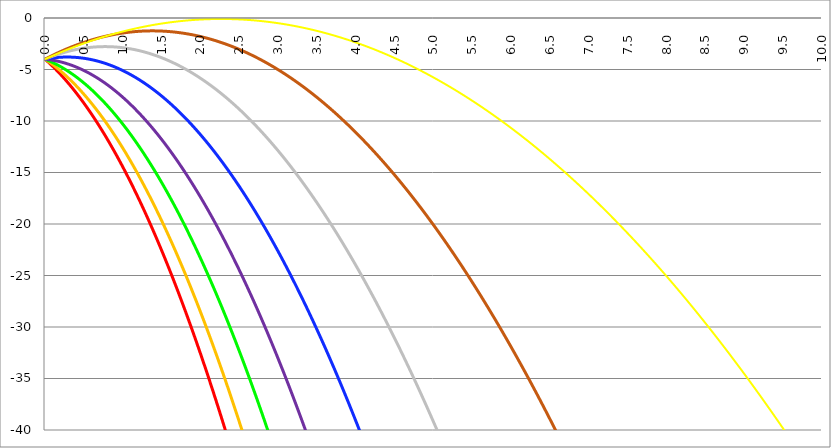
| Category | Series 1 | Series 0 | Series 3 | Series 4 | Series 5 | Series 2 | Series 6 | Series 7 |
|---|---|---|---|---|---|---|---|---|
| 0.0 | -4 | -4 | -4 | -4 | -4 | -4 | -4 | -4 |
| 0.005 | -4.033 | -4.025 | -4.015 | -4.004 | -3.993 | -3.984 | -3.98 | -3.983 |
| 0.01 | -4.066 | -4.05 | -4.03 | -4.007 | -3.986 | -3.969 | -3.96 | -3.966 |
| 0.015 | -4.1 | -4.075 | -4.045 | -4.011 | -3.979 | -3.953 | -3.941 | -3.948 |
| 0.02 | -4.134 | -4.101 | -4.06 | -4.015 | -3.972 | -3.938 | -3.921 | -3.931 |
| 0.025 | -4.167 | -4.127 | -4.075 | -4.019 | -3.965 | -3.922 | -3.901 | -3.914 |
| 0.03 | -4.202 | -4.153 | -4.091 | -4.023 | -3.958 | -3.907 | -3.882 | -3.897 |
| 0.035 | -4.236 | -4.179 | -4.107 | -4.028 | -3.952 | -3.892 | -3.862 | -3.88 |
| 0.04 | -4.27 | -4.205 | -4.123 | -4.032 | -3.946 | -3.877 | -3.843 | -3.863 |
| 0.045 | -4.305 | -4.231 | -4.139 | -4.037 | -3.939 | -3.862 | -3.824 | -3.847 |
| 0.05 | -4.34 | -4.258 | -4.155 | -4.042 | -3.933 | -3.847 | -3.805 | -3.83 |
| 0.055 | -4.375 | -4.285 | -4.171 | -4.047 | -3.927 | -3.833 | -3.785 | -3.813 |
| 0.06 | -4.41 | -4.312 | -4.188 | -4.052 | -3.922 | -3.818 | -3.766 | -3.796 |
| 0.065 | -4.445 | -4.339 | -4.205 | -4.057 | -3.916 | -3.803 | -3.747 | -3.779 |
| 0.07 | -4.481 | -4.366 | -4.222 | -4.063 | -3.91 | -3.789 | -3.728 | -3.763 |
| 0.075 | -4.517 | -4.394 | -4.239 | -4.068 | -3.905 | -3.775 | -3.71 | -3.746 |
| 0.08 | -4.553 | -4.422 | -4.256 | -4.074 | -3.9 | -3.76 | -3.691 | -3.729 |
| 0.085 | -4.589 | -4.449 | -4.273 | -4.08 | -3.894 | -3.746 | -3.672 | -3.713 |
| 0.09 | -4.625 | -4.478 | -4.291 | -4.086 | -3.889 | -3.732 | -3.653 | -3.696 |
| 0.095 | -4.662 | -4.506 | -4.309 | -4.092 | -3.884 | -3.718 | -3.635 | -3.68 |
| 0.1 | -4.699 | -4.534 | -4.327 | -4.099 | -3.88 | -3.705 | -3.616 | -3.663 |
| 0.105 | -4.736 | -4.563 | -4.345 | -4.105 | -3.875 | -3.691 | -3.598 | -3.647 |
| 0.11 | -4.773 | -4.592 | -4.363 | -4.112 | -3.87 | -3.677 | -3.58 | -3.63 |
| 0.115 | -4.81 | -4.621 | -4.382 | -4.119 | -3.866 | -3.664 | -3.561 | -3.614 |
| 0.12 | -4.848 | -4.65 | -4.4 | -4.126 | -3.862 | -3.65 | -3.543 | -3.598 |
| 0.125 | -4.885 | -4.679 | -4.419 | -4.133 | -3.857 | -3.637 | -3.525 | -3.581 |
| 0.13 | -4.923 | -4.709 | -4.438 | -4.14 | -3.853 | -3.624 | -3.507 | -3.565 |
| 0.135 | -4.961 | -4.738 | -4.457 | -4.147 | -3.849 | -3.611 | -3.489 | -3.549 |
| 0.14 | -5 | -4.768 | -4.476 | -4.155 | -3.846 | -3.598 | -3.471 | -3.533 |
| 0.145 | -5.038 | -4.798 | -4.496 | -4.163 | -3.842 | -3.585 | -3.453 | -3.516 |
| 0.15 | -5.077 | -4.829 | -4.515 | -4.171 | -3.838 | -3.572 | -3.435 | -3.5 |
| 0.155 | -5.116 | -4.859 | -4.535 | -4.179 | -3.835 | -3.56 | -3.418 | -3.484 |
| 0.16 | -5.155 | -4.89 | -4.555 | -4.187 | -3.832 | -3.547 | -3.4 | -3.468 |
| 0.165 | -5.194 | -4.921 | -4.575 | -4.195 | -3.829 | -3.535 | -3.382 | -3.452 |
| 0.17 | -5.234 | -4.952 | -4.595 | -4.204 | -3.826 | -3.522 | -3.365 | -3.436 |
| 0.175 | -5.273 | -4.983 | -4.616 | -4.212 | -3.823 | -3.51 | -3.347 | -3.42 |
| 0.18 | -5.313 | -5.014 | -4.636 | -4.221 | -3.82 | -3.498 | -3.33 | -3.404 |
| 0.185 | -5.353 | -5.046 | -4.657 | -4.23 | -3.817 | -3.486 | -3.313 | -3.389 |
| 0.19 | -5.393 | -5.077 | -4.678 | -4.239 | -3.815 | -3.474 | -3.296 | -3.373 |
| 0.195 | -5.434 | -5.109 | -4.699 | -4.248 | -3.812 | -3.462 | -3.278 | -3.357 |
| 0.2 | -5.474 | -5.141 | -4.721 | -4.258 | -3.81 | -3.45 | -3.261 | -3.341 |
| 0.205 | -5.515 | -5.174 | -4.742 | -4.267 | -3.808 | -3.438 | -3.244 | -3.326 |
| 0.21 | -5.556 | -5.206 | -4.764 | -4.277 | -3.806 | -3.427 | -3.228 | -3.31 |
| 0.215 | -5.597 | -5.239 | -4.786 | -4.286 | -3.804 | -3.415 | -3.211 | -3.294 |
| 0.22 | -5.639 | -5.271 | -4.807 | -4.296 | -3.803 | -3.404 | -3.194 | -3.279 |
| 0.225 | -5.68 | -5.304 | -4.83 | -4.307 | -3.801 | -3.393 | -3.177 | -3.263 |
| 0.23 | -5.722 | -5.338 | -4.852 | -4.317 | -3.799 | -3.382 | -3.161 | -3.248 |
| 0.235 | -5.764 | -5.371 | -4.874 | -4.327 | -3.798 | -3.371 | -3.144 | -3.232 |
| 0.24 | -5.806 | -5.405 | -4.897 | -4.338 | -3.797 | -3.36 | -3.128 | -3.217 |
| 0.245 | -5.848 | -5.438 | -4.92 | -4.349 | -3.796 | -3.349 | -3.111 | -3.202 |
| 0.25 | -5.891 | -5.472 | -4.943 | -4.359 | -3.795 | -3.338 | -3.095 | -3.186 |
| 0.255 | -5.934 | -5.506 | -4.966 | -4.37 | -3.794 | -3.328 | -3.079 | -3.171 |
| 0.26 | -5.976 | -5.541 | -4.989 | -4.382 | -3.793 | -3.317 | -3.062 | -3.156 |
| 0.265 | -6.02 | -5.575 | -5.013 | -4.393 | -3.793 | -3.307 | -3.046 | -3.14 |
| 0.27 | -6.063 | -5.61 | -5.036 | -4.404 | -3.792 | -3.296 | -3.03 | -3.125 |
| 0.275 | -6.106 | -5.644 | -5.06 | -4.416 | -3.792 | -3.286 | -3.014 | -3.11 |
| 0.28 | -6.15 | -5.679 | -5.084 | -4.428 | -3.792 | -3.276 | -2.998 | -3.095 |
| 0.285 | -6.194 | -5.715 | -5.108 | -4.44 | -3.792 | -3.266 | -2.982 | -3.08 |
| 0.29 | -6.238 | -5.75 | -5.133 | -4.452 | -3.792 | -3.256 | -2.967 | -3.065 |
| 0.295 | -6.282 | -5.785 | -5.157 | -4.464 | -3.792 | -3.246 | -2.951 | -3.05 |
| 0.3 | -6.327 | -5.821 | -5.182 | -4.476 | -3.792 | -3.236 | -2.935 | -3.035 |
| 0.305 | -6.371 | -5.857 | -5.207 | -4.489 | -3.793 | -3.227 | -2.92 | -3.02 |
| 0.31 | -6.416 | -5.893 | -5.232 | -4.501 | -3.793 | -3.217 | -2.904 | -3.005 |
| 0.315 | -6.461 | -5.929 | -5.257 | -4.514 | -3.794 | -3.208 | -2.889 | -2.99 |
| 0.32 | -6.506 | -5.966 | -5.282 | -4.527 | -3.795 | -3.199 | -2.874 | -2.975 |
| 0.325 | -6.552 | -6.003 | -5.308 | -4.54 | -3.796 | -3.189 | -2.858 | -2.961 |
| 0.33 | -6.597 | -6.039 | -5.333 | -4.554 | -3.797 | -3.18 | -2.843 | -2.946 |
| 0.335 | -6.643 | -6.076 | -5.359 | -4.567 | -3.798 | -3.171 | -2.828 | -2.931 |
| 0.34 | -6.689 | -6.114 | -5.385 | -4.581 | -3.799 | -3.162 | -2.813 | -2.916 |
| 0.345 | -6.735 | -6.151 | -5.411 | -4.594 | -3.801 | -3.154 | -2.798 | -2.902 |
| 0.35 | -6.782 | -6.188 | -5.438 | -4.608 | -3.802 | -3.145 | -2.783 | -2.887 |
| 0.355 | -6.828 | -6.226 | -5.464 | -4.622 | -3.804 | -3.136 | -2.768 | -2.873 |
| 0.36 | -6.875 | -6.264 | -5.491 | -4.636 | -3.806 | -3.128 | -2.754 | -2.858 |
| 0.365 | -6.922 | -6.302 | -5.518 | -4.651 | -3.808 | -3.119 | -2.739 | -2.844 |
| 0.37 | -6.969 | -6.34 | -5.545 | -4.665 | -3.81 | -3.111 | -2.724 | -2.829 |
| 0.375 | -7.016 | -6.379 | -5.572 | -4.68 | -3.812 | -3.103 | -2.71 | -2.815 |
| 0.38 | -7.064 | -6.418 | -5.599 | -4.694 | -3.815 | -3.095 | -2.695 | -2.801 |
| 0.385 | -7.111 | -6.456 | -5.627 | -4.709 | -3.817 | -3.087 | -2.681 | -2.786 |
| 0.39 | -7.159 | -6.495 | -5.654 | -4.724 | -3.82 | -3.079 | -2.667 | -2.772 |
| 0.395 | -7.207 | -6.535 | -5.682 | -4.74 | -3.822 | -3.071 | -2.652 | -2.758 |
| 0.4 | -7.256 | -6.574 | -5.71 | -4.755 | -3.825 | -3.063 | -2.638 | -2.743 |
| 0.405 | -7.304 | -6.613 | -5.738 | -4.771 | -3.828 | -3.056 | -2.624 | -2.729 |
| 0.41 | -7.353 | -6.653 | -5.767 | -4.786 | -3.831 | -3.048 | -2.61 | -2.715 |
| 0.415 | -7.402 | -6.693 | -5.795 | -4.802 | -3.835 | -3.041 | -2.596 | -2.701 |
| 0.42 | -7.451 | -6.733 | -5.824 | -4.818 | -3.838 | -3.034 | -2.582 | -2.687 |
| 0.425 | -7.5 | -6.773 | -5.853 | -4.834 | -3.842 | -3.027 | -2.568 | -2.673 |
| 0.43 | -7.549 | -6.814 | -5.882 | -4.85 | -3.845 | -3.02 | -2.555 | -2.659 |
| 0.435 | -7.599 | -6.855 | -5.911 | -4.867 | -3.849 | -3.013 | -2.541 | -2.645 |
| 0.44 | -7.649 | -6.895 | -5.94 | -4.883 | -3.853 | -3.006 | -2.527 | -2.631 |
| 0.445 | -7.699 | -6.936 | -5.97 | -4.9 | -3.857 | -2.999 | -2.514 | -2.617 |
| 0.45 | -7.749 | -6.978 | -5.999 | -4.917 | -3.861 | -2.992 | -2.5 | -2.604 |
| 0.455 | -7.799 | -7.019 | -6.029 | -4.934 | -3.865 | -2.986 | -2.487 | -2.59 |
| 0.46 | -7.85 | -7.06 | -6.059 | -4.951 | -3.87 | -2.979 | -2.474 | -2.576 |
| 0.465 | -7.901 | -7.102 | -6.09 | -4.968 | -3.874 | -2.973 | -2.46 | -2.562 |
| 0.47 | -7.952 | -7.144 | -6.12 | -4.986 | -3.879 | -2.967 | -2.447 | -2.549 |
| 0.475 | -8.003 | -7.186 | -6.15 | -5.003 | -3.884 | -2.961 | -2.434 | -2.535 |
| 0.48 | -8.054 | -7.228 | -6.181 | -5.021 | -3.889 | -2.955 | -2.421 | -2.521 |
| 0.485 | -8.106 | -7.271 | -6.212 | -5.039 | -3.894 | -2.949 | -2.408 | -2.508 |
| 0.49 | -8.158 | -7.314 | -6.243 | -5.057 | -3.899 | -2.943 | -2.395 | -2.494 |
| 0.495 | -8.209 | -7.356 | -6.274 | -5.075 | -3.904 | -2.937 | -2.382 | -2.481 |
| 0.5 | -8.262 | -7.399 | -6.306 | -5.094 | -3.91 | -2.931 | -2.37 | -2.467 |
| 0.505 | -8.314 | -7.443 | -6.337 | -5.112 | -3.915 | -2.926 | -2.357 | -2.454 |
| 0.51 | -8.366 | -7.486 | -6.369 | -5.131 | -3.921 | -2.92 | -2.344 | -2.441 |
| 0.515 | -8.419 | -7.529 | -6.401 | -5.15 | -3.927 | -2.915 | -2.332 | -2.427 |
| 0.52 | -8.472 | -7.573 | -6.433 | -5.169 | -3.933 | -2.91 | -2.319 | -2.414 |
| 0.525 | -8.525 | -7.617 | -6.465 | -5.188 | -3.939 | -2.905 | -2.307 | -2.401 |
| 0.53 | -8.578 | -7.661 | -6.497 | -5.207 | -3.945 | -2.9 | -2.295 | -2.387 |
| 0.535 | -8.632 | -7.705 | -6.53 | -5.226 | -3.951 | -2.895 | -2.282 | -2.374 |
| 0.54 | -8.685 | -7.75 | -6.563 | -5.246 | -3.958 | -2.89 | -2.27 | -2.361 |
| 0.545 | -8.739 | -7.795 | -6.596 | -5.266 | -3.964 | -2.885 | -2.258 | -2.348 |
| 0.55 | -8.793 | -7.839 | -6.629 | -5.286 | -3.971 | -2.881 | -2.246 | -2.335 |
| 0.555 | -8.848 | -7.884 | -6.662 | -5.306 | -3.978 | -2.876 | -2.234 | -2.322 |
| 0.56 | -8.902 | -7.93 | -6.695 | -5.326 | -3.985 | -2.872 | -2.222 | -2.309 |
| 0.565 | -8.957 | -7.975 | -6.729 | -5.346 | -3.992 | -2.867 | -2.211 | -2.296 |
| 0.57 | -9.011 | -8.02 | -6.762 | -5.367 | -3.999 | -2.863 | -2.199 | -2.283 |
| 0.575 | -9.066 | -8.066 | -6.796 | -5.387 | -4.006 | -2.859 | -2.187 | -2.27 |
| 0.58 | -9.122 | -8.112 | -6.83 | -5.408 | -4.014 | -2.855 | -2.176 | -2.257 |
| 0.585 | -9.177 | -8.158 | -6.865 | -5.429 | -4.022 | -2.851 | -2.164 | -2.245 |
| 0.59 | -9.233 | -8.205 | -6.899 | -5.45 | -4.029 | -2.847 | -2.153 | -2.232 |
| 0.595 | -9.288 | -8.251 | -6.934 | -5.471 | -4.037 | -2.844 | -2.141 | -2.219 |
| 0.6 | -9.344 | -8.298 | -6.968 | -5.493 | -4.045 | -2.84 | -2.13 | -2.206 |
| 0.605 | -9.4 | -8.344 | -7.003 | -5.514 | -4.053 | -2.837 | -2.119 | -2.194 |
| 0.61 | -9.457 | -8.391 | -7.038 | -5.536 | -4.061 | -2.833 | -2.108 | -2.181 |
| 0.615 | -9.513 | -8.439 | -7.074 | -5.557 | -4.07 | -2.83 | -2.096 | -2.169 |
| 0.62 | -9.57 | -8.486 | -7.109 | -5.579 | -4.078 | -2.827 | -2.085 | -2.156 |
| 0.625 | -9.627 | -8.534 | -7.145 | -5.602 | -4.087 | -2.824 | -2.074 | -2.144 |
| 0.63 | -9.684 | -8.581 | -7.18 | -5.624 | -4.096 | -2.821 | -2.064 | -2.131 |
| 0.635 | -9.741 | -8.629 | -7.216 | -5.646 | -4.105 | -2.818 | -2.053 | -2.119 |
| 0.64 | -9.799 | -8.677 | -7.252 | -5.669 | -4.114 | -2.815 | -2.042 | -2.106 |
| 0.645 | -9.857 | -8.726 | -7.288 | -5.692 | -4.123 | -2.812 | -2.031 | -2.094 |
| 0.65 | -9.914 | -8.774 | -7.325 | -5.714 | -4.132 | -2.81 | -2.021 | -2.082 |
| 0.655 | -9.973 | -8.823 | -7.361 | -5.737 | -4.141 | -2.807 | -2.01 | -2.069 |
| 0.66 | -10.031 | -8.872 | -7.398 | -5.761 | -4.151 | -2.805 | -2 | -2.057 |
| 0.665 | -10.089 | -8.921 | -7.435 | -5.784 | -4.161 | -2.803 | -1.99 | -2.045 |
| 0.67 | -10.148 | -8.97 | -7.472 | -5.807 | -4.17 | -2.8 | -1.979 | -2.033 |
| 0.675 | -10.207 | -9.019 | -7.509 | -5.831 | -4.18 | -2.798 | -1.969 | -2.021 |
| 0.68 | -10.266 | -9.069 | -7.547 | -5.855 | -4.19 | -2.796 | -1.959 | -2.009 |
| 0.685 | -10.325 | -9.118 | -7.584 | -5.879 | -4.201 | -2.794 | -1.949 | -1.997 |
| 0.69 | -10.384 | -9.168 | -7.622 | -5.903 | -4.211 | -2.793 | -1.939 | -1.985 |
| 0.695 | -10.444 | -9.218 | -7.66 | -5.927 | -4.221 | -2.791 | -1.929 | -1.973 |
| 0.7 | -10.504 | -9.269 | -7.698 | -5.951 | -4.232 | -2.789 | -1.919 | -1.961 |
| 0.705 | -10.564 | -9.319 | -7.737 | -5.976 | -4.243 | -2.788 | -1.909 | -1.949 |
| 0.71 | -10.624 | -9.37 | -7.775 | -6 | -4.253 | -2.787 | -1.9 | -1.937 |
| 0.715 | -10.684 | -9.421 | -7.814 | -6.025 | -4.264 | -2.785 | -1.89 | -1.925 |
| 0.72 | -10.745 | -9.472 | -7.852 | -6.05 | -4.275 | -2.784 | -1.88 | -1.913 |
| 0.725 | -10.806 | -9.523 | -7.891 | -6.075 | -4.287 | -2.783 | -1.871 | -1.902 |
| 0.73 | -10.867 | -9.574 | -7.93 | -6.101 | -4.298 | -2.782 | -1.861 | -1.89 |
| 0.735 | -10.928 | -9.626 | -7.97 | -6.126 | -4.309 | -2.781 | -1.852 | -1.878 |
| 0.74 | -10.989 | -9.678 | -8.009 | -6.152 | -4.321 | -2.781 | -1.843 | -1.867 |
| 0.745 | -11.051 | -9.729 | -8.049 | -6.177 | -4.333 | -2.78 | -1.834 | -1.855 |
| 0.75 | -11.112 | -9.782 | -8.088 | -6.203 | -4.344 | -2.78 | -1.824 | -1.844 |
| 0.755 | -11.174 | -9.834 | -8.128 | -6.229 | -4.356 | -2.779 | -1.815 | -1.832 |
| 0.76 | -11.236 | -9.886 | -8.168 | -6.255 | -4.368 | -2.779 | -1.806 | -1.821 |
| 0.765 | -11.299 | -9.939 | -8.209 | -6.282 | -4.381 | -2.779 | -1.797 | -1.809 |
| 0.77 | -11.361 | -9.992 | -8.249 | -6.308 | -4.393 | -2.778 | -1.789 | -1.798 |
| 0.775000000000001 | -11.424 | -10.045 | -8.29 | -6.335 | -4.405 | -2.778 | -1.78 | -1.786 |
| 0.78 | -11.487 | -10.098 | -8.331 | -6.361 | -4.418 | -2.778 | -1.771 | -1.775 |
| 0.785000000000001 | -11.55 | -10.151 | -8.372 | -6.388 | -4.431 | -2.779 | -1.762 | -1.764 |
| 0.79 | -11.613 | -10.205 | -8.413 | -6.415 | -4.444 | -2.779 | -1.754 | -1.753 |
| 0.795000000000001 | -11.677 | -10.259 | -8.454 | -6.443 | -4.457 | -2.779 | -1.745 | -1.741 |
| 0.800000000000001 | -11.74 | -10.313 | -8.495 | -6.47 | -4.47 | -2.78 | -1.737 | -1.73 |
| 0.805000000000001 | -11.804 | -10.367 | -8.537 | -6.498 | -4.483 | -2.78 | -1.729 | -1.719 |
| 0.810000000000001 | -11.868 | -10.421 | -8.579 | -6.525 | -4.496 | -2.781 | -1.72 | -1.708 |
| 0.815000000000001 | -11.932 | -10.475 | -8.621 | -6.553 | -4.51 | -2.782 | -1.712 | -1.697 |
| 0.820000000000001 | -11.997 | -10.53 | -8.663 | -6.581 | -4.523 | -2.783 | -1.704 | -1.686 |
| 0.825000000000001 | -12.061 | -10.585 | -8.705 | -6.609 | -4.537 | -2.784 | -1.696 | -1.675 |
| 0.830000000000001 | -12.126 | -10.64 | -8.748 | -6.637 | -4.551 | -2.785 | -1.688 | -1.664 |
| 0.835000000000001 | -12.191 | -10.695 | -8.79 | -6.666 | -4.565 | -2.786 | -1.68 | -1.653 |
| 0.840000000000001 | -12.256 | -10.75 | -8.833 | -6.694 | -4.579 | -2.787 | -1.672 | -1.642 |
| 0.845000000000001 | -12.322 | -10.806 | -8.876 | -6.723 | -4.594 | -2.789 | -1.664 | -1.631 |
| 0.850000000000001 | -12.387 | -10.862 | -8.919 | -6.752 | -4.608 | -2.79 | -1.657 | -1.621 |
| 0.855000000000001 | -12.453 | -10.918 | -8.962 | -6.781 | -4.622 | -2.792 | -1.649 | -1.61 |
| 0.860000000000001 | -12.519 | -10.974 | -9.006 | -6.81 | -4.637 | -2.794 | -1.642 | -1.599 |
| 0.865000000000001 | -12.585 | -11.03 | -9.05 | -6.839 | -4.652 | -2.795 | -1.634 | -1.588 |
| 0.870000000000001 | -12.651 | -11.087 | -9.093 | -6.869 | -4.667 | -2.797 | -1.627 | -1.578 |
| 0.875000000000001 | -12.718 | -11.143 | -9.137 | -6.898 | -4.682 | -2.799 | -1.619 | -1.567 |
| 0.880000000000001 | -12.785 | -11.2 | -9.181 | -6.928 | -4.697 | -2.801 | -1.612 | -1.557 |
| 0.885000000000001 | -12.851 | -11.257 | -9.226 | -6.958 | -4.712 | -2.804 | -1.605 | -1.546 |
| 0.890000000000001 | -12.919 | -11.314 | -9.27 | -6.988 | -4.728 | -2.806 | -1.598 | -1.536 |
| 0.895000000000001 | -12.986 | -11.372 | -9.315 | -7.018 | -4.743 | -2.808 | -1.591 | -1.525 |
| 0.900000000000001 | -13.053 | -11.429 | -9.36 | -7.049 | -4.759 | -2.811 | -1.584 | -1.515 |
| 0.905000000000001 | -13.121 | -11.487 | -9.405 | -7.079 | -4.775 | -2.813 | -1.577 | -1.504 |
| 0.910000000000001 | -13.189 | -11.545 | -9.45 | -7.11 | -4.791 | -2.816 | -1.57 | -1.494 |
| 0.915000000000001 | -13.257 | -11.603 | -9.495 | -7.141 | -4.807 | -2.819 | -1.563 | -1.484 |
| 0.920000000000001 | -13.325 | -11.661 | -9.541 | -7.172 | -4.823 | -2.822 | -1.556 | -1.474 |
| 0.925000000000001 | -13.394 | -11.72 | -9.586 | -7.203 | -4.839 | -2.825 | -1.55 | -1.463 |
| 0.930000000000001 | -13.462 | -11.778 | -9.632 | -7.234 | -4.856 | -2.828 | -1.543 | -1.453 |
| 0.935000000000001 | -13.531 | -11.837 | -9.678 | -7.265 | -4.872 | -2.831 | -1.537 | -1.443 |
| 0.940000000000001 | -13.6 | -11.896 | -9.724 | -7.297 | -4.889 | -2.835 | -1.53 | -1.433 |
| 0.945000000000001 | -13.669 | -11.955 | -9.771 | -7.329 | -4.906 | -2.838 | -1.524 | -1.423 |
| 0.950000000000001 | -13.739 | -12.015 | -9.817 | -7.361 | -4.923 | -2.842 | -1.518 | -1.413 |
| 0.955000000000001 | -13.808 | -12.074 | -9.864 | -7.393 | -4.94 | -2.845 | -1.512 | -1.403 |
| 0.960000000000001 | -13.878 | -12.134 | -9.911 | -7.425 | -4.957 | -2.849 | -1.506 | -1.393 |
| 0.965000000000001 | -13.948 | -12.194 | -9.958 | -7.457 | -4.974 | -2.853 | -1.499 | -1.383 |
| 0.970000000000001 | -14.018 | -12.254 | -10.005 | -7.49 | -4.992 | -2.857 | -1.494 | -1.373 |
| 0.975000000000001 | -14.089 | -12.315 | -10.052 | -7.522 | -5.009 | -2.861 | -1.488 | -1.363 |
| 0.980000000000001 | -14.159 | -12.375 | -10.1 | -7.555 | -5.027 | -2.865 | -1.482 | -1.354 |
| 0.985000000000001 | -14.23 | -12.436 | -10.147 | -7.588 | -5.045 | -2.869 | -1.476 | -1.344 |
| 0.990000000000001 | -14.301 | -12.496 | -10.195 | -7.621 | -5.063 | -2.874 | -1.47 | -1.334 |
| 0.995000000000001 | -14.372 | -12.557 | -10.243 | -7.654 | -5.081 | -2.878 | -1.465 | -1.324 |
| 1.000000000000001 | -14.443 | -12.619 | -10.291 | -7.688 | -5.099 | -2.883 | -1.459 | -1.315 |
| 1.005000000000001 | -14.515 | -12.68 | -10.34 | -7.721 | -5.118 | -2.887 | -1.454 | -1.305 |
| 1.01 | -14.586 | -12.742 | -10.388 | -7.755 | -5.136 | -2.892 | -1.448 | -1.296 |
| 1.015 | -14.658 | -12.803 | -10.437 | -7.788 | -5.155 | -2.897 | -1.443 | -1.286 |
| 1.02 | -14.73 | -12.865 | -10.486 | -7.822 | -5.173 | -2.902 | -1.438 | -1.276 |
| 1.025 | -14.803 | -12.927 | -10.535 | -7.857 | -5.192 | -2.907 | -1.433 | -1.267 |
| 1.03 | -14.875 | -12.99 | -10.584 | -7.891 | -5.211 | -2.912 | -1.427 | -1.258 |
| 1.035 | -14.948 | -13.052 | -10.633 | -7.925 | -5.23 | -2.917 | -1.422 | -1.248 |
| 1.04 | -15.021 | -13.115 | -10.683 | -7.96 | -5.25 | -2.923 | -1.417 | -1.239 |
| 1.045 | -15.094 | -13.178 | -10.732 | -7.995 | -5.269 | -2.928 | -1.413 | -1.23 |
| 1.05 | -15.167 | -13.241 | -10.782 | -8.029 | -5.289 | -2.934 | -1.408 | -1.22 |
| 1.054999999999999 | -15.24 | -13.304 | -10.832 | -8.064 | -5.308 | -2.94 | -1.403 | -1.211 |
| 1.059999999999999 | -15.314 | -13.367 | -10.882 | -8.1 | -5.328 | -2.945 | -1.398 | -1.202 |
| 1.064999999999999 | -15.388 | -13.431 | -10.933 | -8.135 | -5.348 | -2.951 | -1.394 | -1.193 |
| 1.069999999999999 | -15.462 | -13.495 | -10.983 | -8.17 | -5.368 | -2.957 | -1.389 | -1.184 |
| 1.074999999999999 | -15.536 | -13.559 | -11.034 | -8.206 | -5.388 | -2.963 | -1.385 | -1.175 |
| 1.079999999999999 | -15.61 | -13.623 | -11.085 | -8.242 | -5.408 | -2.97 | -1.38 | -1.166 |
| 1.084999999999999 | -15.685 | -13.687 | -11.136 | -8.278 | -5.429 | -2.976 | -1.376 | -1.157 |
| 1.089999999999999 | -15.76 | -13.751 | -11.187 | -8.314 | -5.449 | -2.982 | -1.372 | -1.148 |
| 1.094999999999999 | -15.835 | -13.816 | -11.238 | -8.35 | -5.47 | -2.989 | -1.368 | -1.139 |
| 1.099999999999999 | -15.91 | -13.881 | -11.29 | -8.386 | -5.491 | -2.995 | -1.364 | -1.13 |
| 1.104999999999998 | -15.985 | -13.946 | -11.342 | -8.423 | -5.512 | -3.002 | -1.359 | -1.121 |
| 1.109999999999998 | -16.061 | -14.011 | -11.393 | -8.459 | -5.533 | -3.009 | -1.356 | -1.112 |
| 1.114999999999998 | -16.137 | -14.077 | -11.446 | -8.496 | -5.554 | -3.016 | -1.352 | -1.103 |
| 1.119999999999998 | -16.212 | -14.142 | -11.498 | -8.533 | -5.575 | -3.023 | -1.348 | -1.095 |
| 1.124999999999998 | -16.289 | -14.208 | -11.55 | -8.57 | -5.597 | -3.03 | -1.344 | -1.086 |
| 1.129999999999998 | -16.365 | -14.274 | -11.603 | -8.608 | -5.618 | -3.037 | -1.34 | -1.077 |
| 1.134999999999998 | -16.441 | -14.34 | -11.655 | -8.645 | -5.64 | -3.044 | -1.337 | -1.069 |
| 1.139999999999998 | -16.518 | -14.406 | -11.708 | -8.683 | -5.662 | -3.052 | -1.333 | -1.06 |
| 1.144999999999998 | -16.595 | -14.473 | -11.761 | -8.72 | -5.684 | -3.059 | -1.33 | -1.052 |
| 1.149999999999997 | -16.672 | -14.539 | -11.814 | -8.758 | -5.706 | -3.067 | -1.326 | -1.043 |
| 1.154999999999997 | -16.749 | -14.606 | -11.868 | -8.796 | -5.728 | -3.075 | -1.323 | -1.035 |
| 1.159999999999997 | -16.827 | -14.673 | -11.921 | -8.834 | -5.75 | -3.083 | -1.32 | -1.026 |
| 1.164999999999997 | -16.904 | -14.74 | -11.975 | -8.873 | -5.773 | -3.09 | -1.317 | -1.018 |
| 1.169999999999997 | -16.982 | -14.808 | -12.029 | -8.911 | -5.795 | -3.099 | -1.314 | -1.009 |
| 1.174999999999997 | -17.06 | -14.875 | -12.083 | -8.95 | -5.818 | -3.107 | -1.311 | -1.001 |
| 1.179999999999997 | -17.139 | -14.943 | -12.137 | -8.988 | -5.841 | -3.115 | -1.308 | -0.993 |
| 1.184999999999997 | -17.217 | -15.011 | -12.192 | -9.027 | -5.864 | -3.123 | -1.305 | -0.985 |
| 1.189999999999997 | -17.296 | -15.079 | -12.246 | -9.066 | -5.887 | -3.132 | -1.302 | -0.976 |
| 1.194999999999996 | -17.374 | -15.148 | -12.301 | -9.106 | -5.91 | -3.14 | -1.299 | -0.968 |
| 1.199999999999996 | -17.453 | -15.216 | -12.356 | -9.145 | -5.933 | -3.149 | -1.297 | -0.96 |
| 1.204999999999996 | -17.533 | -15.285 | -12.411 | -9.185 | -5.957 | -3.158 | -1.294 | -0.952 |
| 1.209999999999996 | -17.612 | -15.354 | -12.466 | -9.224 | -5.981 | -3.166 | -1.292 | -0.944 |
| 1.214999999999996 | -17.692 | -15.423 | -12.522 | -9.264 | -6.004 | -3.175 | -1.289 | -0.936 |
| 1.219999999999996 | -17.771 | -15.492 | -12.577 | -9.304 | -6.028 | -3.184 | -1.287 | -0.928 |
| 1.224999999999996 | -17.851 | -15.561 | -12.633 | -9.344 | -6.052 | -3.194 | -1.284 | -0.92 |
| 1.229999999999996 | -17.931 | -15.631 | -12.689 | -9.384 | -6.076 | -3.203 | -1.282 | -0.912 |
| 1.234999999999996 | -18.012 | -15.701 | -12.745 | -9.425 | -6.1 | -3.212 | -1.28 | -0.904 |
| 1.239999999999996 | -18.092 | -15.77 | -12.801 | -9.465 | -6.125 | -3.222 | -1.278 | -0.896 |
| 1.244999999999995 | -18.173 | -15.841 | -12.857 | -9.506 | -6.149 | -3.231 | -1.276 | -0.889 |
| 1.249999999999995 | -18.254 | -15.911 | -12.914 | -9.547 | -6.174 | -3.241 | -1.274 | -0.881 |
| 1.254999999999995 | -18.335 | -15.981 | -12.971 | -9.588 | -6.199 | -3.251 | -1.272 | -0.873 |
| 1.259999999999995 | -18.416 | -16.052 | -13.028 | -9.629 | -6.224 | -3.261 | -1.27 | -0.865 |
| 1.264999999999995 | -18.498 | -16.123 | -13.085 | -9.67 | -6.249 | -3.27 | -1.269 | -0.858 |
| 1.269999999999995 | -18.58 | -16.194 | -13.142 | -9.712 | -6.274 | -3.281 | -1.267 | -0.85 |
| 1.274999999999995 | -18.661 | -16.265 | -13.199 | -9.753 | -6.299 | -3.291 | -1.265 | -0.843 |
| 1.279999999999995 | -18.744 | -16.337 | -13.257 | -9.795 | -6.324 | -3.301 | -1.264 | -0.835 |
| 1.284999999999995 | -18.826 | -16.408 | -13.315 | -9.837 | -6.35 | -3.311 | -1.262 | -0.828 |
| 1.289999999999994 | -18.908 | -16.48 | -13.373 | -9.879 | -6.376 | -3.322 | -1.261 | -0.82 |
| 1.294999999999994 | -18.991 | -16.552 | -13.431 | -9.921 | -6.401 | -3.332 | -1.26 | -0.813 |
| 1.299999999999994 | -19.074 | -16.624 | -13.489 | -9.964 | -6.427 | -3.343 | -1.259 | -0.806 |
| 1.304999999999994 | -19.157 | -16.696 | -13.547 | -10.006 | -6.453 | -3.354 | -1.257 | -0.798 |
| 1.309999999999994 | -19.24 | -16.769 | -13.606 | -10.049 | -6.48 | -3.365 | -1.256 | -0.791 |
| 1.314999999999994 | -19.323 | -16.841 | -13.665 | -10.092 | -6.506 | -3.376 | -1.255 | -0.784 |
| 1.319999999999994 | -19.407 | -16.914 | -13.724 | -10.135 | -6.532 | -3.387 | -1.254 | -0.776 |
| 1.324999999999994 | -19.491 | -16.987 | -13.783 | -10.178 | -6.559 | -3.398 | -1.254 | -0.769 |
| 1.329999999999994 | -19.575 | -17.06 | -13.842 | -10.221 | -6.586 | -3.409 | -1.253 | -0.762 |
| 1.334999999999993 | -19.659 | -17.134 | -13.901 | -10.264 | -6.612 | -3.421 | -1.252 | -0.755 |
| 1.339999999999993 | -19.743 | -17.207 | -13.961 | -10.308 | -6.639 | -3.432 | -1.251 | -0.748 |
| 1.344999999999993 | -19.828 | -17.281 | -14.021 | -10.352 | -6.666 | -3.444 | -1.251 | -0.741 |
| 1.349999999999993 | -19.913 | -17.355 | -14.081 | -10.396 | -6.694 | -3.456 | -1.25 | -0.734 |
| 1.354999999999993 | -19.998 | -17.429 | -14.141 | -10.44 | -6.721 | -3.467 | -1.25 | -0.727 |
| 1.359999999999993 | -20.083 | -17.504 | -14.201 | -10.484 | -6.748 | -3.479 | -1.25 | -0.72 |
| 1.364999999999993 | -20.168 | -17.578 | -14.262 | -10.528 | -6.776 | -3.491 | -1.249 | -0.713 |
| 1.369999999999993 | -20.254 | -17.653 | -14.322 | -10.573 | -6.804 | -3.503 | -1.249 | -0.706 |
| 1.374999999999993 | -20.339 | -17.728 | -14.383 | -10.617 | -6.831 | -3.516 | -1.249 | -0.7 |
| 1.379999999999993 | -20.425 | -17.803 | -14.444 | -10.662 | -6.859 | -3.528 | -1.249 | -0.693 |
| 1.384999999999992 | -20.511 | -17.878 | -14.505 | -10.707 | -6.887 | -3.54 | -1.249 | -0.686 |
| 1.389999999999992 | -20.598 | -17.953 | -14.566 | -10.752 | -6.916 | -3.553 | -1.249 | -0.679 |
| 1.394999999999992 | -20.684 | -18.029 | -14.628 | -10.797 | -6.944 | -3.565 | -1.249 | -0.673 |
| 1.399999999999992 | -20.771 | -18.105 | -14.689 | -10.842 | -6.972 | -3.578 | -1.249 | -0.666 |
| 1.404999999999992 | -20.858 | -18.181 | -14.751 | -10.888 | -7.001 | -3.591 | -1.25 | -0.66 |
| 1.409999999999992 | -20.945 | -18.257 | -14.813 | -10.934 | -7.03 | -3.604 | -1.25 | -0.653 |
| 1.414999999999992 | -21.032 | -18.333 | -14.875 | -10.979 | -7.059 | -3.617 | -1.25 | -0.647 |
| 1.419999999999992 | -21.12 | -18.409 | -14.937 | -11.025 | -7.088 | -3.63 | -1.251 | -0.64 |
| 1.424999999999992 | -21.207 | -18.486 | -15 | -11.072 | -7.117 | -3.643 | -1.251 | -0.634 |
| 1.429999999999991 | -21.295 | -18.563 | -15.062 | -11.118 | -7.146 | -3.657 | -1.252 | -0.627 |
| 1.434999999999991 | -21.383 | -18.64 | -15.125 | -11.164 | -7.175 | -3.67 | -1.253 | -0.621 |
| 1.439999999999991 | -21.471 | -18.717 | -15.188 | -11.211 | -7.205 | -3.684 | -1.254 | -0.615 |
| 1.444999999999991 | -21.56 | -18.795 | -15.251 | -11.258 | -7.234 | -3.697 | -1.254 | -0.608 |
| 1.449999999999991 | -21.648 | -18.872 | -15.315 | -11.304 | -7.264 | -3.711 | -1.255 | -0.602 |
| 1.454999999999991 | -21.737 | -18.95 | -15.378 | -11.351 | -7.294 | -3.725 | -1.256 | -0.596 |
| 1.459999999999991 | -21.826 | -19.028 | -15.442 | -11.399 | -7.324 | -3.739 | -1.258 | -0.59 |
| 1.464999999999991 | -21.915 | -19.106 | -15.506 | -11.446 | -7.354 | -3.753 | -1.259 | -0.584 |
| 1.469999999999991 | -22.005 | -19.184 | -15.569 | -11.493 | -7.385 | -3.767 | -1.26 | -0.578 |
| 1.474999999999991 | -22.094 | -19.263 | -15.634 | -11.541 | -7.415 | -3.781 | -1.261 | -0.572 |
| 1.47999999999999 | -22.184 | -19.342 | -15.698 | -11.589 | -7.445 | -3.796 | -1.263 | -0.566 |
| 1.48499999999999 | -22.274 | -19.42 | -15.762 | -11.637 | -7.476 | -3.81 | -1.264 | -0.56 |
| 1.48999999999999 | -22.364 | -19.499 | -15.827 | -11.685 | -7.507 | -3.825 | -1.266 | -0.554 |
| 1.49499999999999 | -22.454 | -19.579 | -15.892 | -11.733 | -7.538 | -3.839 | -1.267 | -0.548 |
| 1.49999999999999 | -22.545 | -19.658 | -15.957 | -11.781 | -7.569 | -3.854 | -1.269 | -0.542 |
| 1.50499999999999 | -22.636 | -19.738 | -16.022 | -11.83 | -7.6 | -3.869 | -1.271 | -0.536 |
| 1.50999999999999 | -22.726 | -19.817 | -16.087 | -11.878 | -7.631 | -3.884 | -1.272 | -0.53 |
| 1.51499999999999 | -22.818 | -19.897 | -16.153 | -11.927 | -7.663 | -3.899 | -1.274 | -0.525 |
| 1.51999999999999 | -22.909 | -19.977 | -16.218 | -11.976 | -7.694 | -3.914 | -1.276 | -0.519 |
| 1.524999999999989 | -23 | -20.058 | -16.284 | -12.025 | -7.726 | -3.929 | -1.278 | -0.513 |
| 1.529999999999989 | -23.092 | -20.138 | -16.35 | -12.075 | -7.758 | -3.945 | -1.28 | -0.508 |
| 1.534999999999989 | -23.184 | -20.219 | -16.416 | -12.124 | -7.79 | -3.96 | -1.282 | -0.502 |
| 1.539999999999989 | -23.276 | -20.3 | -16.483 | -12.174 | -7.822 | -3.976 | -1.285 | -0.497 |
| 1.544999999999989 | -23.368 | -20.381 | -16.549 | -12.223 | -7.854 | -3.992 | -1.287 | -0.491 |
| 1.549999999999989 | -23.461 | -20.462 | -16.616 | -12.273 | -7.886 | -4.007 | -1.289 | -0.486 |
| 1.554999999999989 | -23.553 | -20.543 | -16.683 | -12.323 | -7.919 | -4.023 | -1.292 | -0.48 |
| 1.559999999999989 | -23.646 | -20.625 | -16.75 | -12.373 | -7.951 | -4.039 | -1.294 | -0.475 |
| 1.564999999999989 | -23.739 | -20.707 | -16.817 | -12.424 | -7.984 | -4.055 | -1.297 | -0.47 |
| 1.569999999999989 | -23.832 | -20.789 | -16.884 | -12.474 | -8.017 | -4.071 | -1.3 | -0.464 |
| 1.574999999999988 | -23.926 | -20.871 | -16.952 | -12.525 | -8.05 | -4.088 | -1.302 | -0.459 |
| 1.579999999999988 | -24.019 | -20.953 | -17.019 | -12.575 | -8.083 | -4.104 | -1.305 | -0.454 |
| 1.584999999999988 | -24.113 | -21.036 | -17.087 | -12.626 | -8.116 | -4.121 | -1.308 | -0.448 |
| 1.589999999999988 | -24.207 | -21.118 | -17.155 | -12.677 | -8.149 | -4.137 | -1.311 | -0.443 |
| 1.594999999999988 | -24.301 | -21.201 | -17.223 | -12.729 | -8.183 | -4.154 | -1.314 | -0.438 |
| 1.599999999999988 | -24.396 | -21.284 | -17.292 | -12.78 | -8.216 | -4.171 | -1.317 | -0.433 |
| 1.604999999999988 | -24.49 | -21.368 | -17.36 | -12.832 | -8.25 | -4.188 | -1.32 | -0.428 |
| 1.609999999999988 | -24.585 | -21.451 | -17.429 | -12.883 | -8.284 | -4.205 | -1.324 | -0.423 |
| 1.614999999999987 | -24.68 | -21.535 | -17.498 | -12.935 | -8.318 | -4.222 | -1.327 | -0.418 |
| 1.619999999999987 | -24.775 | -21.618 | -17.567 | -12.987 | -8.352 | -4.239 | -1.33 | -0.413 |
| 1.624999999999987 | -24.87 | -21.702 | -17.636 | -13.039 | -8.386 | -4.256 | -1.334 | -0.408 |
| 1.629999999999987 | -24.966 | -21.786 | -17.705 | -13.091 | -8.421 | -4.274 | -1.337 | -0.403 |
| 1.634999999999987 | -25.061 | -21.871 | -17.775 | -13.144 | -8.455 | -4.291 | -1.341 | -0.399 |
| 1.639999999999987 | -25.157 | -21.955 | -17.844 | -13.196 | -8.49 | -4.309 | -1.345 | -0.394 |
| 1.644999999999987 | -25.253 | -22.04 | -17.914 | -13.249 | -8.524 | -4.327 | -1.348 | -0.389 |
| 1.649999999999987 | -25.35 | -22.125 | -17.984 | -13.302 | -8.559 | -4.344 | -1.352 | -0.384 |
| 1.654999999999987 | -25.446 | -22.21 | -18.054 | -13.355 | -8.594 | -4.362 | -1.356 | -0.38 |
| 1.659999999999986 | -25.543 | -22.295 | -18.125 | -13.408 | -8.629 | -4.38 | -1.36 | -0.375 |
| 1.664999999999986 | -25.64 | -22.38 | -18.195 | -13.461 | -8.665 | -4.398 | -1.364 | -0.37 |
| 1.669999999999986 | -25.737 | -22.466 | -18.266 | -13.515 | -8.7 | -4.417 | -1.368 | -0.366 |
| 1.674999999999986 | -25.834 | -22.552 | -18.337 | -13.568 | -8.736 | -4.435 | -1.372 | -0.361 |
| 1.679999999999986 | -25.931 | -22.638 | -18.408 | -13.622 | -8.771 | -4.453 | -1.377 | -0.357 |
| 1.684999999999986 | -26.029 | -22.724 | -18.479 | -13.676 | -8.807 | -4.472 | -1.381 | -0.352 |
| 1.689999999999986 | -26.127 | -22.81 | -18.55 | -13.73 | -8.843 | -4.491 | -1.385 | -0.348 |
| 1.694999999999986 | -26.225 | -22.897 | -18.622 | -13.784 | -8.879 | -4.509 | -1.39 | -0.344 |
| 1.699999999999986 | -26.323 | -22.983 | -18.693 | -13.839 | -8.915 | -4.528 | -1.394 | -0.339 |
| 1.704999999999986 | -26.421 | -23.07 | -18.765 | -13.893 | -8.951 | -4.547 | -1.399 | -0.335 |
| 1.709999999999985 | -26.52 | -23.157 | -18.837 | -13.948 | -8.988 | -4.566 | -1.404 | -0.331 |
| 1.714999999999985 | -26.619 | -23.245 | -18.91 | -14.003 | -9.024 | -4.585 | -1.408 | -0.327 |
| 1.719999999999985 | -26.718 | -23.332 | -18.982 | -14.058 | -9.061 | -4.605 | -1.413 | -0.322 |
| 1.724999999999985 | -26.817 | -23.42 | -19.054 | -14.113 | -9.098 | -4.624 | -1.418 | -0.318 |
| 1.729999999999985 | -26.916 | -23.507 | -19.127 | -14.168 | -9.135 | -4.643 | -1.423 | -0.314 |
| 1.734999999999985 | -27.016 | -23.595 | -19.2 | -14.223 | -9.172 | -4.663 | -1.428 | -0.31 |
| 1.739999999999985 | -27.116 | -23.683 | -19.273 | -14.279 | -9.209 | -4.683 | -1.433 | -0.306 |
| 1.744999999999985 | -27.215 | -23.772 | -19.346 | -14.335 | -9.246 | -4.702 | -1.438 | -0.302 |
| 1.749999999999985 | -27.316 | -23.86 | -19.42 | -14.391 | -9.284 | -4.722 | -1.444 | -0.298 |
| 1.754999999999984 | -27.416 | -23.949 | -19.493 | -14.447 | -9.321 | -4.742 | -1.449 | -0.294 |
| 1.759999999999984 | -27.516 | -24.038 | -19.567 | -14.503 | -9.359 | -4.762 | -1.454 | -0.29 |
| 1.764999999999984 | -27.617 | -24.127 | -19.641 | -14.559 | -9.397 | -4.782 | -1.46 | -0.287 |
| 1.769999999999984 | -27.718 | -24.216 | -19.715 | -14.616 | -9.435 | -4.803 | -1.465 | -0.283 |
| 1.774999999999984 | -27.819 | -24.305 | -19.789 | -14.672 | -9.473 | -4.823 | -1.471 | -0.279 |
| 1.779999999999984 | -27.92 | -24.395 | -19.863 | -14.729 | -9.511 | -4.844 | -1.477 | -0.275 |
| 1.784999999999984 | -28.022 | -24.485 | -19.938 | -14.786 | -9.549 | -4.864 | -1.482 | -0.272 |
| 1.789999999999984 | -28.123 | -24.575 | -20.013 | -14.843 | -9.588 | -4.885 | -1.488 | -0.268 |
| 1.794999999999984 | -28.225 | -24.665 | -20.088 | -14.9 | -9.626 | -4.906 | -1.494 | -0.264 |
| 1.799999999999984 | -28.327 | -24.755 | -20.163 | -14.957 | -9.665 | -4.926 | -1.5 | -0.261 |
| 1.804999999999983 | -28.43 | -24.846 | -20.238 | -15.015 | -9.704 | -4.947 | -1.506 | -0.257 |
| 1.809999999999983 | -28.532 | -24.936 | -20.313 | -15.073 | -9.743 | -4.969 | -1.512 | -0.254 |
| 1.814999999999983 | -28.635 | -25.027 | -20.389 | -15.13 | -9.782 | -4.99 | -1.519 | -0.25 |
| 1.819999999999983 | -28.737 | -25.118 | -20.464 | -15.188 | -9.821 | -5.011 | -1.525 | -0.247 |
| 1.824999999999983 | -28.84 | -25.21 | -20.54 | -15.247 | -9.86 | -5.032 | -1.531 | -0.244 |
| 1.829999999999983 | -28.944 | -25.301 | -20.616 | -15.305 | -9.9 | -5.054 | -1.538 | -0.24 |
| 1.834999999999983 | -29.047 | -25.393 | -20.693 | -15.363 | -9.94 | -5.075 | -1.544 | -0.237 |
| 1.839999999999983 | -29.151 | -25.484 | -20.769 | -15.422 | -9.979 | -5.097 | -1.551 | -0.234 |
| 1.844999999999983 | -29.254 | -25.576 | -20.846 | -15.481 | -10.019 | -5.119 | -1.557 | -0.23 |
| 1.849999999999982 | -29.358 | -25.668 | -20.922 | -15.539 | -10.059 | -5.141 | -1.564 | -0.227 |
| 1.854999999999982 | -29.462 | -25.761 | -20.999 | -15.598 | -10.099 | -5.163 | -1.571 | -0.224 |
| 1.859999999999982 | -29.567 | -25.853 | -21.076 | -15.658 | -10.139 | -5.185 | -1.578 | -0.221 |
| 1.864999999999982 | -29.671 | -25.946 | -21.154 | -15.717 | -10.18 | -5.207 | -1.584 | -0.218 |
| 1.869999999999982 | -29.776 | -26.039 | -21.231 | -15.776 | -10.22 | -5.23 | -1.591 | -0.215 |
| 1.874999999999982 | -29.881 | -26.132 | -21.308 | -15.836 | -10.261 | -5.252 | -1.598 | -0.212 |
| 1.879999999999982 | -29.986 | -26.225 | -21.386 | -15.896 | -10.302 | -5.274 | -1.606 | -0.209 |
| 1.884999999999982 | -30.091 | -26.319 | -21.464 | -15.956 | -10.343 | -5.297 | -1.613 | -0.206 |
| 1.889999999999982 | -30.197 | -26.412 | -21.542 | -16.016 | -10.384 | -5.32 | -1.62 | -0.203 |
| 1.894999999999982 | -30.303 | -26.506 | -21.62 | -16.076 | -10.425 | -5.343 | -1.627 | -0.2 |
| 1.899999999999981 | -30.408 | -26.6 | -21.699 | -16.136 | -10.466 | -5.366 | -1.635 | -0.198 |
| 1.904999999999981 | -30.515 | -26.694 | -21.777 | -16.197 | -10.507 | -5.389 | -1.642 | -0.195 |
| 1.909999999999981 | -30.621 | -26.788 | -21.856 | -16.257 | -10.549 | -5.412 | -1.65 | -0.192 |
| 1.914999999999981 | -30.727 | -26.883 | -21.935 | -16.318 | -10.591 | -5.435 | -1.658 | -0.189 |
| 1.919999999999981 | -30.834 | -26.978 | -22.014 | -16.379 | -10.632 | -5.458 | -1.665 | -0.187 |
| 1.924999999999981 | -30.941 | -27.072 | -22.093 | -16.44 | -10.674 | -5.482 | -1.673 | -0.184 |
| 1.929999999999981 | -31.048 | -27.168 | -22.173 | -16.502 | -10.716 | -5.505 | -1.681 | -0.181 |
| 1.934999999999981 | -31.155 | -27.263 | -22.252 | -16.563 | -10.759 | -5.529 | -1.689 | -0.179 |
| 1.939999999999981 | -31.262 | -27.358 | -22.332 | -16.625 | -10.801 | -5.553 | -1.697 | -0.176 |
| 1.94499999999998 | -31.37 | -27.454 | -22.412 | -16.686 | -10.843 | -5.576 | -1.705 | -0.174 |
| 1.94999999999998 | -31.478 | -27.55 | -22.492 | -16.748 | -10.886 | -5.6 | -1.713 | -0.172 |
| 1.95499999999998 | -31.586 | -27.646 | -22.572 | -16.81 | -10.929 | -5.624 | -1.721 | -0.169 |
| 1.95999999999998 | -31.694 | -27.742 | -22.653 | -16.872 | -10.971 | -5.649 | -1.73 | -0.167 |
| 1.96499999999998 | -31.802 | -27.838 | -22.734 | -16.935 | -11.014 | -5.673 | -1.738 | -0.165 |
| 1.96999999999998 | -31.911 | -27.935 | -22.814 | -16.997 | -11.057 | -5.697 | -1.746 | -0.162 |
| 1.97499999999998 | -32.02 | -28.031 | -22.895 | -17.06 | -11.101 | -5.722 | -1.755 | -0.16 |
| 1.97999999999998 | -32.129 | -28.128 | -22.976 | -17.122 | -11.144 | -5.746 | -1.763 | -0.158 |
| 1.98499999999998 | -32.238 | -28.225 | -23.058 | -17.185 | -11.187 | -5.771 | -1.772 | -0.156 |
| 1.98999999999998 | -32.347 | -28.322 | -23.139 | -17.248 | -11.231 | -5.796 | -1.781 | -0.154 |
| 1.994999999999979 | -32.457 | -28.42 | -23.221 | -17.312 | -11.275 | -5.82 | -1.79 | -0.151 |
| 1.999999999999979 | -32.566 | -28.517 | -23.302 | -17.375 | -11.318 | -5.845 | -1.798 | -0.149 |
| 2.004999999999979 | -32.676 | -28.615 | -23.384 | -17.439 | -11.362 | -5.87 | -1.807 | -0.147 |
| 2.009999999999979 | -32.786 | -28.713 | -23.466 | -17.502 | -11.406 | -5.896 | -1.816 | -0.145 |
| 2.014999999999979 | -32.897 | -28.811 | -23.549 | -17.566 | -11.451 | -5.921 | -1.825 | -0.143 |
| 2.019999999999979 | -33.007 | -28.91 | -23.631 | -17.63 | -11.495 | -5.946 | -1.835 | -0.142 |
| 2.02499999999998 | -33.118 | -29.008 | -23.714 | -17.694 | -11.539 | -5.972 | -1.844 | -0.14 |
| 2.029999999999979 | -33.229 | -29.107 | -23.797 | -17.758 | -11.584 | -5.997 | -1.853 | -0.138 |
| 2.034999999999979 | -33.34 | -29.206 | -23.88 | -17.823 | -11.629 | -6.023 | -1.862 | -0.136 |
| 2.039999999999979 | -33.451 | -29.305 | -23.963 | -17.887 | -11.674 | -6.049 | -1.872 | -0.134 |
| 2.044999999999979 | -33.563 | -29.404 | -24.046 | -17.952 | -11.719 | -6.075 | -1.881 | -0.133 |
| 2.049999999999978 | -33.674 | -29.503 | -24.129 | -18.017 | -11.764 | -6.101 | -1.891 | -0.131 |
| 2.054999999999978 | -33.786 | -29.603 | -24.213 | -18.082 | -11.809 | -6.127 | -1.901 | -0.129 |
| 2.059999999999978 | -33.898 | -29.703 | -24.297 | -18.147 | -11.854 | -6.153 | -1.91 | -0.128 |
| 2.064999999999978 | -34.01 | -29.803 | -24.381 | -18.212 | -11.9 | -6.179 | -1.92 | -0.126 |
| 2.069999999999978 | -34.123 | -29.903 | -24.465 | -18.278 | -11.945 | -6.206 | -1.93 | -0.125 |
| 2.074999999999978 | -34.235 | -30.003 | -24.549 | -18.343 | -11.991 | -6.232 | -1.94 | -0.123 |
| 2.079999999999978 | -34.348 | -30.104 | -24.634 | -18.409 | -12.037 | -6.259 | -1.95 | -0.122 |
| 2.084999999999978 | -34.461 | -30.204 | -24.718 | -18.475 | -12.083 | -6.285 | -1.96 | -0.12 |
| 2.089999999999978 | -34.574 | -30.305 | -24.803 | -18.541 | -12.129 | -6.312 | -1.97 | -0.119 |
| 2.094999999999978 | -34.688 | -30.406 | -24.888 | -18.607 | -12.176 | -6.339 | -1.98 | -0.118 |
| 2.099999999999977 | -34.801 | -30.508 | -24.973 | -18.674 | -12.222 | -6.366 | -1.991 | -0.116 |
| 2.104999999999977 | -34.915 | -30.609 | -25.058 | -18.74 | -12.268 | -6.393 | -2.001 | -0.115 |
| 2.109999999999977 | -35.029 | -30.711 | -25.144 | -18.807 | -12.315 | -6.42 | -2.012 | -0.114 |
| 2.114999999999977 | -35.143 | -30.812 | -25.23 | -18.874 | -12.362 | -6.448 | -2.022 | -0.113 |
| 2.119999999999977 | -35.257 | -30.914 | -25.315 | -18.941 | -12.409 | -6.475 | -2.033 | -0.112 |
| 2.124999999999977 | -35.372 | -31.017 | -25.401 | -19.008 | -12.456 | -6.503 | -2.043 | -0.111 |
| 2.129999999999977 | -35.487 | -31.119 | -25.487 | -19.075 | -12.503 | -6.53 | -2.054 | -0.11 |
| 2.134999999999977 | -35.601 | -31.221 | -25.574 | -19.142 | -12.55 | -6.558 | -2.065 | -0.109 |
| 2.139999999999977 | -35.717 | -31.324 | -25.66 | -19.21 | -12.598 | -6.586 | -2.076 | -0.108 |
| 2.144999999999976 | -35.832 | -31.427 | -25.747 | -19.278 | -12.645 | -6.614 | -2.087 | -0.107 |
| 2.149999999999976 | -35.947 | -31.53 | -25.834 | -19.346 | -12.693 | -6.642 | -2.098 | -0.106 |
| 2.154999999999976 | -36.063 | -31.633 | -25.921 | -19.414 | -12.741 | -6.67 | -2.109 | -0.105 |
| 2.159999999999976 | -36.179 | -31.737 | -26.008 | -19.482 | -12.789 | -6.698 | -2.12 | -0.104 |
| 2.164999999999976 | -36.295 | -31.84 | -26.095 | -19.55 | -12.837 | -6.726 | -2.131 | -0.103 |
| 2.169999999999976 | -36.411 | -31.944 | -26.183 | -19.619 | -12.885 | -6.755 | -2.142 | -0.102 |
| 2.174999999999976 | -36.528 | -32.048 | -26.27 | -19.687 | -12.933 | -6.783 | -2.154 | -0.102 |
| 2.179999999999976 | -36.644 | -32.152 | -26.358 | -19.756 | -12.982 | -6.812 | -2.165 | -0.101 |
| 2.184999999999976 | -36.761 | -32.257 | -26.446 | -19.825 | -13.03 | -6.841 | -2.177 | -0.1 |
| 2.189999999999975 | -36.878 | -32.361 | -26.534 | -19.894 | -13.079 | -6.87 | -2.188 | -0.1 |
| 2.194999999999975 | -36.995 | -32.466 | -26.623 | -19.963 | -13.128 | -6.898 | -2.2 | -0.099 |
| 2.199999999999975 | -37.113 | -32.571 | -26.711 | -20.032 | -13.177 | -6.928 | -2.212 | -0.099 |
| 2.204999999999975 | -37.23 | -32.676 | -26.8 | -20.102 | -13.226 | -6.957 | -2.224 | -0.098 |
| 2.209999999999975 | -37.348 | -32.781 | -26.889 | -20.172 | -13.275 | -6.986 | -2.236 | -0.098 |
| 2.214999999999975 | -37.466 | -32.886 | -26.978 | -20.241 | -13.324 | -7.015 | -2.247 | -0.097 |
| 2.219999999999975 | -37.584 | -32.992 | -27.067 | -20.311 | -13.374 | -7.045 | -2.26 | -0.097 |
| 2.224999999999975 | -37.703 | -33.098 | -27.156 | -20.382 | -13.423 | -7.074 | -2.272 | -0.097 |
| 2.229999999999975 | -37.821 | -33.204 | -27.246 | -20.452 | -13.473 | -7.104 | -2.284 | -0.096 |
| 2.234999999999975 | -37.94 | -33.31 | -27.335 | -20.522 | -13.523 | -7.134 | -2.296 | -0.096 |
| 2.239999999999974 | -38.059 | -33.416 | -27.425 | -20.593 | -13.573 | -7.164 | -2.308 | -0.096 |
| 2.244999999999974 | -38.178 | -33.523 | -27.515 | -20.664 | -13.623 | -7.194 | -2.321 | -0.096 |
| 2.249999999999974 | -38.297 | -33.63 | -27.605 | -20.734 | -13.673 | -7.224 | -2.333 | -0.096 |
| 2.254999999999974 | -38.417 | -33.736 | -27.696 | -20.805 | -13.724 | -7.254 | -2.346 | -0.095 |
| 2.259999999999974 | -38.536 | -33.844 | -27.786 | -20.877 | -13.774 | -7.284 | -2.358 | -0.095 |
| 2.264999999999974 | -38.656 | -33.951 | -27.877 | -20.948 | -13.825 | -7.314 | -2.371 | -0.095 |
| 2.269999999999974 | -38.776 | -34.058 | -27.968 | -21.019 | -13.875 | -7.345 | -2.384 | -0.095 |
| 2.274999999999974 | -38.897 | -34.166 | -28.059 | -21.091 | -13.926 | -7.375 | -2.397 | -0.095 |
| 2.279999999999974 | -39.017 | -34.274 | -28.15 | -21.163 | -13.977 | -7.406 | -2.409 | -0.095 |
| 2.284999999999973 | -39.138 | -34.382 | -28.241 | -21.235 | -14.028 | -7.437 | -2.422 | -0.096 |
| 2.289999999999973 | -39.259 | -34.49 | -28.333 | -21.307 | -14.08 | -7.468 | -2.435 | -0.096 |
| 2.294999999999973 | -39.38 | -34.598 | -28.424 | -21.379 | -14.131 | -7.499 | -2.449 | -0.096 |
| 2.299999999999973 | -39.501 | -34.707 | -28.516 | -21.451 | -14.183 | -7.53 | -2.462 | -0.096 |
| 2.304999999999973 | -39.622 | -34.815 | -28.608 | -21.524 | -14.234 | -7.561 | -2.475 | -0.096 |
| 2.309999999999973 | -39.744 | -34.924 | -28.7 | -21.596 | -14.286 | -7.592 | -2.488 | -0.097 |
| 2.314999999999973 | -39.866 | -35.033 | -28.793 | -21.669 | -14.338 | -7.624 | -2.502 | -0.097 |
| 2.319999999999973 | -39.988 | -35.143 | -28.885 | -21.742 | -14.39 | -7.655 | -2.515 | -0.098 |
| 2.324999999999973 | -40.11 | -35.252 | -28.978 | -21.815 | -14.442 | -7.687 | -2.529 | -0.098 |
| 2.329999999999972 | -40.232 | -35.362 | -29.071 | -21.889 | -14.494 | -7.718 | -2.542 | -0.098 |
| 2.334999999999972 | -40.355 | -35.471 | -29.164 | -21.962 | -14.547 | -7.75 | -2.556 | -0.099 |
| 2.339999999999972 | -40.478 | -35.581 | -29.257 | -22.036 | -14.599 | -7.782 | -2.57 | -0.099 |
| 2.344999999999972 | -40.601 | -35.692 | -29.35 | -22.109 | -14.652 | -7.814 | -2.584 | -0.1 |
| 2.349999999999972 | -40.724 | -35.802 | -29.444 | -22.183 | -14.705 | -7.846 | -2.598 | -0.101 |
| 2.354999999999972 | -40.847 | -35.912 | -29.538 | -22.257 | -14.758 | -7.878 | -2.611 | -0.101 |
| 2.359999999999972 | -40.971 | -36.023 | -29.631 | -22.331 | -14.811 | -7.911 | -2.626 | -0.102 |
| 2.364999999999972 | -41.095 | -36.134 | -29.726 | -22.406 | -14.864 | -7.943 | -2.64 | -0.103 |
| 2.369999999999972 | -41.218 | -36.245 | -29.82 | -22.48 | -14.917 | -7.976 | -2.654 | -0.103 |
| 2.374999999999972 | -41.343 | -36.356 | -29.914 | -22.555 | -14.971 | -8.008 | -2.668 | -0.104 |
| 2.379999999999971 | -41.467 | -36.468 | -30.009 | -22.629 | -15.024 | -8.041 | -2.682 | -0.105 |
| 2.384999999999971 | -41.591 | -36.579 | -30.103 | -22.704 | -15.078 | -8.074 | -2.697 | -0.106 |
| 2.389999999999971 | -41.716 | -36.691 | -30.198 | -22.779 | -15.132 | -8.107 | -2.711 | -0.107 |
| 2.394999999999971 | -41.841 | -36.803 | -30.293 | -22.855 | -15.186 | -8.14 | -2.726 | -0.108 |
| 2.399999999999971 | -41.966 | -36.915 | -30.388 | -22.93 | -15.24 | -8.173 | -2.74 | -0.109 |
| 2.404999999999971 | -42.091 | -37.028 | -30.484 | -23.006 | -15.294 | -8.206 | -2.755 | -0.11 |
| 2.409999999999971 | -42.217 | -37.14 | -30.579 | -23.081 | -15.348 | -8.239 | -2.77 | -0.111 |
| 2.414999999999971 | -42.342 | -37.253 | -30.675 | -23.157 | -15.403 | -8.273 | -2.785 | -0.112 |
| 2.419999999999971 | -42.468 | -37.366 | -30.771 | -23.233 | -15.457 | -8.306 | -2.8 | -0.113 |
| 2.42499999999997 | -42.594 | -37.479 | -30.867 | -23.309 | -15.512 | -8.34 | -2.815 | -0.114 |
| 2.42999999999997 | -42.721 | -37.592 | -30.963 | -23.385 | -15.567 | -8.374 | -2.83 | -0.116 |
| 2.43499999999997 | -42.847 | -37.706 | -31.06 | -23.462 | -15.622 | -8.408 | -2.845 | -0.117 |
| 2.43999999999997 | -42.974 | -37.819 | -31.156 | -23.538 | -15.677 | -8.442 | -2.86 | -0.118 |
| 2.44499999999997 | -43.1 | -37.933 | -31.253 | -23.615 | -15.732 | -8.476 | -2.875 | -0.12 |
| 2.44999999999997 | -43.227 | -38.047 | -31.35 | -23.692 | -15.787 | -8.51 | -2.891 | -0.121 |
| 2.45499999999997 | -43.355 | -38.161 | -31.447 | -23.769 | -15.843 | -8.544 | -2.906 | -0.122 |
| 2.45999999999997 | -43.482 | -38.275 | -31.544 | -23.846 | -15.899 | -8.578 | -2.922 | -0.124 |
| 2.46499999999997 | -43.61 | -38.39 | -31.642 | -23.923 | -15.954 | -8.613 | -2.937 | -0.125 |
| 2.46999999999997 | -43.737 | -38.505 | -31.739 | -24.001 | -16.01 | -8.647 | -2.953 | -0.127 |
| 2.474999999999969 | -43.865 | -38.62 | -31.837 | -24.078 | -16.066 | -8.682 | -2.968 | -0.128 |
| 2.479999999999969 | -43.993 | -38.735 | -31.935 | -24.156 | -16.122 | -8.717 | -2.984 | -0.13 |
| 2.484999999999969 | -44.122 | -38.85 | -32.033 | -24.234 | -16.178 | -8.752 | -3 | -0.132 |
| 2.489999999999969 | -44.25 | -38.965 | -32.131 | -24.312 | -16.235 | -8.787 | -3.016 | -0.133 |
| 2.494999999999969 | -44.379 | -39.081 | -32.229 | -24.39 | -16.291 | -8.822 | -3.032 | -0.135 |
| 2.499999999999969 | -44.508 | -39.197 | -32.328 | -24.469 | -16.348 | -8.857 | -3.048 | -0.137 |
| 2.504999999999969 | -44.637 | -39.313 | -32.427 | -24.547 | -16.405 | -8.892 | -3.064 | -0.139 |
| 2.509999999999969 | -44.766 | -39.429 | -32.526 | -24.626 | -16.462 | -8.927 | -3.08 | -0.14 |
| 2.514999999999969 | -44.896 | -39.545 | -32.625 | -24.705 | -16.519 | -8.963 | -3.097 | -0.142 |
| 2.519999999999968 | -45.026 | -39.662 | -32.724 | -24.784 | -16.576 | -8.998 | -3.113 | -0.144 |
| 2.524999999999968 | -45.155 | -39.778 | -32.823 | -24.863 | -16.633 | -9.034 | -3.129 | -0.146 |
| 2.529999999999968 | -45.286 | -39.895 | -32.923 | -24.942 | -16.69 | -9.07 | -3.146 | -0.148 |
| 2.534999999999968 | -45.416 | -40.012 | -33.023 | -25.021 | -16.748 | -9.106 | -3.162 | -0.15 |
| 2.539999999999968 | -45.546 | -40.13 | -33.123 | -25.101 | -16.806 | -9.142 | -3.179 | -0.152 |
| 2.544999999999968 | -45.677 | -40.247 | -33.223 | -25.181 | -16.863 | -9.178 | -3.196 | -0.154 |
| 2.549999999999968 | -45.808 | -40.365 | -33.323 | -25.261 | -16.921 | -9.214 | -3.213 | -0.156 |
| 2.554999999999968 | -45.939 | -40.483 | -33.423 | -25.341 | -16.979 | -9.25 | -3.229 | -0.159 |
| 2.559999999999968 | -46.07 | -40.601 | -33.524 | -25.421 | -17.038 | -9.287 | -3.246 | -0.161 |
| 2.564999999999968 | -46.201 | -40.719 | -33.625 | -25.501 | -17.096 | -9.323 | -3.263 | -0.163 |
| 2.569999999999967 | -46.333 | -40.837 | -33.726 | -25.582 | -17.154 | -9.36 | -3.28 | -0.165 |
| 2.574999999999967 | -46.465 | -40.956 | -33.827 | -25.662 | -17.213 | -9.396 | -3.298 | -0.168 |
| 2.579999999999967 | -46.597 | -41.074 | -33.928 | -25.743 | -17.272 | -9.433 | -3.315 | -0.17 |
| 2.584999999999967 | -46.729 | -41.193 | -34.029 | -25.824 | -17.33 | -9.47 | -3.332 | -0.172 |
| 2.589999999999967 | -46.861 | -41.312 | -34.131 | -25.905 | -17.389 | -9.507 | -3.349 | -0.175 |
| 2.594999999999967 | -46.994 | -41.432 | -34.233 | -25.986 | -17.448 | -9.544 | -3.367 | -0.177 |
| 2.599999999999967 | -47.127 | -41.551 | -34.335 | -26.067 | -17.508 | -9.581 | -3.384 | -0.18 |
| 2.604999999999967 | -47.26 | -41.671 | -34.437 | -26.149 | -17.567 | -9.619 | -3.402 | -0.182 |
| 2.609999999999966 | -47.393 | -41.79 | -34.539 | -26.231 | -17.626 | -9.656 | -3.42 | -0.185 |
| 2.614999999999966 | -47.526 | -41.91 | -34.642 | -26.312 | -17.686 | -9.694 | -3.437 | -0.188 |
| 2.619999999999966 | -47.66 | -42.031 | -34.744 | -26.394 | -17.746 | -9.731 | -3.455 | -0.19 |
| 2.624999999999966 | -47.793 | -42.151 | -34.847 | -26.477 | -17.805 | -9.769 | -3.473 | -0.193 |
| 2.629999999999966 | -47.927 | -42.271 | -34.95 | -26.559 | -17.865 | -9.807 | -3.491 | -0.196 |
| 2.634999999999966 | -48.061 | -42.392 | -35.053 | -26.641 | -17.925 | -9.845 | -3.509 | -0.198 |
| 2.639999999999966 | -48.196 | -42.513 | -35.156 | -26.724 | -17.986 | -9.883 | -3.527 | -0.201 |
| 2.644999999999966 | -48.33 | -42.634 | -35.26 | -26.807 | -18.046 | -9.921 | -3.545 | -0.204 |
| 2.649999999999966 | -48.465 | -42.755 | -35.363 | -26.889 | -18.106 | -9.959 | -3.563 | -0.207 |
| 2.654999999999966 | -48.6 | -42.877 | -35.467 | -26.972 | -18.167 | -9.997 | -3.582 | -0.21 |
| 2.659999999999965 | -48.735 | -42.999 | -35.571 | -27.056 | -18.228 | -10.036 | -3.6 | -0.213 |
| 2.664999999999965 | -48.87 | -43.12 | -35.675 | -27.139 | -18.289 | -10.074 | -3.618 | -0.216 |
| 2.669999999999965 | -49.006 | -43.242 | -35.779 | -27.222 | -18.35 | -10.113 | -3.637 | -0.219 |
| 2.674999999999965 | -49.141 | -43.364 | -35.884 | -27.306 | -18.411 | -10.152 | -3.655 | -0.222 |
| 2.679999999999965 | -49.277 | -43.487 | -35.988 | -27.39 | -18.472 | -10.191 | -3.674 | -0.225 |
| 2.684999999999965 | -49.413 | -43.609 | -36.093 | -27.474 | -18.533 | -10.229 | -3.693 | -0.228 |
| 2.689999999999965 | -49.549 | -43.732 | -36.198 | -27.558 | -18.595 | -10.269 | -3.712 | -0.232 |
| 2.694999999999965 | -49.686 | -43.855 | -36.303 | -27.642 | -18.656 | -10.308 | -3.73 | -0.235 |
| 2.699999999999965 | -49.822 | -43.978 | -36.409 | -27.726 | -18.718 | -10.347 | -3.749 | -0.238 |
| 2.704999999999964 | -49.959 | -44.101 | -36.514 | -27.811 | -18.78 | -10.386 | -3.768 | -0.241 |
| 2.709999999999964 | -50.096 | -44.225 | -36.62 | -27.895 | -18.842 | -10.426 | -3.788 | -0.245 |
| 2.714999999999964 | -50.233 | -44.348 | -36.726 | -27.98 | -18.904 | -10.465 | -3.807 | -0.248 |
| 2.719999999999964 | -50.371 | -44.472 | -36.831 | -28.065 | -18.967 | -10.505 | -3.826 | -0.252 |
| 2.724999999999964 | -50.508 | -44.596 | -36.938 | -28.15 | -19.029 | -10.545 | -3.845 | -0.255 |
| 2.729999999999964 | -50.646 | -44.72 | -37.044 | -28.236 | -19.091 | -10.584 | -3.865 | -0.259 |
| 2.734999999999964 | -50.784 | -44.845 | -37.15 | -28.321 | -19.154 | -10.624 | -3.884 | -0.262 |
| 2.739999999999964 | -50.922 | -44.969 | -37.257 | -28.407 | -19.217 | -10.665 | -3.904 | -0.266 |
| 2.744999999999964 | -51.06 | -45.094 | -37.364 | -28.492 | -19.28 | -10.705 | -3.923 | -0.269 |
| 2.749999999999964 | -51.199 | -45.219 | -37.471 | -28.578 | -19.343 | -10.745 | -3.943 | -0.273 |
| 2.754999999999963 | -51.338 | -45.344 | -37.578 | -28.664 | -19.406 | -10.785 | -3.963 | -0.277 |
| 2.759999999999963 | -51.476 | -45.469 | -37.685 | -28.75 | -19.469 | -10.826 | -3.982 | -0.28 |
| 2.764999999999963 | -51.616 | -45.595 | -37.793 | -28.837 | -19.533 | -10.866 | -4.002 | -0.284 |
| 2.769999999999963 | -51.755 | -45.72 | -37.9 | -28.923 | -19.596 | -10.907 | -4.022 | -0.288 |
| 2.774999999999963 | -51.894 | -45.846 | -38.008 | -29.01 | -19.66 | -10.948 | -4.042 | -0.292 |
| 2.779999999999963 | -52.034 | -45.972 | -38.116 | -29.096 | -19.724 | -10.989 | -4.062 | -0.296 |
| 2.784999999999963 | -52.174 | -46.098 | -38.224 | -29.183 | -19.788 | -11.03 | -4.082 | -0.3 |
| 2.789999999999963 | -52.314 | -46.225 | -38.333 | -29.27 | -19.852 | -11.071 | -4.103 | -0.304 |
| 2.794999999999963 | -52.454 | -46.351 | -38.441 | -29.358 | -19.916 | -11.112 | -4.123 | -0.308 |
| 2.799999999999962 | -52.595 | -46.478 | -38.55 | -29.445 | -19.98 | -11.153 | -4.143 | -0.312 |
| 2.804999999999962 | -52.735 | -46.605 | -38.659 | -29.533 | -20.045 | -11.195 | -4.164 | -0.316 |
| 2.809999999999962 | -52.876 | -46.732 | -38.768 | -29.62 | -20.109 | -11.236 | -4.184 | -0.32 |
| 2.814999999999962 | -53.017 | -46.859 | -38.877 | -29.708 | -20.174 | -11.278 | -4.205 | -0.324 |
| 2.819999999999962 | -53.158 | -46.987 | -38.986 | -29.796 | -20.239 | -11.319 | -4.226 | -0.328 |
| 2.824999999999962 | -53.3 | -47.114 | -39.096 | -29.884 | -20.304 | -11.361 | -4.246 | -0.332 |
| 2.829999999999962 | -53.441 | -47.242 | -39.205 | -29.972 | -20.369 | -11.403 | -4.267 | -0.337 |
| 2.834999999999962 | -53.583 | -47.37 | -39.315 | -30.061 | -20.434 | -11.445 | -4.288 | -0.341 |
| 2.839999999999962 | -53.725 | -47.498 | -39.425 | -30.149 | -20.499 | -11.487 | -4.309 | -0.345 |
| 2.844999999999962 | -53.867 | -47.627 | -39.535 | -30.238 | -20.565 | -11.529 | -4.33 | -0.35 |
| 2.849999999999961 | -54.01 | -47.755 | -39.646 | -30.327 | -20.63 | -11.572 | -4.351 | -0.354 |
| 2.854999999999961 | -54.152 | -47.884 | -39.756 | -30.416 | -20.696 | -11.614 | -4.372 | -0.358 |
| 2.859999999999961 | -54.295 | -48.013 | -39.867 | -30.505 | -20.762 | -11.657 | -4.394 | -0.363 |
| 2.864999999999961 | -54.438 | -48.142 | -39.978 | -30.594 | -20.828 | -11.699 | -4.415 | -0.367 |
| 2.869999999999961 | -54.581 | -48.271 | -40.089 | -30.684 | -20.894 | -11.742 | -4.436 | -0.372 |
| 2.874999999999961 | -54.724 | -48.401 | -40.2 | -30.773 | -20.96 | -11.785 | -4.458 | -0.377 |
| 2.879999999999961 | -54.868 | -48.53 | -40.311 | -30.863 | -21.027 | -11.828 | -4.479 | -0.381 |
| 2.884999999999961 | -55.011 | -48.66 | -40.423 | -30.953 | -21.093 | -11.871 | -4.501 | -0.386 |
| 2.889999999999961 | -55.155 | -48.79 | -40.534 | -31.043 | -21.16 | -11.914 | -4.523 | -0.391 |
| 2.89499999999996 | -55.299 | -48.92 | -40.646 | -31.133 | -21.226 | -11.957 | -4.544 | -0.395 |
| 2.89999999999996 | -55.444 | -49.051 | -40.758 | -31.224 | -21.293 | -12 | -4.566 | -0.4 |
| 2.90499999999996 | -55.588 | -49.181 | -40.87 | -31.314 | -21.36 | -12.044 | -4.588 | -0.405 |
| 2.90999999999996 | -55.733 | -49.312 | -40.983 | -31.405 | -21.427 | -12.087 | -4.61 | -0.41 |
| 2.91499999999996 | -55.878 | -49.443 | -41.095 | -31.496 | -21.495 | -12.131 | -4.632 | -0.415 |
| 2.91999999999996 | -56.023 | -49.574 | -41.208 | -31.587 | -21.562 | -12.175 | -4.654 | -0.42 |
| 2.92499999999996 | -56.168 | -49.705 | -41.321 | -31.678 | -21.63 | -12.218 | -4.676 | -0.425 |
| 2.92999999999996 | -56.313 | -49.837 | -41.434 | -31.769 | -21.697 | -12.262 | -4.699 | -0.43 |
| 2.93499999999996 | -56.459 | -49.968 | -41.547 | -31.86 | -21.765 | -12.306 | -4.721 | -0.435 |
| 2.93999999999996 | -56.605 | -50.1 | -41.66 | -31.952 | -21.833 | -12.35 | -4.743 | -0.44 |
| 2.944999999999959 | -56.751 | -50.232 | -41.774 | -32.044 | -21.901 | -12.395 | -4.766 | -0.445 |
| 2.949999999999959 | -56.897 | -50.364 | -41.887 | -32.136 | -21.969 | -12.439 | -4.788 | -0.45 |
| 2.954999999999959 | -57.043 | -50.497 | -42.001 | -32.228 | -22.037 | -12.484 | -4.811 | -0.455 |
| 2.959999999999959 | -57.19 | -50.629 | -42.115 | -32.32 | -22.106 | -12.528 | -4.834 | -0.461 |
| 2.964999999999959 | -57.337 | -50.762 | -42.23 | -32.412 | -22.174 | -12.573 | -4.856 | -0.466 |
| 2.969999999999959 | -57.484 | -50.895 | -42.344 | -32.505 | -22.243 | -12.617 | -4.879 | -0.471 |
| 2.974999999999959 | -57.631 | -51.028 | -42.458 | -32.597 | -22.312 | -12.662 | -4.902 | -0.477 |
| 2.979999999999959 | -57.778 | -51.161 | -42.573 | -32.69 | -22.381 | -12.707 | -4.925 | -0.482 |
| 2.984999999999959 | -57.926 | -51.295 | -42.688 | -32.783 | -22.45 | -12.752 | -4.948 | -0.488 |
| 2.989999999999958 | -58.074 | -51.428 | -42.803 | -32.876 | -22.519 | -12.797 | -4.971 | -0.493 |
| 2.994999999999958 | -58.221 | -51.562 | -42.918 | -32.969 | -22.588 | -12.843 | -4.994 | -0.499 |
| 2.999999999999958 | -58.37 | -51.696 | -43.034 | -33.062 | -22.658 | -12.888 | -5.018 | -0.504 |
| 3.004999999999958 | -58.518 | -51.83 | -43.149 | -33.156 | -22.727 | -12.934 | -5.041 | -0.51 |
| 3.009999999999958 | -58.666 | -51.965 | -43.265 | -33.25 | -22.797 | -12.979 | -5.064 | -0.515 |
| 3.014999999999958 | -58.815 | -52.099 | -43.381 | -33.343 | -22.867 | -13.025 | -5.088 | -0.521 |
| 3.019999999999958 | -58.964 | -52.234 | -43.497 | -33.437 | -22.937 | -13.071 | -5.111 | -0.527 |
| 3.024999999999958 | -59.113 | -52.369 | -43.613 | -33.532 | -23.007 | -13.116 | -5.135 | -0.532 |
| 3.029999999999958 | -59.262 | -52.504 | -43.729 | -33.626 | -23.077 | -13.162 | -5.159 | -0.538 |
| 3.034999999999958 | -59.412 | -52.639 | -43.846 | -33.72 | -23.147 | -13.208 | -5.182 | -0.544 |
| 3.039999999999957 | -59.561 | -52.775 | -43.963 | -33.815 | -23.218 | -13.255 | -5.206 | -0.55 |
| 3.044999999999957 | -59.711 | -52.91 | -44.08 | -33.91 | -23.288 | -13.301 | -5.23 | -0.556 |
| 3.049999999999957 | -59.861 | -53.046 | -44.197 | -34.004 | -23.359 | -13.347 | -5.254 | -0.562 |
| 3.054999999999957 | -60.012 | -53.182 | -44.314 | -34.099 | -23.43 | -13.394 | -5.278 | -0.568 |
| 3.059999999999957 | -60.162 | -53.318 | -44.431 | -34.195 | -23.501 | -13.44 | -5.302 | -0.574 |
| 3.064999999999957 | -60.313 | -53.455 | -44.549 | -34.29 | -23.572 | -13.487 | -5.327 | -0.58 |
| 3.069999999999957 | -60.463 | -53.591 | -44.666 | -34.385 | -23.643 | -13.534 | -5.351 | -0.586 |
| 3.074999999999957 | -60.614 | -53.728 | -44.784 | -34.481 | -23.714 | -13.581 | -5.375 | -0.592 |
| 3.079999999999957 | -60.766 | -53.865 | -44.902 | -34.577 | -23.786 | -13.628 | -5.4 | -0.598 |
| 3.084999999999956 | -60.917 | -54.002 | -45.021 | -34.673 | -23.858 | -13.675 | -5.424 | -0.604 |
| 3.089999999999956 | -61.069 | -54.139 | -45.139 | -34.769 | -23.929 | -13.722 | -5.449 | -0.611 |
| 3.094999999999956 | -61.22 | -54.277 | -45.258 | -34.865 | -24.001 | -13.769 | -5.473 | -0.617 |
| 3.099999999999956 | -61.372 | -54.414 | -45.376 | -34.961 | -24.073 | -13.817 | -5.498 | -0.623 |
| 3.104999999999956 | -61.524 | -54.552 | -45.495 | -35.058 | -24.145 | -13.864 | -5.523 | -0.63 |
| 3.109999999999956 | -61.677 | -54.69 | -45.614 | -35.154 | -24.217 | -13.912 | -5.548 | -0.636 |
| 3.114999999999956 | -61.829 | -54.828 | -45.734 | -35.251 | -24.29 | -13.96 | -5.572 | -0.642 |
| 3.119999999999956 | -61.982 | -54.967 | -45.853 | -35.348 | -24.362 | -14.007 | -5.597 | -0.649 |
| 3.124999999999956 | -62.135 | -55.105 | -45.972 | -35.445 | -24.435 | -14.055 | -5.622 | -0.655 |
| 3.129999999999955 | -62.288 | -55.244 | -46.092 | -35.543 | -24.508 | -14.103 | -5.648 | -0.662 |
| 3.134999999999955 | -62.441 | -55.383 | -46.212 | -35.64 | -24.581 | -14.151 | -5.673 | -0.668 |
| 3.139999999999955 | -62.595 | -55.522 | -46.332 | -35.738 | -24.654 | -14.2 | -5.698 | -0.675 |
| 3.144999999999955 | -62.749 | -55.661 | -46.452 | -35.835 | -24.727 | -14.248 | -5.723 | -0.682 |
| 3.149999999999955 | -62.902 | -55.801 | -46.573 | -35.933 | -24.8 | -14.296 | -5.749 | -0.688 |
| 3.154999999999955 | -63.057 | -55.94 | -46.693 | -36.031 | -24.873 | -14.345 | -5.774 | -0.695 |
| 3.159999999999955 | -63.211 | -56.08 | -46.814 | -36.129 | -24.947 | -14.394 | -5.8 | -0.702 |
| 3.164999999999955 | -63.365 | -56.22 | -46.935 | -36.228 | -25.021 | -14.442 | -5.826 | -0.709 |
| 3.169999999999955 | -63.52 | -56.36 | -47.056 | -36.326 | -25.094 | -14.491 | -5.851 | -0.716 |
| 3.174999999999955 | -63.675 | -56.501 | -47.177 | -36.425 | -25.168 | -14.54 | -5.877 | -0.722 |
| 3.179999999999954 | -63.83 | -56.641 | -47.299 | -36.523 | -25.242 | -14.589 | -5.903 | -0.729 |
| 3.184999999999954 | -63.985 | -56.782 | -47.42 | -36.622 | -25.317 | -14.638 | -5.929 | -0.736 |
| 3.189999999999954 | -64.14 | -56.923 | -47.542 | -36.721 | -25.391 | -14.687 | -5.955 | -0.743 |
| 3.194999999999954 | -64.296 | -57.064 | -47.664 | -36.821 | -25.465 | -14.737 | -5.981 | -0.75 |
| 3.199999999999954 | -64.452 | -57.205 | -47.786 | -36.92 | -25.54 | -14.786 | -6.007 | -0.757 |
| 3.204999999999954 | -64.608 | -57.347 | -47.908 | -37.02 | -25.615 | -14.836 | -6.033 | -0.765 |
| 3.209999999999954 | -64.764 | -57.489 | -48.031 | -37.119 | -25.689 | -14.885 | -6.06 | -0.772 |
| 3.214999999999954 | -64.92 | -57.63 | -48.154 | -37.219 | -25.764 | -14.935 | -6.086 | -0.779 |
| 3.219999999999954 | -65.077 | -57.772 | -48.276 | -37.319 | -25.839 | -14.985 | -6.112 | -0.786 |
| 3.224999999999953 | -65.234 | -57.915 | -48.399 | -37.419 | -25.915 | -15.035 | -6.139 | -0.793 |
| 3.229999999999953 | -65.391 | -58.057 | -48.522 | -37.519 | -25.99 | -15.085 | -6.165 | -0.801 |
| 3.234999999999953 | -65.548 | -58.2 | -48.646 | -37.62 | -26.065 | -15.135 | -6.192 | -0.808 |
| 3.239999999999953 | -65.705 | -58.342 | -48.769 | -37.72 | -26.141 | -15.185 | -6.219 | -0.815 |
| 3.244999999999953 | -65.863 | -58.485 | -48.893 | -37.821 | -26.217 | -15.236 | -6.246 | -0.823 |
| 3.249999999999953 | -66.02 | -58.628 | -49.016 | -37.922 | -26.292 | -15.286 | -6.272 | -0.83 |
| 3.254999999999953 | -66.178 | -58.772 | -49.14 | -38.023 | -26.368 | -15.337 | -6.299 | -0.838 |
| 3.259999999999953 | -66.336 | -58.915 | -49.264 | -38.124 | -26.444 | -15.388 | -6.326 | -0.845 |
| 3.264999999999952 | -66.495 | -59.059 | -49.389 | -38.225 | -26.521 | -15.438 | -6.353 | -0.853 |
| 3.269999999999952 | -66.653 | -59.203 | -49.513 | -38.327 | -26.597 | -15.489 | -6.381 | -0.86 |
| 3.274999999999952 | -66.812 | -59.347 | -49.638 | -38.428 | -26.673 | -15.54 | -6.408 | -0.868 |
| 3.279999999999952 | -66.971 | -59.491 | -49.763 | -38.53 | -26.75 | -15.591 | -6.435 | -0.876 |
| 3.284999999999952 | -67.13 | -59.635 | -49.888 | -38.632 | -26.827 | -15.642 | -6.462 | -0.884 |
| 3.289999999999952 | -67.289 | -59.78 | -50.013 | -38.734 | -26.904 | -15.694 | -6.49 | -0.891 |
| 3.294999999999952 | -67.449 | -59.924 | -50.138 | -38.836 | -26.981 | -15.745 | -6.517 | -0.899 |
| 3.299999999999952 | -67.608 | -60.069 | -50.263 | -38.939 | -27.058 | -15.797 | -6.545 | -0.907 |
| 3.304999999999952 | -67.768 | -60.214 | -50.389 | -39.041 | -27.135 | -15.848 | -6.573 | -0.915 |
| 3.309999999999952 | -67.928 | -60.36 | -50.515 | -39.144 | -27.212 | -15.9 | -6.6 | -0.923 |
| 3.314999999999951 | -68.088 | -60.505 | -50.641 | -39.247 | -27.29 | -15.952 | -6.628 | -0.931 |
| 3.319999999999951 | -68.249 | -60.651 | -50.767 | -39.35 | -27.367 | -16.003 | -6.656 | -0.939 |
| 3.324999999999951 | -68.409 | -60.797 | -50.893 | -39.453 | -27.445 | -16.055 | -6.684 | -0.947 |
| 3.329999999999951 | -68.57 | -60.943 | -51.02 | -39.556 | -27.523 | -16.108 | -6.712 | -0.955 |
| 3.334999999999951 | -68.731 | -61.089 | -51.146 | -39.659 | -27.601 | -16.16 | -6.74 | -0.963 |
| 3.339999999999951 | -68.892 | -61.235 | -51.273 | -39.763 | -27.679 | -16.212 | -6.768 | -0.971 |
| 3.344999999999951 | -69.054 | -61.382 | -51.4 | -39.867 | -27.758 | -16.264 | -6.796 | -0.979 |
| 3.349999999999951 | -69.215 | -61.529 | -51.527 | -39.971 | -27.836 | -16.317 | -6.825 | -0.987 |
| 3.354999999999951 | -69.377 | -61.675 | -51.654 | -40.075 | -27.914 | -16.37 | -6.853 | -0.996 |
| 3.359999999999951 | -69.539 | -61.823 | -51.782 | -40.179 | -27.993 | -16.422 | -6.882 | -1.004 |
| 3.36499999999995 | -69.701 | -61.97 | -51.91 | -40.283 | -28.072 | -16.475 | -6.91 | -1.012 |
| 3.36999999999995 | -69.863 | -62.117 | -52.037 | -40.388 | -28.151 | -16.528 | -6.939 | -1.021 |
| 3.37499999999995 | -70.026 | -62.265 | -52.165 | -40.492 | -28.23 | -16.581 | -6.967 | -1.029 |
| 3.37999999999995 | -70.189 | -62.413 | -52.293 | -40.597 | -28.309 | -16.634 | -6.996 | -1.037 |
| 3.38499999999995 | -70.351 | -62.561 | -52.422 | -40.702 | -28.388 | -16.687 | -7.025 | -1.046 |
| 3.38999999999995 | -70.515 | -62.709 | -52.55 | -40.807 | -28.468 | -16.741 | -7.054 | -1.054 |
| 3.39499999999995 | -70.678 | -62.857 | -52.679 | -40.912 | -28.547 | -16.794 | -7.083 | -1.063 |
| 3.39999999999995 | -70.841 | -63.006 | -52.808 | -41.017 | -28.627 | -16.848 | -7.112 | -1.072 |
| 3.40499999999995 | -71.005 | -63.155 | -52.937 | -41.123 | -28.707 | -16.901 | -7.141 | -1.08 |
| 3.409999999999949 | -71.169 | -63.304 | -53.066 | -41.229 | -28.787 | -16.955 | -7.17 | -1.089 |
| 3.414999999999949 | -71.333 | -63.453 | -53.195 | -41.334 | -28.867 | -17.009 | -7.199 | -1.098 |
| 3.419999999999949 | -71.497 | -63.602 | -53.325 | -41.44 | -28.947 | -17.063 | -7.228 | -1.106 |
| 3.424999999999949 | -71.662 | -63.752 | -53.454 | -41.547 | -29.027 | -17.117 | -7.258 | -1.115 |
| 3.429999999999949 | -71.826 | -63.901 | -53.584 | -41.653 | -29.108 | -17.171 | -7.287 | -1.124 |
| 3.434999999999949 | -71.991 | -64.051 | -53.714 | -41.759 | -29.188 | -17.225 | -7.317 | -1.133 |
| 3.439999999999949 | -72.156 | -64.201 | -53.844 | -41.866 | -29.269 | -17.279 | -7.346 | -1.142 |
| 3.444999999999949 | -72.321 | -64.351 | -53.975 | -41.973 | -29.35 | -17.334 | -7.376 | -1.151 |
| 3.449999999999949 | -72.487 | -64.502 | -54.105 | -42.079 | -29.431 | -17.388 | -7.406 | -1.16 |
| 3.454999999999949 | -72.652 | -64.652 | -54.236 | -42.186 | -29.512 | -17.443 | -7.436 | -1.169 |
| 3.459999999999948 | -72.818 | -64.803 | -54.367 | -42.294 | -29.593 | -17.498 | -7.466 | -1.178 |
| 3.464999999999948 | -72.984 | -64.954 | -54.498 | -42.401 | -29.674 | -17.553 | -7.495 | -1.187 |
| 3.469999999999948 | -73.15 | -65.105 | -54.629 | -42.508 | -29.756 | -17.608 | -7.526 | -1.196 |
| 3.474999999999948 | -73.317 | -65.256 | -54.76 | -42.616 | -29.837 | -17.663 | -7.556 | -1.205 |
| 3.479999999999948 | -73.483 | -65.408 | -54.892 | -42.724 | -29.919 | -17.718 | -7.586 | -1.214 |
| 3.484999999999948 | -73.65 | -65.559 | -55.023 | -42.832 | -30.001 | -17.773 | -7.616 | -1.224 |
| 3.489999999999948 | -73.817 | -65.711 | -55.155 | -42.94 | -30.083 | -17.828 | -7.646 | -1.233 |
| 3.494999999999948 | -73.984 | -65.863 | -55.287 | -43.048 | -30.165 | -17.884 | -7.677 | -1.242 |
| 3.499999999999948 | -74.151 | -66.015 | -55.419 | -43.156 | -30.247 | -17.939 | -7.707 | -1.251 |
| 3.504999999999947 | -74.319 | -66.168 | -55.552 | -43.265 | -30.33 | -17.995 | -7.738 | -1.261 |
| 3.509999999999947 | -74.486 | -66.32 | -55.684 | -43.373 | -30.412 | -18.051 | -7.768 | -1.27 |
| 3.514999999999947 | -74.654 | -66.473 | -55.817 | -43.482 | -30.495 | -18.107 | -7.799 | -1.28 |
| 3.519999999999947 | -74.822 | -66.626 | -55.95 | -43.591 | -30.577 | -18.163 | -7.83 | -1.289 |
| 3.524999999999947 | -74.991 | -66.779 | -56.083 | -43.7 | -30.66 | -18.219 | -7.861 | -1.299 |
| 3.529999999999947 | -75.159 | -66.932 | -56.216 | -43.81 | -30.743 | -18.275 | -7.891 | -1.308 |
| 3.534999999999947 | -75.328 | -67.086 | -56.349 | -43.919 | -30.826 | -18.331 | -7.922 | -1.318 |
| 3.539999999999947 | -75.497 | -67.24 | -56.483 | -44.029 | -30.91 | -18.388 | -7.953 | -1.328 |
| 3.544999999999947 | -75.666 | -67.393 | -56.616 | -44.138 | -30.993 | -18.444 | -7.985 | -1.337 |
| 3.549999999999947 | -75.835 | -67.547 | -56.75 | -44.248 | -31.077 | -18.501 | -8.016 | -1.347 |
| 3.554999999999946 | -76.004 | -67.702 | -56.884 | -44.358 | -31.16 | -18.557 | -8.047 | -1.357 |
| 3.559999999999946 | -76.174 | -67.856 | -57.018 | -44.468 | -31.244 | -18.614 | -8.078 | -1.367 |
| 3.564999999999946 | -76.344 | -68.011 | -57.153 | -44.579 | -31.328 | -18.671 | -8.11 | -1.377 |
| 3.569999999999946 | -76.514 | -68.165 | -57.287 | -44.689 | -31.412 | -18.728 | -8.141 | -1.386 |
| 3.574999999999946 | -76.684 | -68.32 | -57.422 | -44.8 | -31.496 | -18.785 | -8.173 | -1.396 |
| 3.579999999999946 | -76.854 | -68.475 | -57.557 | -44.91 | -31.58 | -18.842 | -8.204 | -1.406 |
| 3.584999999999946 | -77.025 | -68.631 | -57.692 | -45.021 | -31.665 | -18.9 | -8.236 | -1.416 |
| 3.589999999999946 | -77.196 | -68.786 | -57.827 | -45.132 | -31.749 | -18.957 | -8.268 | -1.426 |
| 3.594999999999946 | -77.367 | -68.942 | -57.962 | -45.244 | -31.834 | -19.015 | -8.3 | -1.436 |
| 3.599999999999945 | -77.538 | -69.098 | -58.098 | -45.355 | -31.919 | -19.072 | -8.332 | -1.447 |
| 3.604999999999945 | -77.709 | -69.254 | -58.234 | -45.467 | -32.004 | -19.13 | -8.363 | -1.457 |
| 3.609999999999945 | -77.881 | -69.41 | -58.369 | -45.578 | -32.089 | -19.188 | -8.396 | -1.467 |
| 3.614999999999945 | -78.053 | -69.566 | -58.506 | -45.69 | -32.174 | -19.246 | -8.428 | -1.477 |
| 3.619999999999945 | -78.224 | -69.723 | -58.642 | -45.802 | -32.259 | -19.304 | -8.46 | -1.487 |
| 3.624999999999945 | -78.397 | -69.88 | -58.778 | -45.914 | -32.345 | -19.362 | -8.492 | -1.498 |
| 3.629999999999945 | -78.569 | -70.037 | -58.915 | -46.026 | -32.43 | -19.42 | -8.524 | -1.508 |
| 3.634999999999945 | -78.741 | -70.194 | -59.051 | -46.139 | -32.516 | -19.478 | -8.557 | -1.518 |
| 3.639999999999945 | -78.914 | -70.351 | -59.188 | -46.251 | -32.602 | -19.537 | -8.589 | -1.529 |
| 3.644999999999944 | -79.087 | -70.508 | -59.325 | -46.364 | -32.688 | -19.595 | -8.622 | -1.539 |
| 3.649999999999944 | -79.26 | -70.666 | -59.462 | -46.477 | -32.774 | -19.654 | -8.654 | -1.55 |
| 3.654999999999944 | -79.433 | -70.824 | -59.6 | -46.59 | -32.86 | -19.712 | -8.687 | -1.56 |
| 3.659999999999944 | -79.607 | -70.982 | -59.737 | -46.703 | -32.946 | -19.771 | -8.72 | -1.571 |
| 3.664999999999944 | -79.78 | -71.14 | -59.875 | -46.816 | -33.033 | -19.83 | -8.753 | -1.581 |
| 3.669999999999944 | -79.954 | -71.299 | -60.013 | -46.93 | -33.119 | -19.889 | -8.786 | -1.592 |
| 3.674999999999944 | -80.128 | -71.457 | -60.151 | -47.043 | -33.206 | -19.948 | -8.819 | -1.603 |
| 3.679999999999944 | -80.303 | -71.616 | -60.289 | -47.157 | -33.293 | -20.008 | -8.852 | -1.614 |
| 3.684999999999944 | -80.477 | -71.775 | -60.428 | -47.271 | -33.38 | -20.067 | -8.885 | -1.624 |
| 3.689999999999943 | -80.652 | -71.934 | -60.566 | -47.385 | -33.467 | -20.126 | -8.918 | -1.635 |
| 3.694999999999943 | -80.826 | -72.093 | -60.705 | -47.499 | -33.554 | -20.186 | -8.951 | -1.646 |
| 3.699999999999943 | -81.001 | -72.253 | -60.844 | -47.614 | -33.641 | -20.246 | -8.985 | -1.657 |
| 3.704999999999943 | -81.177 | -72.412 | -60.983 | -47.728 | -33.729 | -20.305 | -9.018 | -1.668 |
| 3.709999999999943 | -81.352 | -72.572 | -61.122 | -47.843 | -33.817 | -20.365 | -9.052 | -1.679 |
| 3.714999999999943 | -81.528 | -72.732 | -61.262 | -47.958 | -33.904 | -20.425 | -9.085 | -1.69 |
| 3.719999999999943 | -81.703 | -72.893 | -61.401 | -48.073 | -33.992 | -20.485 | -9.119 | -1.701 |
| 3.724999999999943 | -81.879 | -73.053 | -61.541 | -48.188 | -34.08 | -20.545 | -9.152 | -1.712 |
| 3.729999999999943 | -82.055 | -73.214 | -61.681 | -48.303 | -34.168 | -20.606 | -9.186 | -1.723 |
| 3.734999999999943 | -82.232 | -73.374 | -61.821 | -48.418 | -34.256 | -20.666 | -9.22 | -1.734 |
| 3.739999999999942 | -82.408 | -73.535 | -61.961 | -48.534 | -34.345 | -20.726 | -9.254 | -1.745 |
| 3.744999999999942 | -82.585 | -73.696 | -62.101 | -48.65 | -34.433 | -20.787 | -9.288 | -1.756 |
| 3.749999999999942 | -82.762 | -73.858 | -62.242 | -48.766 | -34.522 | -20.848 | -9.322 | -1.768 |
| 3.754999999999942 | -82.939 | -74.019 | -62.383 | -48.882 | -34.611 | -20.908 | -9.356 | -1.779 |
| 3.759999999999942 | -83.116 | -74.181 | -62.524 | -48.998 | -34.7 | -20.969 | -9.39 | -1.79 |
| 3.764999999999942 | -83.294 | -74.343 | -62.665 | -49.114 | -34.789 | -21.03 | -9.425 | -1.802 |
| 3.769999999999942 | -83.472 | -74.505 | -62.806 | -49.231 | -34.878 | -21.091 | -9.459 | -1.813 |
| 3.774999999999942 | -83.649 | -74.667 | -62.947 | -49.347 | -34.967 | -21.152 | -9.493 | -1.824 |
| 3.779999999999942 | -83.828 | -74.829 | -63.089 | -49.464 | -35.056 | -21.214 | -9.528 | -1.836 |
| 3.784999999999941 | -84.006 | -74.992 | -63.231 | -49.581 | -35.146 | -21.275 | -9.562 | -1.847 |
| 3.789999999999941 | -84.184 | -75.155 | -63.373 | -49.698 | -35.236 | -21.337 | -9.597 | -1.859 |
| 3.794999999999941 | -84.363 | -75.318 | -63.515 | -49.815 | -35.325 | -21.398 | -9.632 | -1.871 |
| 3.799999999999941 | -84.542 | -75.481 | -63.657 | -49.932 | -35.415 | -21.46 | -9.667 | -1.882 |
| 3.804999999999941 | -84.721 | -75.644 | -63.799 | -50.05 | -35.505 | -21.522 | -9.701 | -1.894 |
| 3.809999999999941 | -84.9 | -75.807 | -63.942 | -50.168 | -35.596 | -21.584 | -9.736 | -1.906 |
| 3.814999999999941 | -85.079 | -75.971 | -64.085 | -50.285 | -35.686 | -21.646 | -9.771 | -1.917 |
| 3.819999999999941 | -85.259 | -76.135 | -64.228 | -50.403 | -35.776 | -21.708 | -9.806 | -1.929 |
| 3.824999999999941 | -85.439 | -76.299 | -64.371 | -50.522 | -35.867 | -21.77 | -9.842 | -1.941 |
| 3.829999999999941 | -85.619 | -76.463 | -64.514 | -50.64 | -35.958 | -21.832 | -9.877 | -1.953 |
| 3.83499999999994 | -85.799 | -76.628 | -64.657 | -50.758 | -36.048 | -21.894 | -9.912 | -1.965 |
| 3.83999999999994 | -85.979 | -76.792 | -64.801 | -50.877 | -36.139 | -21.957 | -9.947 | -1.977 |
| 3.84499999999994 | -86.16 | -76.957 | -64.945 | -50.996 | -36.23 | -22.02 | -9.983 | -1.989 |
| 3.84999999999994 | -86.341 | -77.122 | -65.089 | -51.114 | -36.322 | -22.082 | -10.018 | -2.001 |
| 3.85499999999994 | -86.522 | -77.287 | -65.233 | -51.233 | -36.413 | -22.145 | -10.054 | -2.013 |
| 3.85999999999994 | -86.703 | -77.452 | -65.377 | -51.353 | -36.504 | -22.208 | -10.09 | -2.025 |
| 3.86499999999994 | -86.884 | -77.618 | -65.522 | -51.472 | -36.596 | -22.271 | -10.125 | -2.037 |
| 3.86999999999994 | -87.066 | -77.783 | -65.666 | -51.591 | -36.688 | -22.334 | -10.161 | -2.049 |
| 3.87499999999994 | -87.247 | -77.949 | -65.811 | -51.711 | -36.779 | -22.397 | -10.197 | -2.061 |
| 3.879999999999939 | -87.429 | -78.115 | -65.956 | -51.831 | -36.871 | -22.461 | -10.233 | -2.074 |
| 3.884999999999939 | -87.611 | -78.282 | -66.101 | -51.951 | -36.963 | -22.524 | -10.269 | -2.086 |
| 3.889999999999939 | -87.794 | -78.448 | -66.246 | -52.071 | -37.056 | -22.588 | -10.305 | -2.098 |
| 3.894999999999939 | -87.976 | -78.615 | -66.392 | -52.191 | -37.148 | -22.651 | -10.341 | -2.111 |
| 3.899999999999939 | -88.159 | -78.781 | -66.537 | -52.311 | -37.24 | -22.715 | -10.377 | -2.123 |
| 3.904999999999939 | -88.342 | -78.948 | -66.683 | -52.432 | -37.333 | -22.779 | -10.414 | -2.135 |
| 3.909999999999939 | -88.525 | -79.115 | -66.829 | -52.552 | -37.426 | -22.843 | -10.45 | -2.148 |
| 3.914999999999939 | -88.708 | -79.283 | -66.975 | -52.673 | -37.519 | -22.907 | -10.486 | -2.16 |
| 3.919999999999939 | -88.892 | -79.45 | -67.121 | -52.794 | -37.612 | -22.971 | -10.523 | -2.173 |
| 3.924999999999939 | -89.075 | -79.618 | -67.268 | -52.915 | -37.705 | -23.035 | -10.559 | -2.185 |
| 3.929999999999938 | -89.259 | -79.786 | -67.414 | -53.037 | -37.798 | -23.099 | -10.596 | -2.198 |
| 3.934999999999938 | -89.443 | -79.954 | -67.561 | -53.158 | -37.891 | -23.164 | -10.633 | -2.211 |
| 3.939999999999938 | -89.627 | -80.122 | -67.708 | -53.28 | -37.985 | -23.228 | -10.67 | -2.223 |
| 3.944999999999938 | -89.812 | -80.29 | -67.855 | -53.401 | -38.078 | -23.293 | -10.706 | -2.236 |
| 3.949999999999938 | -89.996 | -80.459 | -68.003 | -53.523 | -38.172 | -23.358 | -10.743 | -2.249 |
| 3.954999999999938 | -90.181 | -80.628 | -68.15 | -53.645 | -38.266 | -23.423 | -10.78 | -2.262 |
| 3.959999999999938 | -90.366 | -80.797 | -68.298 | -53.767 | -38.36 | -23.488 | -10.818 | -2.275 |
| 3.964999999999938 | -90.551 | -80.966 | -68.446 | -53.89 | -38.454 | -23.553 | -10.855 | -2.288 |
| 3.969999999999938 | -90.737 | -81.135 | -68.593 | -54.012 | -38.549 | -23.618 | -10.892 | -2.3 |
| 3.974999999999937 | -90.922 | -81.305 | -68.742 | -54.135 | -38.643 | -23.683 | -10.929 | -2.313 |
| 3.979999999999937 | -91.108 | -81.474 | -68.89 | -54.257 | -38.737 | -23.748 | -10.967 | -2.326 |
| 3.984999999999937 | -91.294 | -81.644 | -69.038 | -54.38 | -38.832 | -23.814 | -11.004 | -2.339 |
| 3.989999999999937 | -91.48 | -81.814 | -69.187 | -54.503 | -38.927 | -23.879 | -11.042 | -2.353 |
| 3.994999999999937 | -91.666 | -81.984 | -69.336 | -54.627 | -39.022 | -23.945 | -11.079 | -2.366 |
| 3.999999999999937 | -91.853 | -82.155 | -69.485 | -54.75 | -39.117 | -24.011 | -11.117 | -2.379 |
| 4.004999999999937 | -92.04 | -82.325 | -69.634 | -54.874 | -39.212 | -24.077 | -11.155 | -2.392 |
| 4.009999999999936 | -92.226 | -82.496 | -69.783 | -54.997 | -39.307 | -24.143 | -11.192 | -2.405 |
| 4.014999999999937 | -92.414 | -82.667 | -69.933 | -55.121 | -39.403 | -24.209 | -11.23 | -2.418 |
| 4.019999999999936 | -92.601 | -82.838 | -70.082 | -55.245 | -39.498 | -24.275 | -11.268 | -2.432 |
| 4.024999999999936 | -92.788 | -83.01 | -70.232 | -55.369 | -39.594 | -24.341 | -11.306 | -2.445 |
| 4.029999999999936 | -92.976 | -83.181 | -70.382 | -55.493 | -39.69 | -24.408 | -11.344 | -2.459 |
| 4.034999999999936 | -93.164 | -83.353 | -70.532 | -55.618 | -39.786 | -24.474 | -11.382 | -2.472 |
| 4.039999999999936 | -93.352 | -83.525 | -70.683 | -55.742 | -39.882 | -24.541 | -11.421 | -2.485 |
| 4.044999999999936 | -93.54 | -83.697 | -70.833 | -55.867 | -39.978 | -24.607 | -11.459 | -2.499 |
| 4.049999999999935 | -93.729 | -83.869 | -70.984 | -55.992 | -40.074 | -24.674 | -11.497 | -2.512 |
| 4.054999999999936 | -93.917 | -84.041 | -71.135 | -56.117 | -40.171 | -24.741 | -11.536 | -2.526 |
| 4.059999999999935 | -94.106 | -84.214 | -71.286 | -56.242 | -40.267 | -24.808 | -11.574 | -2.54 |
| 4.064999999999936 | -94.295 | -84.387 | -71.437 | -56.367 | -40.364 | -24.875 | -11.613 | -2.553 |
| 4.069999999999935 | -94.484 | -84.56 | -71.588 | -56.493 | -40.461 | -24.942 | -11.652 | -2.567 |
| 4.074999999999935 | -94.674 | -84.733 | -71.74 | -56.618 | -40.558 | -25.009 | -11.69 | -2.581 |
| 4.079999999999935 | -94.863 | -84.906 | -71.891 | -56.744 | -40.655 | -25.077 | -11.729 | -2.594 |
| 4.084999999999935 | -95.053 | -85.079 | -72.043 | -56.87 | -40.752 | -25.144 | -11.768 | -2.608 |
| 4.089999999999935 | -95.243 | -85.253 | -72.195 | -56.996 | -40.849 | -25.212 | -11.807 | -2.622 |
| 4.094999999999935 | -95.433 | -85.427 | -72.347 | -57.122 | -40.947 | -25.28 | -11.846 | -2.636 |
| 4.099999999999934 | -95.624 | -85.601 | -72.5 | -57.249 | -41.044 | -25.347 | -11.885 | -2.65 |
| 4.104999999999935 | -95.814 | -85.775 | -72.652 | -57.375 | -41.142 | -25.415 | -11.924 | -2.664 |
| 4.109999999999934 | -96.005 | -85.95 | -72.805 | -57.502 | -41.24 | -25.483 | -11.964 | -2.678 |
| 4.114999999999934 | -96.196 | -86.124 | -72.958 | -57.629 | -41.338 | -25.551 | -12.003 | -2.692 |
| 4.119999999999934 | -96.387 | -86.299 | -73.111 | -57.756 | -41.436 | -25.62 | -12.042 | -2.706 |
| 4.124999999999934 | -96.578 | -86.474 | -73.264 | -57.883 | -41.534 | -25.688 | -12.082 | -2.72 |
| 4.129999999999934 | -96.77 | -86.649 | -73.417 | -58.01 | -41.633 | -25.756 | -12.121 | -2.734 |
| 4.134999999999934 | -96.961 | -86.824 | -73.571 | -58.137 | -41.731 | -25.825 | -12.161 | -2.748 |
| 4.139999999999934 | -97.153 | -87 | -73.724 | -58.265 | -41.83 | -25.894 | -12.201 | -2.763 |
| 4.144999999999934 | -97.345 | -87.176 | -73.878 | -58.393 | -41.928 | -25.962 | -12.24 | -2.777 |
| 4.149999999999934 | -97.538 | -87.352 | -74.032 | -58.521 | -42.027 | -26.031 | -12.28 | -2.791 |
| 4.154999999999934 | -97.73 | -87.528 | -74.186 | -58.649 | -42.126 | -26.1 | -12.32 | -2.805 |
| 4.159999999999934 | -97.923 | -87.704 | -74.341 | -58.777 | -42.225 | -26.169 | -12.36 | -2.82 |
| 4.164999999999933 | -98.116 | -87.88 | -74.495 | -58.905 | -42.325 | -26.238 | -12.4 | -2.834 |
| 4.169999999999933 | -98.309 | -88.057 | -74.65 | -59.034 | -42.424 | -26.307 | -12.44 | -2.849 |
| 4.174999999999933 | -98.502 | -88.234 | -74.805 | -59.162 | -42.524 | -26.377 | -12.48 | -2.863 |
| 4.179999999999933 | -98.695 | -88.411 | -74.96 | -59.291 | -42.623 | -26.446 | -12.521 | -2.878 |
| 4.184999999999933 | -98.889 | -88.588 | -75.115 | -59.42 | -42.723 | -26.516 | -12.561 | -2.892 |
| 4.189999999999933 | -99.083 | -88.765 | -75.27 | -59.549 | -42.823 | -26.585 | -12.601 | -2.907 |
| 4.194999999999933 | -99.277 | -88.942 | -75.426 | -59.678 | -42.923 | -26.655 | -12.642 | -2.921 |
| 4.199999999999933 | -99.471 | -89.12 | -75.581 | -59.807 | -43.023 | -26.725 | -12.682 | -2.936 |
| 4.204999999999933 | -99.665 | -89.298 | -75.737 | -59.937 | -43.123 | -26.795 | -12.723 | -2.951 |
| 4.209999999999932 | -99.86 | -89.476 | -75.893 | -60.067 | -43.224 | -26.865 | -12.764 | -2.966 |
| 4.214999999999932 | -100.055 | -89.654 | -76.05 | -60.196 | -43.324 | -26.935 | -12.804 | -2.98 |
| 4.219999999999932 | -100.25 | -89.833 | -76.206 | -60.326 | -43.425 | -27.005 | -12.845 | -2.995 |
| 4.224999999999932 | -100.445 | -90.011 | -76.362 | -60.457 | -43.526 | -27.076 | -12.886 | -3.01 |
| 4.229999999999932 | -100.64 | -90.19 | -76.519 | -60.587 | -43.627 | -27.146 | -12.927 | -3.025 |
| 4.234999999999932 | -100.836 | -90.369 | -76.676 | -60.717 | -43.728 | -27.217 | -12.968 | -3.04 |
| 4.239999999999931 | -101.032 | -90.548 | -76.833 | -60.848 | -43.829 | -27.287 | -13.009 | -3.055 |
| 4.244999999999932 | -101.227 | -90.727 | -76.99 | -60.979 | -43.93 | -27.358 | -13.05 | -3.07 |
| 4.249999999999931 | -101.424 | -90.907 | -77.148 | -61.109 | -44.032 | -27.429 | -13.092 | -3.085 |
| 4.254999999999931 | -101.62 | -91.087 | -77.305 | -61.24 | -44.133 | -27.5 | -13.133 | -3.1 |
| 4.259999999999931 | -101.816 | -91.267 | -77.463 | -61.372 | -44.235 | -27.571 | -13.174 | -3.115 |
| 4.264999999999931 | -102.013 | -91.447 | -77.621 | -61.503 | -44.337 | -27.642 | -13.216 | -3.13 |
| 4.269999999999931 | -102.21 | -91.627 | -77.779 | -61.634 | -44.439 | -27.713 | -13.257 | -3.146 |
| 4.274999999999931 | -102.407 | -91.807 | -77.937 | -61.766 | -44.541 | -27.785 | -13.299 | -3.161 |
| 4.27999999999993 | -102.604 | -91.988 | -78.095 | -61.898 | -44.643 | -27.856 | -13.341 | -3.176 |
| 4.284999999999931 | -102.802 | -92.169 | -78.254 | -62.03 | -44.745 | -27.928 | -13.382 | -3.191 |
| 4.28999999999993 | -102.999 | -92.35 | -78.413 | -62.162 | -44.848 | -28 | -13.424 | -3.207 |
| 4.294999999999931 | -103.197 | -92.531 | -78.572 | -62.294 | -44.95 | -28.071 | -13.466 | -3.222 |
| 4.29999999999993 | -103.395 | -92.712 | -78.731 | -62.426 | -45.053 | -28.143 | -13.508 | -3.238 |
| 4.30499999999993 | -103.594 | -92.894 | -78.89 | -62.559 | -45.156 | -28.215 | -13.55 | -3.253 |
| 4.30999999999993 | -103.792 | -93.075 | -79.049 | -62.691 | -45.259 | -28.287 | -13.592 | -3.269 |
| 4.31499999999993 | -103.991 | -93.257 | -79.209 | -62.824 | -45.362 | -28.359 | -13.635 | -3.284 |
| 4.31999999999993 | -104.189 | -93.439 | -79.368 | -62.957 | -45.465 | -28.432 | -13.677 | -3.3 |
| 4.32499999999993 | -104.388 | -93.621 | -79.528 | -63.09 | -45.568 | -28.504 | -13.719 | -3.315 |
| 4.32999999999993 | -104.588 | -93.804 | -79.688 | -63.224 | -45.672 | -28.577 | -13.762 | -3.331 |
| 4.33499999999993 | -104.787 | -93.986 | -79.849 | -63.357 | -45.776 | -28.649 | -13.804 | -3.347 |
| 4.33999999999993 | -104.987 | -94.169 | -80.009 | -63.491 | -45.879 | -28.722 | -13.847 | -3.362 |
| 4.34499999999993 | -105.186 | -94.352 | -80.17 | -63.624 | -45.983 | -28.795 | -13.889 | -3.378 |
| 4.34999999999993 | -105.386 | -94.535 | -80.33 | -63.758 | -46.087 | -28.868 | -13.932 | -3.394 |
| 4.354999999999929 | -105.586 | -94.719 | -80.491 | -63.892 | -46.191 | -28.941 | -13.975 | -3.41 |
| 4.35999999999993 | -105.787 | -94.902 | -80.652 | -64.026 | -46.295 | -29.014 | -14.018 | -3.426 |
| 4.364999999999929 | -105.987 | -95.086 | -80.814 | -64.161 | -46.4 | -29.087 | -14.06 | -3.442 |
| 4.369999999999929 | -106.188 | -95.27 | -80.975 | -64.295 | -46.504 | -29.16 | -14.103 | -3.458 |
| 4.374999999999929 | -106.389 | -95.454 | -81.136 | -64.43 | -46.609 | -29.234 | -14.146 | -3.474 |
| 4.379999999999928 | -106.59 | -95.638 | -81.298 | -64.564 | -46.714 | -29.307 | -14.19 | -3.49 |
| 4.384999999999929 | -106.791 | -95.822 | -81.46 | -64.699 | -46.819 | -29.381 | -14.233 | -3.506 |
| 4.389999999999928 | -106.993 | -96.007 | -81.622 | -64.834 | -46.924 | -29.455 | -14.276 | -3.522 |
| 4.394999999999928 | -107.195 | -96.192 | -81.784 | -64.97 | -47.029 | -29.528 | -14.319 | -3.538 |
| 4.399999999999928 | -107.396 | -96.377 | -81.947 | -65.105 | -47.134 | -29.602 | -14.363 | -3.554 |
| 4.404999999999928 | -107.599 | -96.562 | -82.109 | -65.241 | -47.239 | -29.676 | -14.406 | -3.571 |
| 4.409999999999928 | -107.801 | -96.747 | -82.272 | -65.376 | -47.345 | -29.75 | -14.45 | -3.587 |
| 4.414999999999928 | -108.003 | -96.933 | -82.435 | -65.512 | -47.451 | -29.825 | -14.494 | -3.603 |
| 4.419999999999927 | -108.206 | -97.118 | -82.598 | -65.648 | -47.556 | -29.899 | -14.537 | -3.619 |
| 4.424999999999928 | -108.409 | -97.304 | -82.761 | -65.784 | -47.662 | -29.973 | -14.581 | -3.636 |
| 4.429999999999927 | -108.612 | -97.49 | -82.925 | -65.92 | -47.768 | -30.048 | -14.625 | -3.652 |
| 4.434999999999927 | -108.815 | -97.677 | -83.088 | -66.057 | -47.875 | -30.123 | -14.669 | -3.669 |
| 4.439999999999927 | -109.018 | -97.863 | -83.252 | -66.193 | -47.981 | -30.197 | -14.713 | -3.685 |
| 4.444999999999927 | -109.222 | -98.05 | -83.416 | -66.33 | -48.087 | -30.272 | -14.757 | -3.702 |
| 4.449999999999927 | -109.426 | -98.236 | -83.58 | -66.467 | -48.194 | -30.347 | -14.801 | -3.718 |
| 4.454999999999927 | -109.63 | -98.423 | -83.744 | -66.604 | -48.301 | -30.422 | -14.845 | -3.735 |
| 4.459999999999927 | -109.834 | -98.61 | -83.909 | -66.741 | -48.407 | -30.497 | -14.89 | -3.752 |
| 4.464999999999927 | -110.038 | -98.798 | -84.074 | -66.878 | -48.514 | -30.573 | -14.934 | -3.768 |
| 4.469999999999926 | -110.243 | -98.985 | -84.238 | -67.016 | -48.621 | -30.648 | -14.978 | -3.785 |
| 4.474999999999926 | -110.448 | -99.173 | -84.403 | -67.153 | -48.729 | -30.723 | -15.023 | -3.802 |
| 4.479999999999926 | -110.653 | -99.361 | -84.568 | -67.291 | -48.836 | -30.799 | -15.067 | -3.819 |
| 4.484999999999926 | -110.858 | -99.549 | -84.734 | -67.429 | -48.943 | -30.875 | -15.112 | -3.835 |
| 4.489999999999926 | -111.063 | -99.737 | -84.899 | -67.567 | -49.051 | -30.95 | -15.157 | -3.852 |
| 4.494999999999926 | -111.269 | -99.926 | -85.065 | -67.705 | -49.159 | -31.026 | -15.202 | -3.869 |
| 4.499999999999926 | -111.474 | -100.114 | -85.23 | -67.844 | -49.266 | -31.102 | -15.246 | -3.886 |
| 4.504999999999926 | -111.68 | -100.303 | -85.396 | -67.982 | -49.374 | -31.178 | -15.291 | -3.903 |
| 4.509999999999926 | -111.886 | -100.492 | -85.562 | -68.121 | -49.482 | -31.254 | -15.336 | -3.92 |
| 4.514999999999926 | -112.093 | -100.681 | -85.729 | -68.26 | -49.591 | -31.331 | -15.381 | -3.937 |
| 4.519999999999925 | -112.299 | -100.87 | -85.895 | -68.399 | -49.699 | -31.407 | -15.427 | -3.954 |
| 4.524999999999926 | -112.506 | -101.06 | -86.062 | -68.538 | -49.807 | -31.483 | -15.472 | -3.971 |
| 4.529999999999925 | -112.713 | -101.25 | -86.229 | -68.677 | -49.916 | -31.56 | -15.517 | -3.989 |
| 4.534999999999925 | -112.92 | -101.439 | -86.396 | -68.816 | -50.025 | -31.637 | -15.562 | -4.006 |
| 4.539999999999925 | -113.127 | -101.63 | -86.563 | -68.956 | -50.134 | -31.714 | -15.608 | -4.023 |
| 4.544999999999925 | -113.335 | -101.82 | -86.73 | -69.096 | -50.243 | -31.79 | -15.653 | -4.04 |
| 4.549999999999925 | -113.542 | -102.01 | -86.897 | -69.236 | -50.352 | -31.867 | -15.699 | -4.058 |
| 4.554999999999925 | -113.75 | -102.201 | -87.065 | -69.376 | -50.461 | -31.944 | -15.745 | -4.075 |
| 4.559999999999924 | -113.958 | -102.392 | -87.233 | -69.516 | -50.57 | -32.022 | -15.79 | -4.093 |
| 4.564999999999925 | -114.166 | -102.583 | -87.401 | -69.656 | -50.68 | -32.099 | -15.836 | -4.11 |
| 4.569999999999924 | -114.375 | -102.774 | -87.569 | -69.797 | -50.789 | -32.176 | -15.882 | -4.128 |
| 4.574999999999924 | -114.583 | -102.965 | -87.737 | -69.937 | -50.899 | -32.254 | -15.928 | -4.145 |
| 4.579999999999924 | -114.792 | -103.157 | -87.906 | -70.078 | -51.009 | -32.331 | -15.974 | -4.163 |
| 4.584999999999924 | -115.001 | -103.348 | -88.074 | -70.219 | -51.119 | -32.409 | -16.02 | -4.18 |
| 4.589999999999924 | -115.21 | -103.54 | -88.243 | -70.36 | -51.229 | -32.487 | -16.066 | -4.198 |
| 4.594999999999924 | -115.42 | -103.732 | -88.412 | -70.501 | -51.34 | -32.565 | -16.112 | -4.216 |
| 4.599999999999924 | -115.629 | -103.924 | -88.581 | -70.642 | -51.45 | -32.643 | -16.159 | -4.233 |
| 4.604999999999924 | -115.839 | -104.117 | -88.75 | -70.784 | -51.56 | -32.721 | -16.205 | -4.251 |
| 4.609999999999924 | -116.049 | -104.309 | -88.92 | -70.926 | -51.671 | -32.799 | -16.252 | -4.269 |
| 4.614999999999924 | -116.259 | -104.502 | -89.09 | -71.067 | -51.782 | -32.877 | -16.298 | -4.287 |
| 4.619999999999924 | -116.469 | -104.695 | -89.259 | -71.209 | -51.893 | -32.956 | -16.345 | -4.304 |
| 4.624999999999924 | -116.68 | -104.888 | -89.429 | -71.352 | -52.004 | -33.034 | -16.391 | -4.322 |
| 4.629999999999923 | -116.891 | -105.082 | -89.599 | -71.494 | -52.115 | -33.113 | -16.438 | -4.34 |
| 4.634999999999923 | -117.101 | -105.275 | -89.77 | -71.636 | -52.226 | -33.192 | -16.485 | -4.358 |
| 4.639999999999923 | -117.313 | -105.469 | -89.94 | -71.779 | -52.338 | -33.271 | -16.532 | -4.376 |
| 4.644999999999923 | -117.524 | -105.663 | -90.111 | -71.922 | -52.449 | -33.349 | -16.579 | -4.394 |
| 4.649999999999923 | -117.735 | -105.857 | -90.282 | -72.064 | -52.561 | -33.428 | -16.626 | -4.412 |
| 4.654999999999923 | -117.947 | -106.051 | -90.453 | -72.207 | -52.673 | -33.508 | -16.673 | -4.431 |
| 4.659999999999923 | -118.159 | -106.246 | -90.624 | -72.351 | -52.785 | -33.587 | -16.72 | -4.449 |
| 4.664999999999923 | -118.371 | -106.44 | -90.795 | -72.494 | -52.897 | -33.666 | -16.767 | -4.467 |
| 4.669999999999923 | -118.583 | -106.635 | -90.967 | -72.637 | -53.009 | -33.746 | -16.814 | -4.485 |
| 4.674999999999922 | -118.796 | -106.83 | -91.138 | -72.781 | -53.121 | -33.825 | -16.862 | -4.503 |
| 4.679999999999922 | -119.008 | -107.025 | -91.31 | -72.925 | -53.234 | -33.905 | -16.909 | -4.522 |
| 4.684999999999922 | -119.221 | -107.22 | -91.482 | -73.069 | -53.346 | -33.984 | -16.957 | -4.54 |
| 4.689999999999922 | -119.434 | -107.416 | -91.654 | -73.213 | -53.459 | -34.064 | -17.004 | -4.559 |
| 4.694999999999922 | -119.647 | -107.612 | -91.827 | -73.357 | -53.572 | -34.144 | -17.052 | -4.577 |
| 4.699999999999922 | -119.861 | -107.807 | -91.999 | -73.501 | -53.685 | -34.224 | -17.1 | -4.595 |
| 4.704999999999922 | -120.074 | -108.004 | -92.172 | -73.646 | -53.798 | -34.304 | -17.148 | -4.614 |
| 4.709999999999921 | -120.288 | -108.2 | -92.345 | -73.79 | -53.911 | -34.385 | -17.196 | -4.633 |
| 4.714999999999922 | -120.502 | -108.396 | -92.518 | -73.935 | -54.024 | -34.465 | -17.243 | -4.651 |
| 4.719999999999921 | -120.716 | -108.593 | -92.691 | -74.08 | -54.138 | -34.545 | -17.292 | -4.67 |
| 4.724999999999921 | -120.931 | -108.79 | -92.864 | -74.225 | -54.251 | -34.626 | -17.34 | -4.688 |
| 4.729999999999921 | -121.145 | -108.987 | -93.038 | -74.371 | -54.365 | -34.707 | -17.388 | -4.707 |
| 4.734999999999921 | -121.36 | -109.184 | -93.211 | -74.516 | -54.479 | -34.787 | -17.436 | -4.726 |
| 4.73999999999992 | -121.575 | -109.381 | -93.385 | -74.662 | -54.593 | -34.868 | -17.484 | -4.745 |
| 4.744999999999921 | -121.79 | -109.579 | -93.559 | -74.807 | -54.707 | -34.949 | -17.533 | -4.763 |
| 4.74999999999992 | -122.005 | -109.776 | -93.733 | -74.953 | -54.821 | -35.03 | -17.581 | -4.782 |
| 4.754999999999921 | -122.221 | -109.974 | -93.908 | -75.099 | -54.936 | -35.111 | -17.63 | -4.801 |
| 4.75999999999992 | -122.436 | -110.172 | -94.082 | -75.245 | -55.05 | -35.193 | -17.678 | -4.82 |
| 4.764999999999921 | -122.652 | -110.371 | -94.257 | -75.392 | -55.165 | -35.274 | -17.727 | -4.839 |
| 4.76999999999992 | -122.868 | -110.569 | -94.432 | -75.538 | -55.279 | -35.356 | -17.776 | -4.858 |
| 4.77499999999992 | -123.085 | -110.768 | -94.607 | -75.685 | -55.394 | -35.437 | -17.825 | -4.877 |
| 4.77999999999992 | -123.301 | -110.966 | -94.782 | -75.831 | -55.509 | -35.519 | -17.873 | -4.896 |
| 4.78499999999992 | -123.518 | -111.165 | -94.957 | -75.978 | -55.624 | -35.601 | -17.922 | -4.915 |
| 4.78999999999992 | -123.735 | -111.364 | -95.133 | -76.125 | -55.74 | -35.682 | -17.971 | -4.935 |
| 4.79499999999992 | -123.952 | -111.564 | -95.308 | -76.273 | -55.855 | -35.764 | -18.021 | -4.954 |
| 4.79999999999992 | -124.169 | -111.763 | -95.484 | -76.42 | -55.971 | -35.847 | -18.07 | -4.973 |
| 4.80499999999992 | -124.386 | -111.963 | -95.66 | -76.568 | -56.086 | -35.929 | -18.119 | -4.992 |
| 4.80999999999992 | -124.604 | -112.163 | -95.836 | -76.715 | -56.202 | -36.011 | -18.168 | -5.012 |
| 4.81499999999992 | -124.822 | -112.363 | -96.013 | -76.863 | -56.318 | -36.093 | -18.218 | -5.031 |
| 4.819999999999919 | -125.04 | -112.563 | -96.189 | -77.011 | -56.434 | -36.176 | -18.267 | -5.05 |
| 4.824999999999919 | -125.258 | -112.764 | -96.366 | -77.159 | -56.55 | -36.259 | -18.317 | -5.07 |
| 4.829999999999919 | -125.476 | -112.964 | -96.543 | -77.307 | -56.666 | -36.341 | -18.366 | -5.089 |
| 4.834999999999919 | -125.695 | -113.165 | -96.72 | -77.456 | -56.783 | -36.424 | -18.416 | -5.109 |
| 4.839999999999919 | -125.914 | -113.366 | -96.897 | -77.604 | -56.899 | -36.507 | -18.466 | -5.128 |
| 4.844999999999919 | -126.133 | -113.567 | -97.074 | -77.753 | -57.016 | -36.59 | -18.516 | -5.148 |
| 4.849999999999919 | -126.352 | -113.769 | -97.252 | -77.902 | -57.133 | -36.673 | -18.566 | -5.167 |
| 4.854999999999919 | -126.571 | -113.97 | -97.43 | -78.051 | -57.25 | -36.756 | -18.615 | -5.187 |
| 4.859999999999919 | -126.791 | -114.172 | -97.607 | -78.2 | -57.367 | -36.84 | -18.666 | -5.207 |
| 4.864999999999918 | -127.011 | -114.374 | -97.786 | -78.349 | -57.484 | -36.923 | -18.716 | -5.226 |
| 4.869999999999918 | -127.23 | -114.576 | -97.964 | -78.499 | -57.601 | -37.006 | -18.766 | -5.246 |
| 4.874999999999918 | -127.451 | -114.778 | -98.142 | -78.648 | -57.719 | -37.09 | -18.816 | -5.266 |
| 4.879999999999918 | -127.671 | -114.98 | -98.321 | -78.798 | -57.836 | -37.174 | -18.866 | -5.286 |
| 4.884999999999918 | -127.891 | -115.183 | -98.499 | -78.948 | -57.954 | -37.258 | -18.917 | -5.306 |
| 4.889999999999918 | -128.112 | -115.386 | -98.678 | -79.098 | -58.072 | -37.341 | -18.967 | -5.326 |
| 4.894999999999918 | -128.333 | -115.589 | -98.857 | -79.248 | -58.19 | -37.426 | -19.018 | -5.346 |
| 4.899999999999918 | -128.554 | -115.792 | -99.036 | -79.399 | -58.308 | -37.51 | -19.068 | -5.366 |
| 4.904999999999918 | -128.775 | -115.995 | -99.216 | -79.549 | -58.426 | -37.594 | -19.119 | -5.386 |
| 4.909999999999917 | -128.997 | -116.199 | -99.395 | -79.7 | -58.544 | -37.678 | -19.17 | -5.406 |
| 4.914999999999917 | -129.218 | -116.403 | -99.575 | -79.851 | -58.663 | -37.763 | -19.221 | -5.426 |
| 4.919999999999917 | -129.44 | -116.606 | -99.755 | -80.002 | -58.781 | -37.847 | -19.272 | -5.446 |
| 4.924999999999917 | -129.662 | -116.811 | -99.935 | -80.153 | -58.9 | -37.932 | -19.323 | -5.466 |
| 4.929999999999917 | -129.885 | -117.015 | -100.115 | -80.304 | -59.019 | -38.017 | -19.374 | -5.486 |
| 4.934999999999917 | -130.107 | -117.219 | -100.296 | -80.455 | -59.138 | -38.101 | -19.425 | -5.507 |
| 4.939999999999916 | -130.33 | -117.424 | -100.476 | -80.607 | -59.257 | -38.186 | -19.476 | -5.527 |
| 4.944999999999917 | -130.552 | -117.629 | -100.657 | -80.759 | -59.376 | -38.271 | -19.527 | -5.547 |
| 4.949999999999916 | -130.775 | -117.834 | -100.838 | -80.911 | -59.495 | -38.356 | -19.579 | -5.568 |
| 4.954999999999917 | -130.999 | -118.039 | -101.019 | -81.063 | -59.615 | -38.442 | -19.63 | -5.588 |
| 4.959999999999916 | -131.222 | -118.244 | -101.2 | -81.215 | -59.735 | -38.527 | -19.682 | -5.609 |
| 4.964999999999916 | -131.446 | -118.45 | -101.382 | -81.367 | -59.854 | -38.613 | -19.733 | -5.629 |
| 4.969999999999916 | -131.669 | -118.655 | -101.563 | -81.52 | -59.974 | -38.698 | -19.785 | -5.65 |
| 4.974999999999916 | -131.893 | -118.861 | -101.745 | -81.672 | -60.094 | -38.784 | -19.836 | -5.67 |
| 4.979999999999916 | -132.117 | -119.067 | -101.927 | -81.825 | -60.214 | -38.869 | -19.888 | -5.691 |
| 4.984999999999916 | -132.342 | -119.274 | -102.109 | -81.978 | -60.334 | -38.955 | -19.94 | -5.711 |
| 4.989999999999915 | -132.566 | -119.48 | -102.291 | -82.131 | -60.455 | -39.041 | -19.992 | -5.732 |
| 4.994999999999916 | -132.791 | -119.687 | -102.473 | -82.284 | -60.575 | -39.127 | -20.044 | -5.753 |
| 4.999999999999915 | -133.016 | -119.893 | -102.656 | -82.437 | -60.696 | -39.213 | -20.096 | -5.773 |
| 5.004999999999916 | -133.241 | -120.1 | -102.839 | -82.591 | -60.817 | -39.3 | -20.148 | -5.794 |
| 5.009999999999915 | -133.466 | -120.308 | -103.022 | -82.745 | -60.938 | -39.386 | -20.2 | -5.815 |
| 5.014999999999915 | -133.692 | -120.515 | -103.205 | -82.898 | -61.059 | -39.473 | -20.253 | -5.836 |
| 5.019999999999915 | -133.918 | -120.723 | -103.388 | -83.052 | -61.18 | -39.559 | -20.305 | -5.857 |
| 5.024999999999915 | -134.143 | -120.93 | -103.571 | -83.207 | -61.301 | -39.646 | -20.357 | -5.878 |
| 5.029999999999915 | -134.37 | -121.138 | -103.755 | -83.361 | -61.422 | -39.733 | -20.41 | -5.899 |
| 5.034999999999915 | -134.596 | -121.346 | -103.939 | -83.515 | -61.544 | -39.819 | -20.462 | -5.92 |
| 5.039999999999914 | -134.822 | -121.554 | -104.123 | -83.67 | -61.666 | -39.906 | -20.515 | -5.941 |
| 5.044999999999915 | -135.049 | -121.763 | -104.307 | -83.825 | -61.787 | -39.994 | -20.568 | -5.962 |
| 5.049999999999914 | -135.276 | -121.972 | -104.491 | -83.979 | -61.909 | -40.081 | -20.621 | -5.983 |
| 5.054999999999914 | -135.503 | -122.18 | -104.675 | -84.134 | -62.031 | -40.168 | -20.673 | -6.004 |
| 5.059999999999914 | -135.73 | -122.389 | -104.86 | -84.29 | -62.154 | -40.255 | -20.726 | -6.026 |
| 5.064999999999914 | -135.957 | -122.598 | -105.045 | -84.445 | -62.276 | -40.343 | -20.779 | -6.047 |
| 5.069999999999914 | -136.185 | -122.808 | -105.23 | -84.6 | -62.398 | -40.43 | -20.832 | -6.068 |
| 5.074999999999914 | -136.413 | -123.017 | -105.415 | -84.756 | -62.521 | -40.518 | -20.886 | -6.089 |
| 5.079999999999914 | -136.641 | -123.227 | -105.6 | -84.912 | -62.644 | -40.606 | -20.939 | -6.111 |
| 5.084999999999914 | -136.869 | -123.437 | -105.785 | -85.068 | -62.766 | -40.694 | -20.992 | -6.132 |
| 5.089999999999914 | -137.097 | -123.647 | -105.971 | -85.224 | -62.889 | -40.782 | -21.045 | -6.154 |
| 5.094999999999914 | -137.326 | -123.857 | -106.157 | -85.38 | -63.012 | -40.87 | -21.099 | -6.175 |
| 5.099999999999913 | -137.555 | -124.068 | -106.343 | -85.536 | -63.136 | -40.958 | -21.152 | -6.197 |
| 5.104999999999913 | -137.784 | -124.278 | -106.529 | -85.693 | -63.259 | -41.046 | -21.206 | -6.218 |
| 5.109999999999913 | -138.013 | -124.489 | -106.715 | -85.849 | -63.382 | -41.135 | -21.26 | -6.24 |
| 5.114999999999913 | -138.242 | -124.7 | -106.902 | -86.006 | -63.506 | -41.223 | -21.313 | -6.261 |
| 5.119999999999913 | -138.472 | -124.911 | -107.088 | -86.163 | -63.63 | -41.312 | -21.367 | -6.283 |
| 5.124999999999913 | -138.701 | -125.123 | -107.275 | -86.32 | -63.753 | -41.401 | -21.421 | -6.305 |
| 5.129999999999913 | -138.931 | -125.334 | -107.462 | -86.478 | -63.877 | -41.49 | -21.475 | -6.326 |
| 5.134999999999913 | -139.161 | -125.546 | -107.649 | -86.635 | -64.001 | -41.578 | -21.529 | -6.348 |
| 5.139999999999913 | -139.392 | -125.758 | -107.836 | -86.793 | -64.126 | -41.667 | -21.583 | -6.37 |
| 5.144999999999913 | -139.622 | -125.97 | -108.024 | -86.95 | -64.25 | -41.757 | -21.637 | -6.392 |
| 5.149999999999912 | -139.853 | -126.182 | -108.211 | -87.108 | -64.374 | -41.846 | -21.691 | -6.414 |
| 5.154999999999912 | -140.084 | -126.395 | -108.399 | -87.266 | -64.499 | -41.935 | -21.746 | -6.436 |
| 5.159999999999912 | -140.315 | -126.607 | -108.587 | -87.424 | -64.624 | -42.025 | -21.8 | -6.458 |
| 5.164999999999912 | -140.546 | -126.82 | -108.775 | -87.583 | -64.749 | -42.114 | -21.854 | -6.48 |
| 5.169999999999912 | -140.778 | -127.033 | -108.963 | -87.741 | -64.874 | -42.204 | -21.909 | -6.502 |
| 5.174999999999912 | -141.009 | -127.246 | -109.152 | -87.9 | -64.999 | -42.293 | -21.963 | -6.524 |
| 5.179999999999912 | -141.241 | -127.46 | -109.34 | -88.058 | -65.124 | -42.383 | -22.018 | -6.546 |
| 5.184999999999912 | -141.473 | -127.673 | -109.529 | -88.217 | -65.249 | -42.473 | -22.073 | -6.568 |
| 5.189999999999912 | -141.705 | -127.887 | -109.718 | -88.376 | -65.375 | -42.563 | -22.128 | -6.59 |
| 5.194999999999911 | -141.938 | -128.101 | -109.907 | -88.536 | -65.5 | -42.653 | -22.182 | -6.613 |
| 5.199999999999911 | -142.17 | -128.315 | -110.097 | -88.695 | -65.626 | -42.744 | -22.237 | -6.635 |
| 5.204999999999911 | -142.403 | -128.529 | -110.286 | -88.855 | -65.752 | -42.834 | -22.292 | -6.657 |
| 5.209999999999911 | -142.636 | -128.744 | -110.476 | -89.014 | -65.878 | -42.924 | -22.348 | -6.68 |
| 5.214999999999911 | -142.869 | -128.958 | -110.666 | -89.174 | -66.004 | -43.015 | -22.403 | -6.702 |
| 5.219999999999911 | -143.103 | -129.173 | -110.855 | -89.334 | -66.131 | -43.106 | -22.458 | -6.724 |
| 5.224999999999911 | -143.336 | -129.388 | -111.046 | -89.494 | -66.257 | -43.196 | -22.513 | -6.747 |
| 5.229999999999911 | -143.57 | -129.603 | -111.236 | -89.654 | -66.383 | -43.287 | -22.569 | -6.769 |
| 5.234999999999911 | -143.804 | -129.819 | -111.426 | -89.815 | -66.51 | -43.378 | -22.624 | -6.792 |
| 5.23999999999991 | -144.038 | -130.034 | -111.617 | -89.975 | -66.637 | -43.469 | -22.68 | -6.814 |
| 5.24499999999991 | -144.272 | -130.25 | -111.808 | -90.136 | -66.764 | -43.56 | -22.735 | -6.837 |
| 5.24999999999991 | -144.507 | -130.466 | -111.999 | -90.297 | -66.891 | -43.652 | -22.791 | -6.86 |
| 5.25499999999991 | -144.742 | -130.682 | -112.19 | -90.458 | -67.018 | -43.743 | -22.847 | -6.882 |
| 5.25999999999991 | -144.976 | -130.898 | -112.381 | -90.619 | -67.145 | -43.835 | -22.902 | -6.905 |
| 5.26499999999991 | -145.212 | -131.114 | -112.573 | -90.78 | -67.273 | -43.926 | -22.958 | -6.928 |
| 5.26999999999991 | -145.447 | -131.331 | -112.764 | -90.942 | -67.4 | -44.018 | -23.014 | -6.951 |
| 5.27499999999991 | -145.682 | -131.548 | -112.956 | -91.103 | -67.528 | -44.11 | -23.07 | -6.974 |
| 5.27999999999991 | -145.918 | -131.765 | -113.148 | -91.265 | -67.656 | -44.201 | -23.126 | -6.996 |
| 5.28499999999991 | -146.154 | -131.982 | -113.34 | -91.427 | -67.784 | -44.293 | -23.182 | -7.019 |
| 5.28999999999991 | -146.39 | -132.199 | -113.533 | -91.589 | -67.912 | -44.385 | -23.239 | -7.042 |
| 5.294999999999909 | -146.626 | -132.417 | -113.725 | -91.751 | -68.04 | -44.478 | -23.295 | -7.065 |
| 5.29999999999991 | -146.863 | -132.635 | -113.918 | -91.914 | -68.168 | -44.57 | -23.351 | -7.088 |
| 5.304999999999909 | -147.099 | -132.853 | -114.111 | -92.076 | -68.297 | -44.662 | -23.408 | -7.111 |
| 5.309999999999909 | -147.336 | -133.071 | -114.304 | -92.239 | -68.425 | -44.755 | -23.464 | -7.134 |
| 5.314999999999909 | -147.573 | -133.289 | -114.497 | -92.402 | -68.554 | -44.847 | -23.521 | -7.158 |
| 5.319999999999909 | -147.81 | -133.507 | -114.69 | -92.565 | -68.683 | -44.94 | -23.578 | -7.181 |
| 5.324999999999909 | -148.048 | -133.726 | -114.884 | -92.728 | -68.812 | -45.033 | -23.634 | -7.204 |
| 5.329999999999909 | -148.285 | -133.945 | -115.077 | -92.891 | -68.941 | -45.126 | -23.691 | -7.227 |
| 5.334999999999908 | -148.523 | -134.164 | -115.271 | -93.054 | -69.07 | -45.219 | -23.748 | -7.251 |
| 5.339999999999908 | -148.761 | -134.383 | -115.465 | -93.218 | -69.199 | -45.312 | -23.805 | -7.274 |
| 5.344999999999908 | -148.999 | -134.602 | -115.659 | -93.382 | -69.329 | -45.405 | -23.862 | -7.297 |
| 5.349999999999908 | -149.238 | -134.822 | -115.854 | -93.546 | -69.458 | -45.498 | -23.919 | -7.321 |
| 5.354999999999908 | -149.476 | -135.042 | -116.048 | -93.71 | -69.588 | -45.592 | -23.976 | -7.344 |
| 5.359999999999908 | -149.715 | -135.262 | -116.243 | -93.874 | -69.718 | -45.685 | -24.034 | -7.368 |
| 5.364999999999908 | -149.954 | -135.482 | -116.438 | -94.038 | -69.848 | -45.779 | -24.091 | -7.391 |
| 5.369999999999908 | -150.193 | -135.702 | -116.633 | -94.203 | -69.978 | -45.873 | -24.148 | -7.415 |
| 5.374999999999908 | -150.432 | -135.922 | -116.828 | -94.367 | -70.108 | -45.966 | -24.206 | -7.438 |
| 5.379999999999907 | -150.672 | -136.143 | -117.023 | -94.532 | -70.239 | -46.06 | -24.263 | -7.462 |
| 5.384999999999907 | -150.911 | -136.364 | -117.219 | -94.697 | -70.369 | -46.154 | -24.321 | -7.486 |
| 5.389999999999907 | -151.151 | -136.585 | -117.414 | -94.862 | -70.5 | -46.248 | -24.379 | -7.509 |
| 5.394999999999907 | -151.391 | -136.806 | -117.61 | -95.027 | -70.63 | -46.343 | -24.436 | -7.533 |
| 5.399999999999907 | -151.632 | -137.027 | -117.806 | -95.192 | -70.761 | -46.437 | -24.494 | -7.557 |
| 5.404999999999907 | -151.872 | -137.249 | -118.002 | -95.358 | -70.892 | -46.531 | -24.552 | -7.581 |
| 5.409999999999906 | -152.113 | -137.471 | -118.199 | -95.524 | -71.023 | -46.626 | -24.61 | -7.605 |
| 5.414999999999907 | -152.354 | -137.693 | -118.395 | -95.689 | -71.155 | -46.721 | -24.668 | -7.629 |
| 5.419999999999906 | -152.595 | -137.915 | -118.592 | -95.855 | -71.286 | -46.815 | -24.726 | -7.653 |
| 5.424999999999907 | -152.836 | -138.137 | -118.789 | -96.022 | -71.418 | -46.91 | -24.784 | -7.677 |
| 5.429999999999906 | -153.077 | -138.359 | -118.986 | -96.188 | -71.549 | -47.005 | -24.843 | -7.701 |
| 5.434999999999906 | -153.319 | -138.582 | -119.183 | -96.354 | -71.681 | -47.1 | -24.901 | -7.725 |
| 5.439999999999906 | -153.561 | -138.805 | -119.38 | -96.521 | -71.813 | -47.195 | -24.959 | -7.749 |
| 5.444999999999906 | -153.803 | -139.028 | -119.578 | -96.688 | -71.945 | -47.29 | -25.018 | -7.773 |
| 5.449999999999905 | -154.045 | -139.251 | -119.775 | -96.854 | -72.077 | -47.386 | -25.076 | -7.797 |
| 5.454999999999906 | -154.287 | -139.474 | -119.973 | -97.021 | -72.209 | -47.481 | -25.135 | -7.821 |
| 5.459999999999905 | -154.53 | -139.698 | -120.171 | -97.189 | -72.342 | -47.577 | -25.194 | -7.845 |
| 5.464999999999906 | -154.773 | -139.922 | -120.37 | -97.356 | -72.474 | -47.672 | -25.252 | -7.87 |
| 5.469999999999905 | -155.016 | -140.146 | -120.568 | -97.523 | -72.607 | -47.768 | -25.311 | -7.894 |
| 5.474999999999905 | -155.259 | -140.37 | -120.766 | -97.691 | -72.74 | -47.864 | -25.37 | -7.918 |
| 5.479999999999905 | -155.502 | -140.594 | -120.965 | -97.859 | -72.873 | -47.96 | -25.429 | -7.943 |
| 5.484999999999905 | -155.746 | -140.818 | -121.164 | -98.027 | -73.006 | -48.056 | -25.488 | -7.967 |
| 5.489999999999905 | -155.99 | -141.043 | -121.363 | -98.195 | -73.139 | -48.152 | -25.547 | -7.992 |
| 5.494999999999905 | -156.233 | -141.268 | -121.562 | -98.363 | -73.272 | -48.248 | -25.606 | -8.016 |
| 5.499999999999904 | -156.478 | -141.493 | -121.762 | -98.531 | -73.406 | -48.345 | -25.666 | -8.041 |
| 5.504999999999905 | -156.722 | -141.718 | -121.961 | -98.7 | -73.539 | -48.441 | -25.725 | -8.065 |
| 5.509999999999904 | -156.966 | -141.943 | -122.161 | -98.868 | -73.673 | -48.538 | -25.784 | -8.09 |
| 5.514999999999905 | -157.211 | -142.169 | -122.361 | -99.037 | -73.807 | -48.635 | -25.844 | -8.115 |
| 5.519999999999904 | -157.456 | -142.395 | -122.561 | -99.206 | -73.941 | -48.731 | -25.903 | -8.139 |
| 5.524999999999904 | -157.701 | -142.621 | -122.761 | -99.375 | -74.075 | -48.828 | -25.963 | -8.164 |
| 5.529999999999904 | -157.946 | -142.847 | -122.961 | -99.545 | -74.209 | -48.925 | -26.023 | -8.189 |
| 5.534999999999904 | -158.192 | -143.073 | -123.162 | -99.714 | -74.343 | -49.022 | -26.082 | -8.214 |
| 5.539999999999904 | -158.437 | -143.299 | -123.363 | -99.884 | -74.478 | -49.119 | -26.142 | -8.239 |
| 5.544999999999904 | -158.683 | -143.526 | -123.564 | -100.053 | -74.612 | -49.217 | -26.202 | -8.264 |
| 5.549999999999904 | -158.929 | -143.753 | -123.765 | -100.223 | -74.747 | -49.314 | -26.262 | -8.288 |
| 5.554999999999904 | -159.176 | -143.98 | -123.966 | -100.393 | -74.882 | -49.412 | -26.322 | -8.313 |
| 5.559999999999904 | -159.422 | -144.207 | -124.167 | -100.563 | -75.017 | -49.509 | -26.382 | -8.338 |
| 5.564999999999904 | -159.669 | -144.434 | -124.369 | -100.734 | -75.152 | -49.607 | -26.443 | -8.364 |
| 5.569999999999903 | -159.915 | -144.662 | -124.57 | -100.904 | -75.287 | -49.705 | -26.503 | -8.389 |
| 5.574999999999903 | -160.162 | -144.89 | -124.772 | -101.075 | -75.422 | -49.803 | -26.563 | -8.414 |
| 5.579999999999903 | -160.41 | -145.118 | -124.974 | -101.245 | -75.558 | -49.901 | -26.624 | -8.439 |
| 5.584999999999903 | -160.657 | -145.346 | -125.177 | -101.416 | -75.694 | -49.999 | -26.684 | -8.464 |
| 5.589999999999903 | -160.905 | -145.574 | -125.379 | -101.587 | -75.829 | -50.097 | -26.745 | -8.489 |
| 5.594999999999903 | -161.152 | -145.802 | -125.582 | -101.759 | -75.965 | -50.195 | -26.805 | -8.515 |
| 5.599999999999903 | -161.4 | -146.031 | -125.784 | -101.93 | -76.101 | -50.294 | -26.866 | -8.54 |
| 5.604999999999903 | -161.648 | -146.26 | -125.987 | -102.102 | -76.237 | -50.392 | -26.927 | -8.565 |
| 5.609999999999903 | -161.897 | -146.489 | -126.19 | -102.273 | -76.373 | -50.491 | -26.988 | -8.591 |
| 5.614999999999902 | -162.145 | -146.718 | -126.394 | -102.445 | -76.51 | -50.589 | -27.048 | -8.616 |
| 5.619999999999902 | -162.394 | -146.948 | -126.597 | -102.617 | -76.646 | -50.688 | -27.109 | -8.642 |
| 5.624999999999902 | -162.643 | -147.177 | -126.8 | -102.789 | -76.783 | -50.787 | -27.17 | -8.667 |
| 5.629999999999902 | -162.892 | -147.407 | -127.004 | -102.961 | -76.92 | -50.886 | -27.232 | -8.693 |
| 5.634999999999902 | -163.141 | -147.637 | -127.208 | -103.134 | -77.057 | -50.985 | -27.293 | -8.718 |
| 5.639999999999902 | -163.391 | -147.867 | -127.412 | -103.306 | -77.194 | -51.084 | -27.354 | -8.744 |
| 5.644999999999902 | -163.641 | -148.097 | -127.616 | -103.479 | -77.331 | -51.184 | -27.415 | -8.769 |
| 5.649999999999902 | -163.89 | -148.328 | -127.821 | -103.652 | -77.468 | -51.283 | -27.477 | -8.795 |
| 5.654999999999902 | -164.141 | -148.558 | -128.025 | -103.825 | -77.605 | -51.383 | -27.538 | -8.821 |
| 5.659999999999901 | -164.391 | -148.789 | -128.23 | -103.998 | -77.743 | -51.482 | -27.6 | -8.847 |
| 5.664999999999901 | -164.641 | -149.02 | -128.435 | -104.171 | -77.881 | -51.582 | -27.662 | -8.872 |
| 5.669999999999901 | -164.892 | -149.251 | -128.64 | -104.345 | -78.018 | -51.682 | -27.723 | -8.898 |
| 5.674999999999901 | -165.143 | -149.483 | -128.845 | -104.518 | -78.156 | -51.782 | -27.785 | -8.924 |
| 5.679999999999901 | -165.394 | -149.714 | -129.051 | -104.692 | -78.294 | -51.882 | -27.847 | -8.95 |
| 5.684999999999901 | -165.645 | -149.946 | -129.256 | -104.866 | -78.433 | -51.982 | -27.909 | -8.976 |
| 5.689999999999901 | -165.896 | -150.178 | -129.462 | -105.04 | -78.571 | -52.082 | -27.971 | -9.002 |
| 5.694999999999901 | -166.148 | -150.41 | -129.668 | -105.214 | -78.709 | -52.183 | -28.033 | -9.028 |
| 5.699999999999901 | -166.4 | -150.642 | -129.874 | -105.389 | -78.848 | -52.283 | -28.095 | -9.054 |
| 5.704999999999901 | -166.652 | -150.875 | -130.08 | -105.563 | -78.987 | -52.384 | -28.157 | -9.08 |
| 5.7099999999999 | -166.904 | -151.107 | -130.287 | -105.738 | -79.125 | -52.484 | -28.22 | -9.106 |
| 5.7149999999999 | -167.156 | -151.34 | -130.494 | -105.913 | -79.264 | -52.585 | -28.282 | -9.133 |
| 5.7199999999999 | -167.409 | -151.573 | -130.7 | -106.088 | -79.403 | -52.686 | -28.344 | -9.159 |
| 5.7249999999999 | -167.662 | -151.806 | -130.907 | -106.263 | -79.543 | -52.787 | -28.407 | -9.185 |
| 5.7299999999999 | -167.915 | -152.04 | -131.114 | -106.438 | -79.682 | -52.888 | -28.469 | -9.211 |
| 5.7349999999999 | -168.168 | -152.273 | -131.322 | -106.613 | -79.821 | -52.989 | -28.532 | -9.238 |
| 5.7399999999999 | -168.421 | -152.507 | -131.529 | -106.789 | -79.961 | -53.09 | -28.595 | -9.264 |
| 5.7449999999999 | -168.675 | -152.741 | -131.737 | -106.965 | -80.101 | -53.192 | -28.658 | -9.291 |
| 5.7499999999999 | -168.928 | -152.975 | -131.944 | -107.141 | -80.24 | -53.293 | -28.72 | -9.317 |
| 5.754999999999899 | -169.182 | -153.209 | -132.152 | -107.317 | -80.38 | -53.395 | -28.783 | -9.344 |
| 5.7599999999999 | -169.436 | -153.444 | -132.36 | -107.493 | -80.52 | -53.496 | -28.846 | -9.37 |
| 5.764999999999899 | -169.691 | -153.678 | -132.569 | -107.669 | -80.661 | -53.598 | -28.909 | -9.397 |
| 5.7699999999999 | -169.945 | -153.913 | -132.777 | -107.846 | -80.801 | -53.7 | -28.973 | -9.423 |
| 5.7749999999999 | -170.2 | -154.148 | -132.986 | -108.022 | -80.941 | -53.802 | -29.036 | -9.45 |
| 5.779999999999898 | -170.455 | -154.383 | -133.195 | -108.199 | -81.082 | -53.904 | -29.099 | -9.477 |
| 5.784999999999899 | -170.71 | -154.619 | -133.404 | -108.376 | -81.223 | -54.006 | -29.162 | -9.503 |
| 5.789999999999898 | -170.965 | -154.854 | -133.613 | -108.553 | -81.364 | -54.108 | -29.226 | -9.53 |
| 5.794999999999899 | -171.221 | -155.09 | -133.822 | -108.73 | -81.505 | -54.211 | -29.289 | -9.557 |
| 5.799999999999898 | -171.476 | -155.326 | -134.031 | -108.907 | -81.646 | -54.313 | -29.353 | -9.584 |
| 5.804999999999898 | -171.732 | -155.562 | -134.241 | -109.085 | -81.787 | -54.416 | -29.417 | -9.611 |
| 5.809999999999898 | -171.988 | -155.798 | -134.451 | -109.263 | -81.928 | -54.519 | -29.48 | -9.637 |
| 5.814999999999898 | -172.244 | -156.035 | -134.661 | -109.44 | -82.07 | -54.621 | -29.544 | -9.664 |
| 5.819999999999898 | -172.501 | -156.272 | -134.871 | -109.618 | -82.211 | -54.724 | -29.608 | -9.691 |
| 5.824999999999898 | -172.757 | -156.508 | -135.081 | -109.797 | -82.353 | -54.827 | -29.672 | -9.718 |
| 5.829999999999898 | -173.014 | -156.745 | -135.292 | -109.975 | -82.495 | -54.93 | -29.736 | -9.745 |
| 5.834999999999898 | -173.271 | -156.983 | -135.502 | -110.153 | -82.637 | -55.033 | -29.8 | -9.773 |
| 5.839999999999897 | -173.528 | -157.22 | -135.713 | -110.332 | -82.779 | -55.137 | -29.864 | -9.8 |
| 5.844999999999898 | -173.786 | -157.458 | -135.924 | -110.511 | -82.922 | -55.24 | -29.928 | -9.827 |
| 5.849999999999897 | -174.043 | -157.695 | -136.135 | -110.689 | -83.064 | -55.344 | -29.993 | -9.854 |
| 5.854999999999897 | -174.301 | -157.933 | -136.346 | -110.868 | -83.206 | -55.447 | -30.057 | -9.881 |
| 5.859999999999897 | -174.559 | -158.171 | -136.558 | -111.048 | -83.349 | -55.551 | -30.122 | -9.909 |
| 5.864999999999897 | -174.817 | -158.41 | -136.77 | -111.227 | -83.492 | -55.655 | -30.186 | -9.936 |
| 5.869999999999897 | -175.075 | -158.648 | -136.981 | -111.406 | -83.635 | -55.759 | -30.251 | -9.963 |
| 5.874999999999897 | -175.334 | -158.887 | -137.193 | -111.586 | -83.778 | -55.863 | -30.315 | -9.991 |
| 5.879999999999896 | -175.593 | -159.126 | -137.405 | -111.766 | -83.921 | -55.967 | -30.38 | -10.018 |
| 5.884999999999897 | -175.851 | -159.365 | -137.618 | -111.946 | -84.064 | -56.071 | -30.445 | -10.046 |
| 5.889999999999896 | -176.111 | -159.604 | -137.83 | -112.126 | -84.208 | -56.175 | -30.51 | -10.073 |
| 5.894999999999896 | -176.37 | -159.843 | -138.043 | -112.306 | -84.351 | -56.28 | -30.575 | -10.101 |
| 5.899999999999896 | -176.629 | -160.083 | -138.256 | -112.486 | -84.495 | -56.384 | -30.64 | -10.128 |
| 5.904999999999896 | -176.889 | -160.322 | -138.469 | -112.667 | -84.639 | -56.489 | -30.705 | -10.156 |
| 5.909999999999896 | -177.149 | -160.562 | -138.682 | -112.847 | -84.783 | -56.594 | -30.77 | -10.184 |
| 5.914999999999896 | -177.409 | -160.803 | -138.895 | -113.028 | -84.927 | -56.699 | -30.835 | -10.211 |
| 5.919999999999895 | -177.669 | -161.043 | -139.109 | -113.209 | -85.071 | -56.803 | -30.9 | -10.239 |
| 5.924999999999896 | -177.93 | -161.283 | -139.322 | -113.39 | -85.215 | -56.908 | -30.966 | -10.267 |
| 5.929999999999895 | -178.19 | -161.524 | -139.536 | -113.572 | -85.36 | -57.014 | -31.031 | -10.295 |
| 5.934999999999895 | -178.451 | -161.765 | -139.75 | -113.753 | -85.504 | -57.119 | -31.097 | -10.323 |
| 5.939999999999895 | -178.712 | -162.006 | -139.964 | -113.935 | -85.649 | -57.224 | -31.162 | -10.35 |
| 5.944999999999895 | -178.973 | -162.247 | -140.179 | -114.116 | -85.794 | -57.33 | -31.228 | -10.378 |
| 5.949999999999895 | -179.235 | -162.488 | -140.393 | -114.298 | -85.939 | -57.435 | -31.294 | -10.406 |
| 5.954999999999895 | -179.496 | -162.73 | -140.608 | -114.48 | -86.084 | -57.541 | -31.36 | -10.434 |
| 5.959999999999895 | -179.758 | -162.972 | -140.823 | -114.662 | -86.229 | -57.647 | -31.426 | -10.462 |
| 5.964999999999895 | -180.02 | -163.214 | -141.038 | -114.845 | -86.374 | -57.752 | -31.491 | -10.491 |
| 5.969999999999894 | -180.282 | -163.456 | -141.253 | -115.027 | -86.52 | -57.858 | -31.558 | -10.519 |
| 5.974999999999894 | -180.545 | -163.698 | -141.468 | -115.21 | -86.665 | -57.964 | -31.624 | -10.547 |
| 5.979999999999894 | -180.807 | -163.94 | -141.684 | -115.392 | -86.811 | -58.071 | -31.69 | -10.575 |
| 5.984999999999894 | -181.07 | -164.183 | -141.899 | -115.575 | -86.957 | -58.177 | -31.756 | -10.603 |
| 5.989999999999894 | -181.333 | -164.426 | -142.115 | -115.758 | -87.103 | -58.283 | -31.822 | -10.632 |
| 5.994999999999894 | -181.596 | -164.669 | -142.331 | -115.942 | -87.249 | -58.39 | -31.889 | -10.66 |
| 5.999999999999894 | -181.859 | -164.912 | -142.547 | -116.125 | -87.395 | -58.496 | -31.955 | -10.688 |
| 6.004999999999894 | -182.123 | -165.156 | -142.764 | -116.309 | -87.542 | -58.603 | -32.022 | -10.717 |
| 6.009999999999894 | -182.386 | -165.399 | -142.98 | -116.492 | -87.688 | -58.71 | -32.088 | -10.745 |
| 6.014999999999894 | -182.65 | -165.643 | -143.197 | -116.676 | -87.835 | -58.816 | -32.155 | -10.773 |
| 6.019999999999894 | -182.914 | -165.887 | -143.414 | -116.86 | -87.981 | -58.923 | -32.222 | -10.802 |
| 6.024999999999894 | -183.179 | -166.131 | -143.631 | -117.044 | -88.128 | -59.031 | -32.289 | -10.831 |
| 6.029999999999894 | -183.443 | -166.375 | -143.848 | -117.228 | -88.275 | -59.138 | -32.355 | -10.859 |
| 6.034999999999894 | -183.708 | -166.62 | -144.065 | -117.413 | -88.422 | -59.245 | -32.422 | -10.888 |
| 6.039999999999893 | -183.973 | -166.864 | -144.283 | -117.597 | -88.57 | -59.352 | -32.489 | -10.916 |
| 6.044999999999893 | -184.238 | -167.109 | -144.5 | -117.782 | -88.717 | -59.46 | -32.557 | -10.945 |
| 6.049999999999893 | -184.503 | -167.354 | -144.718 | -117.967 | -88.865 | -59.567 | -32.624 | -10.974 |
| 6.054999999999893 | -184.768 | -167.599 | -144.936 | -118.152 | -89.012 | -59.675 | -32.691 | -11.003 |
| 6.059999999999893 | -185.034 | -167.845 | -145.154 | -118.337 | -89.16 | -59.783 | -32.758 | -11.031 |
| 6.064999999999893 | -185.3 | -168.09 | -145.373 | -118.522 | -89.308 | -59.891 | -32.826 | -11.06 |
| 6.069999999999893 | -185.566 | -168.336 | -145.591 | -118.708 | -89.456 | -59.999 | -32.893 | -11.089 |
| 6.074999999999893 | -185.832 | -168.582 | -145.81 | -118.893 | -89.604 | -60.107 | -32.961 | -11.118 |
| 6.079999999999892 | -186.098 | -168.828 | -146.029 | -119.079 | -89.752 | -60.215 | -33.028 | -11.147 |
| 6.084999999999892 | -186.365 | -169.074 | -146.248 | -119.265 | -89.901 | -60.323 | -33.096 | -11.176 |
| 6.089999999999892 | -186.632 | -169.321 | -146.467 | -119.451 | -90.049 | -60.432 | -33.164 | -11.205 |
| 6.094999999999892 | -186.899 | -169.568 | -146.686 | -119.637 | -90.198 | -60.54 | -33.232 | -11.234 |
| 6.099999999999892 | -187.166 | -169.814 | -146.906 | -119.824 | -90.347 | -60.649 | -33.3 | -11.263 |
| 6.104999999999892 | -187.433 | -170.061 | -147.126 | -120.01 | -90.496 | -60.758 | -33.367 | -11.292 |
| 6.109999999999892 | -187.701 | -170.309 | -147.345 | -120.197 | -90.645 | -60.866 | -33.436 | -11.322 |
| 6.114999999999892 | -187.969 | -170.556 | -147.566 | -120.384 | -90.794 | -60.975 | -33.504 | -11.351 |
| 6.119999999999892 | -188.236 | -170.804 | -147.786 | -120.571 | -90.943 | -61.084 | -33.572 | -11.38 |
| 6.124999999999892 | -188.505 | -171.051 | -148.006 | -120.758 | -91.093 | -61.193 | -33.64 | -11.409 |
| 6.129999999999892 | -188.773 | -171.299 | -148.227 | -120.945 | -91.242 | -61.303 | -33.708 | -11.439 |
| 6.134999999999891 | -189.041 | -171.547 | -148.447 | -121.132 | -91.392 | -61.412 | -33.777 | -11.468 |
| 6.139999999999891 | -189.31 | -171.796 | -148.668 | -121.32 | -91.542 | -61.521 | -33.845 | -11.498 |
| 6.144999999999891 | -189.579 | -172.044 | -148.889 | -121.508 | -91.692 | -61.631 | -33.914 | -11.527 |
| 6.149999999999891 | -189.848 | -172.293 | -149.11 | -121.696 | -91.842 | -61.741 | -33.982 | -11.557 |
| 6.154999999999891 | -190.117 | -172.542 | -149.332 | -121.884 | -91.992 | -61.85 | -34.051 | -11.586 |
| 6.159999999999891 | -190.387 | -172.791 | -149.553 | -122.072 | -92.142 | -61.96 | -34.12 | -11.616 |
| 6.164999999999891 | -190.656 | -173.04 | -149.775 | -122.26 | -92.293 | -62.07 | -34.189 | -11.645 |
| 6.169999999999891 | -190.926 | -173.289 | -149.997 | -122.449 | -92.443 | -62.18 | -34.258 | -11.675 |
| 6.174999999999891 | -191.196 | -173.539 | -150.219 | -122.637 | -92.594 | -62.29 | -34.327 | -11.705 |
| 6.17999999999989 | -191.467 | -173.789 | -150.441 | -122.826 | -92.745 | -62.4 | -34.396 | -11.734 |
| 6.18499999999989 | -191.737 | -174.039 | -150.664 | -123.015 | -92.896 | -62.511 | -34.465 | -11.764 |
| 6.18999999999989 | -192.008 | -174.289 | -150.886 | -123.204 | -93.047 | -62.621 | -34.534 | -11.794 |
| 6.19499999999989 | -192.278 | -174.539 | -151.109 | -123.393 | -93.198 | -62.732 | -34.603 | -11.824 |
| 6.19999999999989 | -192.549 | -174.79 | -151.332 | -123.582 | -93.349 | -62.842 | -34.673 | -11.854 |
| 6.20499999999989 | -192.821 | -175.04 | -151.555 | -123.772 | -93.501 | -62.953 | -34.742 | -11.883 |
| 6.20999999999989 | -193.092 | -175.291 | -151.778 | -123.962 | -93.653 | -63.064 | -34.812 | -11.913 |
| 6.21499999999989 | -193.364 | -175.542 | -152.002 | -124.151 | -93.804 | -63.175 | -34.881 | -11.943 |
| 6.21999999999989 | -193.635 | -175.793 | -152.225 | -124.341 | -93.956 | -63.286 | -34.951 | -11.973 |
| 6.224999999999889 | -193.907 | -176.045 | -152.449 | -124.532 | -94.108 | -63.397 | -35.02 | -12.003 |
| 6.22999999999989 | -194.179 | -176.296 | -152.673 | -124.722 | -94.26 | -63.508 | -35.09 | -12.034 |
| 6.23499999999989 | -194.452 | -176.548 | -152.897 | -124.912 | -94.412 | -63.62 | -35.16 | -12.064 |
| 6.23999999999989 | -194.724 | -176.8 | -153.121 | -125.103 | -94.565 | -63.731 | -35.23 | -12.094 |
| 6.24499999999989 | -194.997 | -177.052 | -153.345 | -125.294 | -94.717 | -63.843 | -35.3 | -12.124 |
| 6.249999999999888 | -195.27 | -177.304 | -153.57 | -125.484 | -94.87 | -63.954 | -35.37 | -12.154 |
| 6.254999999999889 | -195.543 | -177.557 | -153.795 | -125.675 | -95.023 | -64.066 | -35.44 | -12.185 |
| 6.259999999999888 | -195.816 | -177.81 | -154.02 | -125.867 | -95.176 | -64.178 | -35.51 | -12.215 |
| 6.264999999999889 | -196.09 | -178.062 | -154.245 | -126.058 | -95.329 | -64.29 | -35.581 | -12.245 |
| 6.269999999999888 | -196.364 | -178.315 | -154.47 | -126.249 | -95.482 | -64.402 | -35.651 | -12.276 |
| 6.274999999999888 | -196.637 | -178.569 | -154.695 | -126.441 | -95.635 | -64.514 | -35.721 | -12.306 |
| 6.279999999999888 | -196.912 | -178.822 | -154.921 | -126.633 | -95.788 | -64.626 | -35.792 | -12.337 |
| 6.284999999999888 | -197.186 | -179.076 | -155.147 | -126.825 | -95.942 | -64.739 | -35.862 | -12.367 |
| 6.289999999999888 | -197.46 | -179.329 | -155.373 | -127.017 | -96.096 | -64.851 | -35.933 | -12.398 |
| 6.294999999999888 | -197.735 | -179.583 | -155.599 | -127.209 | -96.249 | -64.964 | -36.004 | -12.428 |
| 6.299999999999887 | -198.01 | -179.837 | -155.825 | -127.401 | -96.403 | -65.077 | -36.075 | -12.459 |
| 6.304999999999888 | -198.285 | -180.092 | -156.051 | -127.594 | -96.557 | -65.189 | -36.145 | -12.49 |
| 6.309999999999887 | -198.56 | -180.346 | -156.278 | -127.786 | -96.712 | -65.302 | -36.216 | -12.52 |
| 6.314999999999888 | -198.835 | -180.601 | -156.505 | -127.979 | -96.866 | -65.415 | -36.287 | -12.551 |
| 6.319999999999887 | -199.111 | -180.856 | -156.732 | -128.172 | -97.02 | -65.528 | -36.358 | -12.582 |
| 6.324999999999887 | -199.387 | -181.111 | -156.959 | -128.365 | -97.175 | -65.642 | -36.43 | -12.613 |
| 6.329999999999887 | -199.663 | -181.366 | -157.186 | -128.559 | -97.33 | -65.755 | -36.501 | -12.644 |
| 6.334999999999887 | -199.939 | -181.621 | -157.413 | -128.752 | -97.484 | -65.868 | -36.572 | -12.675 |
| 6.339999999999887 | -200.215 | -181.877 | -157.641 | -128.946 | -97.639 | -65.982 | -36.643 | -12.705 |
| 6.344999999999887 | -200.492 | -182.133 | -157.869 | -129.139 | -97.794 | -66.095 | -36.715 | -12.736 |
| 6.349999999999886 | -200.769 | -182.389 | -158.097 | -129.333 | -97.95 | -66.209 | -36.786 | -12.767 |
| 6.354999999999887 | -201.046 | -182.645 | -158.325 | -129.527 | -98.105 | -66.323 | -36.858 | -12.798 |
| 6.359999999999886 | -201.323 | -182.901 | -158.553 | -129.721 | -98.26 | -66.437 | -36.93 | -12.83 |
| 6.364999999999886 | -201.6 | -183.158 | -158.782 | -129.916 | -98.416 | -66.551 | -37.001 | -12.861 |
| 6.369999999999886 | -201.878 | -183.414 | -159.01 | -130.11 | -98.572 | -66.665 | -37.073 | -12.892 |
| 6.374999999999886 | -202.155 | -183.671 | -159.239 | -130.305 | -98.727 | -66.779 | -37.145 | -12.923 |
| 6.379999999999886 | -202.433 | -183.928 | -159.468 | -130.499 | -98.883 | -66.893 | -37.217 | -12.954 |
| 6.384999999999886 | -202.711 | -184.185 | -159.697 | -130.694 | -99.039 | -67.008 | -37.289 | -12.986 |
| 6.389999999999885 | -202.99 | -184.443 | -159.926 | -130.889 | -99.196 | -67.122 | -37.361 | -13.017 |
| 6.394999999999886 | -203.268 | -184.7 | -160.156 | -131.085 | -99.352 | -67.237 | -37.433 | -13.048 |
| 6.399999999999885 | -203.547 | -184.958 | -160.385 | -131.28 | -99.508 | -67.352 | -37.505 | -13.08 |
| 6.404999999999885 | -203.826 | -185.216 | -160.615 | -131.476 | -99.665 | -67.467 | -37.578 | -13.111 |
| 6.409999999999885 | -204.105 | -185.474 | -160.845 | -131.671 | -99.822 | -67.581 | -37.65 | -13.143 |
| 6.414999999999885 | -204.384 | -185.732 | -161.075 | -131.867 | -99.979 | -67.696 | -37.722 | -13.174 |
| 6.419999999999885 | -204.664 | -185.991 | -161.305 | -132.063 | -100.136 | -67.812 | -37.795 | -13.206 |
| 6.424999999999885 | -204.943 | -186.25 | -161.536 | -132.259 | -100.293 | -67.927 | -37.867 | -13.237 |
| 6.429999999999885 | -205.223 | -186.508 | -161.766 | -132.455 | -100.45 | -68.042 | -37.94 | -13.269 |
| 6.434999999999885 | -205.503 | -186.768 | -161.997 | -132.652 | -100.607 | -68.158 | -38.013 | -13.301 |
| 6.439999999999884 | -205.783 | -187.027 | -162.228 | -132.848 | -100.765 | -68.273 | -38.086 | -13.332 |
| 6.444999999999884 | -206.064 | -187.286 | -162.459 | -133.045 | -100.922 | -68.389 | -38.158 | -13.364 |
| 6.449999999999884 | -206.344 | -187.546 | -162.691 | -133.242 | -101.08 | -68.505 | -38.231 | -13.396 |
| 6.454999999999884 | -206.625 | -187.805 | -162.922 | -133.439 | -101.238 | -68.62 | -38.304 | -13.428 |
| 6.459999999999884 | -206.906 | -188.065 | -163.154 | -133.636 | -101.396 | -68.736 | -38.378 | -13.459 |
| 6.464999999999884 | -207.187 | -188.326 | -163.386 | -133.833 | -101.554 | -68.852 | -38.451 | -13.491 |
| 6.469999999999884 | -207.469 | -188.586 | -163.617 | -134.031 | -101.713 | -68.969 | -38.524 | -13.523 |
| 6.474999999999884 | -207.75 | -188.846 | -163.85 | -134.228 | -101.871 | -69.085 | -38.597 | -13.555 |
| 6.479999999999884 | -208.032 | -189.107 | -164.082 | -134.426 | -102.029 | -69.201 | -38.671 | -13.587 |
| 6.484999999999884 | -208.314 | -189.368 | -164.314 | -134.624 | -102.188 | -69.318 | -38.744 | -13.619 |
| 6.489999999999883 | -208.596 | -189.629 | -164.547 | -134.822 | -102.347 | -69.434 | -38.818 | -13.651 |
| 6.494999999999884 | -208.878 | -189.89 | -164.78 | -135.02 | -102.506 | -69.551 | -38.891 | -13.683 |
| 6.499999999999883 | -209.161 | -190.152 | -165.013 | -135.219 | -102.665 | -69.668 | -38.965 | -13.716 |
| 6.504999999999884 | -209.444 | -190.413 | -165.246 | -135.417 | -102.824 | -69.784 | -39.039 | -13.748 |
| 6.509999999999883 | -209.726 | -190.675 | -165.479 | -135.616 | -102.983 | -69.901 | -39.112 | -13.78 |
| 6.514999999999883 | -210.01 | -190.937 | -165.713 | -135.815 | -103.143 | -70.018 | -39.186 | -13.812 |
| 6.519999999999883 | -210.293 | -191.199 | -165.946 | -136.014 | -103.302 | -70.136 | -39.26 | -13.845 |
| 6.524999999999883 | -210.576 | -191.461 | -166.18 | -136.213 | -103.462 | -70.253 | -39.334 | -13.877 |
| 6.529999999999883 | -210.86 | -191.724 | -166.414 | -136.412 | -103.622 | -70.37 | -39.408 | -13.909 |
| 6.534999999999883 | -211.144 | -191.986 | -166.648 | -136.611 | -103.782 | -70.488 | -39.482 | -13.942 |
| 6.539999999999882 | -211.428 | -192.249 | -166.883 | -136.811 | -103.942 | -70.605 | -39.557 | -13.974 |
| 6.544999999999883 | -211.712 | -192.512 | -167.117 | -137.011 | -104.102 | -70.723 | -39.631 | -14.007 |
| 6.549999999999882 | -211.997 | -192.776 | -167.352 | -137.211 | -104.262 | -70.841 | -39.705 | -14.039 |
| 6.554999999999882 | -212.281 | -193.039 | -167.587 | -137.411 | -104.423 | -70.959 | -39.78 | -14.072 |
| 6.559999999999882 | -212.566 | -193.303 | -167.822 | -137.611 | -104.583 | -71.077 | -39.854 | -14.104 |
| 6.564999999999882 | -212.851 | -193.566 | -168.057 | -137.811 | -104.744 | -71.195 | -39.929 | -14.137 |
| 6.569999999999882 | -213.136 | -193.83 | -168.292 | -138.012 | -104.905 | -71.313 | -40.004 | -14.17 |
| 6.574999999999882 | -213.422 | -194.094 | -168.528 | -138.212 | -105.066 | -71.431 | -40.078 | -14.202 |
| 6.579999999999881 | -213.707 | -194.359 | -168.763 | -138.413 | -105.227 | -71.55 | -40.153 | -14.235 |
| 6.584999999999882 | -213.993 | -194.623 | -168.999 | -138.614 | -105.388 | -71.668 | -40.228 | -14.268 |
| 6.589999999999881 | -214.279 | -194.888 | -169.235 | -138.815 | -105.549 | -71.787 | -40.303 | -14.301 |
| 6.594999999999882 | -214.565 | -195.153 | -169.471 | -139.016 | -105.711 | -71.905 | -40.378 | -14.334 |
| 6.599999999999881 | -214.852 | -195.418 | -169.708 | -139.217 | -105.872 | -72.024 | -40.453 | -14.367 |
| 6.604999999999881 | -215.138 | -195.683 | -169.944 | -139.419 | -106.034 | -72.143 | -40.528 | -14.4 |
| 6.609999999999881 | -215.425 | -195.948 | -170.181 | -139.621 | -106.196 | -72.262 | -40.604 | -14.433 |
| 6.614999999999881 | -215.712 | -196.214 | -170.418 | -139.822 | -106.358 | -72.381 | -40.679 | -14.466 |
| 6.619999999999881 | -215.999 | -196.48 | -170.655 | -140.024 | -106.52 | -72.5 | -40.754 | -14.499 |
| 6.624999999999881 | -216.286 | -196.746 | -170.892 | -140.227 | -106.682 | -72.62 | -40.83 | -14.532 |
| 6.629999999999881 | -216.574 | -197.012 | -171.129 | -140.429 | -106.845 | -72.739 | -40.905 | -14.565 |
| 6.634999999999881 | -216.861 | -197.278 | -171.367 | -140.631 | -107.007 | -72.859 | -40.981 | -14.598 |
| 6.63999999999988 | -217.149 | -197.545 | -171.604 | -140.834 | -107.17 | -72.978 | -41.057 | -14.631 |
| 6.64499999999988 | -217.437 | -197.811 | -171.842 | -141.037 | -107.332 | -73.098 | -41.132 | -14.665 |
| 6.64999999999988 | -217.726 | -198.078 | -172.08 | -141.239 | -107.495 | -73.218 | -41.208 | -14.698 |
| 6.65499999999988 | -218.014 | -198.345 | -172.318 | -141.442 | -107.658 | -73.338 | -41.284 | -14.731 |
| 6.65999999999988 | -218.303 | -198.613 | -172.557 | -141.646 | -107.821 | -73.458 | -41.36 | -14.765 |
| 6.66499999999988 | -218.592 | -198.88 | -172.795 | -141.849 | -107.985 | -73.578 | -41.436 | -14.798 |
| 6.66999999999988 | -218.881 | -199.148 | -173.034 | -142.052 | -108.148 | -73.698 | -41.512 | -14.831 |
| 6.67499999999988 | -219.17 | -199.415 | -173.273 | -142.256 | -108.312 | -73.818 | -41.588 | -14.865 |
| 6.67999999999988 | -219.459 | -199.683 | -173.512 | -142.46 | -108.475 | -73.939 | -41.665 | -14.898 |
| 6.68499999999988 | -219.749 | -199.951 | -173.751 | -142.664 | -108.639 | -74.059 | -41.741 | -14.932 |
| 6.68999999999988 | -220.039 | -200.22 | -173.99 | -142.868 | -108.803 | -74.18 | -41.817 | -14.966 |
| 6.694999999999879 | -220.329 | -200.488 | -174.23 | -143.072 | -108.967 | -74.301 | -41.894 | -14.999 |
| 6.69999999999988 | -220.619 | -200.757 | -174.469 | -143.276 | -109.131 | -74.422 | -41.97 | -15.033 |
| 6.70499999999988 | -220.909 | -201.026 | -174.709 | -143.481 | -109.295 | -74.543 | -42.047 | -15.067 |
| 6.70999999999988 | -221.2 | -201.295 | -174.949 | -143.685 | -109.46 | -74.664 | -42.124 | -15.1 |
| 6.714999999999879 | -221.491 | -201.564 | -175.19 | -143.89 | -109.624 | -74.785 | -42.2 | -15.134 |
| 6.719999999999878 | -221.782 | -201.833 | -175.43 | -144.095 | -109.789 | -74.906 | -42.277 | -15.168 |
| 6.724999999999879 | -222.073 | -202.103 | -175.67 | -144.3 | -109.954 | -75.027 | -42.354 | -15.202 |
| 6.729999999999878 | -222.364 | -202.373 | -175.911 | -144.506 | -110.119 | -75.149 | -42.431 | -15.236 |
| 6.734999999999878 | -222.656 | -202.643 | -176.152 | -144.711 | -110.284 | -75.27 | -42.508 | -15.27 |
| 6.739999999999878 | -222.948 | -202.913 | -176.393 | -144.917 | -110.449 | -75.392 | -42.585 | -15.304 |
| 6.744999999999878 | -223.239 | -203.183 | -176.634 | -145.122 | -110.614 | -75.514 | -42.662 | -15.338 |
| 6.749999999999878 | -223.532 | -203.454 | -176.876 | -145.328 | -110.78 | -75.636 | -42.74 | -15.372 |
| 6.754999999999878 | -223.824 | -203.724 | -177.117 | -145.534 | -110.945 | -75.758 | -42.817 | -15.406 |
| 6.759999999999878 | -224.116 | -203.995 | -177.359 | -145.74 | -111.111 | -75.88 | -42.894 | -15.44 |
| 6.764999999999878 | -224.409 | -204.266 | -177.601 | -145.947 | -111.277 | -76.002 | -42.972 | -15.474 |
| 6.769999999999877 | -224.702 | -204.538 | -177.843 | -146.153 | -111.443 | -76.124 | -43.049 | -15.508 |
| 6.774999999999877 | -224.995 | -204.809 | -178.085 | -146.36 | -111.609 | -76.247 | -43.127 | -15.543 |
| 6.779999999999877 | -225.288 | -205.081 | -178.327 | -146.566 | -111.775 | -76.369 | -43.205 | -15.577 |
| 6.784999999999877 | -225.582 | -205.352 | -178.57 | -146.773 | -111.941 | -76.492 | -43.282 | -15.611 |
| 6.789999999999877 | -225.875 | -205.624 | -178.813 | -146.98 | -112.108 | -76.614 | -43.36 | -15.646 |
| 6.794999999999877 | -226.169 | -205.896 | -179.056 | -147.188 | -112.274 | -76.737 | -43.438 | -15.68 |
| 6.799999999999877 | -226.463 | -206.169 | -179.299 | -147.395 | -112.441 | -76.86 | -43.516 | -15.714 |
| 6.804999999999877 | -226.758 | -206.441 | -179.542 | -147.603 | -112.608 | -76.983 | -43.594 | -15.749 |
| 6.809999999999876 | -227.052 | -206.714 | -179.785 | -147.81 | -112.775 | -77.106 | -43.672 | -15.783 |
| 6.814999999999877 | -227.347 | -206.987 | -180.029 | -148.018 | -112.942 | -77.229 | -43.751 | -15.818 |
| 6.819999999999876 | -227.641 | -207.26 | -180.272 | -148.226 | -113.109 | -77.353 | -43.829 | -15.852 |
| 6.824999999999877 | -227.936 | -207.533 | -180.516 | -148.434 | -113.276 | -77.476 | -43.907 | -15.887 |
| 6.829999999999876 | -228.232 | -207.807 | -180.76 | -148.642 | -113.444 | -77.599 | -43.986 | -15.922 |
| 6.834999999999876 | -228.527 | -208.08 | -181.005 | -148.851 | -113.612 | -77.723 | -44.064 | -15.956 |
| 6.839999999999876 | -228.823 | -208.354 | -181.249 | -149.059 | -113.779 | -77.847 | -44.143 | -15.991 |
| 6.844999999999876 | -229.118 | -208.628 | -181.494 | -149.268 | -113.947 | -77.97 | -44.221 | -16.026 |
| 6.849999999999876 | -229.414 | -208.902 | -181.738 | -149.477 | -114.115 | -78.094 | -44.3 | -16.061 |
| 6.854999999999876 | -229.71 | -209.176 | -181.983 | -149.686 | -114.283 | -78.218 | -44.379 | -16.096 |
| 6.859999999999875 | -230.007 | -209.451 | -182.228 | -149.895 | -114.451 | -78.343 | -44.458 | -16.131 |
| 6.864999999999876 | -230.303 | -209.726 | -182.474 | -150.104 | -114.62 | -78.467 | -44.536 | -16.165 |
| 6.869999999999875 | -230.6 | -210 | -182.719 | -150.314 | -114.788 | -78.591 | -44.615 | -16.2 |
| 6.874999999999875 | -230.897 | -210.275 | -182.964 | -150.523 | -114.957 | -78.715 | -44.694 | -16.235 |
| 6.879999999999875 | -231.194 | -210.551 | -183.21 | -150.733 | -115.126 | -78.84 | -44.774 | -16.27 |
| 6.884999999999875 | -231.491 | -210.826 | -183.456 | -150.943 | -115.295 | -78.965 | -44.853 | -16.306 |
| 6.889999999999875 | -231.789 | -211.102 | -183.702 | -151.153 | -115.464 | -79.089 | -44.932 | -16.341 |
| 6.894999999999875 | -232.087 | -211.377 | -183.948 | -151.363 | -115.633 | -79.214 | -45.011 | -16.376 |
| 6.899999999999875 | -232.384 | -211.653 | -184.195 | -151.574 | -115.802 | -79.339 | -45.091 | -16.411 |
| 6.904999999999874 | -232.683 | -211.93 | -184.441 | -151.784 | -115.971 | -79.464 | -45.17 | -16.446 |
| 6.909999999999874 | -232.981 | -212.206 | -184.688 | -151.995 | -116.141 | -79.589 | -45.25 | -16.482 |
| 6.914999999999874 | -233.279 | -212.482 | -184.935 | -152.206 | -116.311 | -79.714 | -45.33 | -16.517 |
| 6.919999999999874 | -233.578 | -212.759 | -185.182 | -152.417 | -116.48 | -79.84 | -45.409 | -16.552 |
| 6.924999999999874 | -233.877 | -213.036 | -185.429 | -152.628 | -116.65 | -79.965 | -45.489 | -16.588 |
| 6.929999999999874 | -234.176 | -213.313 | -185.677 | -152.839 | -116.82 | -80.091 | -45.569 | -16.623 |
| 6.934999999999874 | -234.475 | -213.59 | -185.924 | -153.05 | -116.991 | -80.216 | -45.649 | -16.658 |
| 6.939999999999874 | -234.774 | -213.868 | -186.172 | -153.262 | -117.161 | -80.342 | -45.729 | -16.694 |
| 6.944999999999874 | -235.074 | -214.145 | -186.42 | -153.474 | -117.331 | -80.468 | -45.809 | -16.729 |
| 6.949999999999874 | -235.374 | -214.423 | -186.668 | -153.686 | -117.502 | -80.594 | -45.889 | -16.765 |
| 6.954999999999874 | -235.674 | -214.701 | -186.916 | -153.898 | -117.673 | -80.72 | -45.969 | -16.801 |
| 6.959999999999873 | -235.974 | -214.979 | -187.165 | -154.11 | -117.843 | -80.846 | -46.05 | -16.836 |
| 6.964999999999874 | -236.274 | -215.258 | -187.414 | -154.322 | -118.014 | -80.972 | -46.13 | -16.872 |
| 6.969999999999873 | -236.575 | -215.536 | -187.662 | -154.535 | -118.185 | -81.099 | -46.21 | -16.908 |
| 6.974999999999873 | -236.876 | -215.815 | -187.911 | -154.747 | -118.357 | -81.225 | -46.291 | -16.944 |
| 6.979999999999873 | -237.177 | -216.094 | -188.16 | -154.96 | -118.528 | -81.352 | -46.371 | -16.979 |
| 6.984999999999873 | -237.478 | -216.373 | -188.41 | -155.173 | -118.699 | -81.478 | -46.452 | -17.015 |
| 6.989999999999873 | -237.779 | -216.652 | -188.659 | -155.386 | -118.871 | -81.605 | -46.533 | -17.051 |
| 6.994999999999873 | -238.081 | -216.931 | -188.909 | -155.599 | -119.043 | -81.732 | -46.614 | -17.087 |
| 6.999999999999872 | -238.382 | -217.211 | -189.158 | -155.812 | -119.214 | -81.859 | -46.694 | -17.123 |
| 7.004999999999873 | -238.684 | -217.491 | -189.408 | -156.026 | -119.386 | -81.986 | -46.775 | -17.159 |
| 7.009999999999872 | -238.986 | -217.771 | -189.658 | -156.24 | -119.558 | -82.113 | -46.856 | -17.195 |
| 7.014999999999873 | -239.289 | -218.051 | -189.909 | -156.453 | -119.731 | -82.24 | -46.937 | -17.231 |
| 7.019999999999872 | -239.591 | -218.331 | -190.159 | -156.667 | -119.903 | -82.368 | -47.019 | -17.267 |
| 7.024999999999872 | -239.894 | -218.612 | -190.41 | -156.882 | -120.075 | -82.495 | -47.1 | -17.303 |
| 7.029999999999872 | -240.197 | -218.892 | -190.661 | -157.096 | -120.248 | -82.623 | -47.181 | -17.339 |
| 7.034999999999872 | -240.5 | -219.173 | -190.912 | -157.31 | -120.421 | -82.75 | -47.262 | -17.376 |
| 7.039999999999872 | -240.803 | -219.454 | -191.163 | -157.525 | -120.594 | -82.878 | -47.344 | -17.412 |
| 7.044999999999872 | -241.107 | -219.736 | -191.414 | -157.74 | -120.767 | -83.006 | -47.425 | -17.448 |
| 7.049999999999871 | -241.41 | -220.017 | -191.665 | -157.954 | -120.94 | -83.134 | -47.507 | -17.485 |
| 7.054999999999872 | -241.714 | -220.299 | -191.917 | -158.169 | -121.113 | -83.262 | -47.589 | -17.521 |
| 7.059999999999871 | -242.018 | -220.58 | -192.169 | -158.385 | -121.286 | -83.39 | -47.67 | -17.557 |
| 7.064999999999872 | -242.322 | -220.862 | -192.421 | -158.6 | -121.46 | -83.519 | -47.752 | -17.594 |
| 7.069999999999871 | -242.627 | -221.144 | -192.673 | -158.815 | -121.633 | -83.647 | -47.834 | -17.63 |
| 7.074999999999871 | -242.931 | -221.427 | -192.925 | -159.031 | -121.807 | -83.776 | -47.916 | -17.667 |
| 7.07999999999987 | -243.236 | -221.709 | -193.178 | -159.247 | -121.981 | -83.904 | -47.998 | -17.703 |
| 7.084999999999871 | -243.541 | -221.992 | -193.43 | -159.463 | -122.155 | -84.033 | -48.08 | -17.74 |
| 7.08999999999987 | -243.846 | -222.275 | -193.683 | -159.679 | -122.329 | -84.162 | -48.162 | -17.777 |
| 7.094999999999871 | -244.152 | -222.558 | -193.936 | -159.895 | -122.504 | -84.291 | -48.244 | -17.813 |
| 7.09999999999987 | -244.457 | -222.841 | -194.189 | -160.111 | -122.678 | -84.42 | -48.327 | -17.85 |
| 7.104999999999871 | -244.763 | -223.125 | -194.442 | -160.328 | -122.852 | -84.549 | -48.409 | -17.887 |
| 7.10999999999987 | -245.069 | -223.408 | -194.696 | -160.544 | -123.027 | -84.678 | -48.492 | -17.924 |
| 7.114999999999871 | -245.375 | -223.692 | -194.95 | -160.761 | -123.202 | -84.807 | -48.574 | -17.96 |
| 7.11999999999987 | -245.681 | -223.976 | -195.203 | -160.978 | -123.377 | -84.937 | -48.657 | -17.997 |
| 7.12499999999987 | -245.988 | -224.26 | -195.457 | -161.195 | -123.552 | -85.066 | -48.739 | -18.034 |
| 7.12999999999987 | -246.295 | -224.544 | -195.711 | -161.413 | -123.727 | -85.196 | -48.822 | -18.071 |
| 7.13499999999987 | -246.601 | -224.829 | -195.966 | -161.63 | -123.902 | -85.325 | -48.905 | -18.108 |
| 7.13999999999987 | -246.909 | -225.114 | -196.22 | -161.848 | -124.078 | -85.455 | -48.988 | -18.145 |
| 7.14499999999987 | -247.216 | -225.399 | -196.475 | -162.065 | -124.253 | -85.585 | -49.071 | -18.182 |
| 7.14999999999987 | -247.523 | -225.684 | -196.73 | -162.283 | -124.429 | -85.715 | -49.154 | -18.219 |
| 7.15499999999987 | -247.831 | -225.969 | -196.985 | -162.501 | -124.605 | -85.845 | -49.237 | -18.256 |
| 7.15999999999987 | -248.139 | -226.254 | -197.24 | -162.719 | -124.781 | -85.976 | -49.32 | -18.294 |
| 7.164999999999869 | -248.447 | -226.54 | -197.495 | -162.938 | -124.957 | -86.106 | -49.403 | -18.331 |
| 7.16999999999987 | -248.755 | -226.826 | -197.751 | -163.156 | -125.133 | -86.236 | -49.486 | -18.368 |
| 7.17499999999987 | -249.064 | -227.112 | -198.006 | -163.375 | -125.309 | -86.367 | -49.57 | -18.405 |
| 7.17999999999987 | -249.372 | -227.398 | -198.262 | -163.593 | -125.486 | -86.497 | -49.653 | -18.443 |
| 7.18499999999987 | -249.681 | -227.684 | -198.518 | -163.812 | -125.662 | -86.628 | -49.737 | -18.48 |
| 7.189999999999868 | -249.99 | -227.971 | -198.774 | -164.031 | -125.839 | -86.759 | -49.82 | -18.517 |
| 7.194999999999869 | -250.299 | -228.257 | -199.031 | -164.251 | -126.016 | -86.89 | -49.904 | -18.555 |
| 7.199999999999868 | -250.609 | -228.544 | -199.287 | -164.47 | -126.193 | -87.021 | -49.988 | -18.592 |
| 7.204999999999868 | -250.918 | -228.831 | -199.544 | -164.69 | -126.37 | -87.152 | -50.072 | -18.63 |
| 7.209999999999868 | -251.228 | -229.119 | -199.801 | -164.909 | -126.547 | -87.283 | -50.156 | -18.667 |
| 7.214999999999868 | -251.538 | -229.406 | -200.058 | -165.129 | -126.724 | -87.415 | -50.239 | -18.705 |
| 7.219999999999868 | -251.848 | -229.694 | -200.315 | -165.349 | -126.902 | -87.546 | -50.324 | -18.743 |
| 7.224999999999868 | -252.159 | -229.981 | -200.572 | -165.569 | -127.079 | -87.678 | -50.408 | -18.78 |
| 7.229999999999868 | -252.469 | -230.269 | -200.83 | -165.789 | -127.257 | -87.809 | -50.492 | -18.818 |
| 7.234999999999867 | -252.78 | -230.558 | -201.087 | -166.01 | -127.435 | -87.941 | -50.576 | -18.856 |
| 7.239999999999867 | -253.091 | -230.846 | -201.345 | -166.23 | -127.613 | -88.073 | -50.66 | -18.893 |
| 7.244999999999867 | -253.402 | -231.134 | -201.603 | -166.451 | -127.791 | -88.205 | -50.745 | -18.931 |
| 7.249999999999867 | -253.713 | -231.423 | -201.861 | -166.672 | -127.969 | -88.337 | -50.829 | -18.969 |
| 7.254999999999867 | -254.025 | -231.712 | -202.12 | -166.893 | -128.148 | -88.469 | -50.914 | -19.007 |
| 7.259999999999867 | -254.336 | -232.001 | -202.378 | -167.114 | -128.326 | -88.602 | -50.998 | -19.045 |
| 7.264999999999867 | -254.648 | -232.29 | -202.637 | -167.335 | -128.505 | -88.734 | -51.083 | -19.083 |
| 7.269999999999867 | -254.96 | -232.58 | -202.896 | -167.557 | -128.683 | -88.866 | -51.168 | -19.121 |
| 7.274999999999867 | -255.273 | -232.869 | -203.155 | -167.778 | -128.862 | -88.999 | -51.253 | -19.159 |
| 7.279999999999867 | -255.585 | -233.159 | -203.414 | -168 | -129.041 | -89.132 | -51.337 | -19.197 |
| 7.284999999999866 | -255.898 | -233.449 | -203.673 | -168.222 | -129.22 | -89.264 | -51.422 | -19.235 |
| 7.289999999999866 | -256.211 | -233.739 | -203.933 | -168.444 | -129.4 | -89.397 | -51.507 | -19.273 |
| 7.294999999999866 | -256.524 | -234.03 | -204.192 | -168.666 | -129.579 | -89.53 | -51.593 | -19.311 |
| 7.299999999999866 | -256.837 | -234.32 | -204.452 | -168.889 | -129.759 | -89.663 | -51.678 | -19.35 |
| 7.304999999999866 | -257.15 | -234.611 | -204.712 | -169.111 | -129.938 | -89.796 | -51.763 | -19.388 |
| 7.309999999999866 | -257.464 | -234.902 | -204.972 | -169.334 | -130.118 | -89.93 | -51.848 | -19.426 |
| 7.314999999999866 | -257.778 | -235.193 | -205.233 | -169.557 | -130.298 | -90.063 | -51.934 | -19.465 |
| 7.319999999999866 | -258.092 | -235.484 | -205.493 | -169.78 | -130.478 | -90.197 | -52.019 | -19.503 |
| 7.324999999999866 | -258.406 | -235.775 | -205.754 | -170.003 | -130.658 | -90.33 | -52.105 | -19.541 |
| 7.329999999999865 | -258.72 | -236.067 | -206.015 | -170.226 | -130.838 | -90.464 | -52.19 | -19.58 |
| 7.334999999999865 | -259.035 | -236.359 | -206.276 | -170.449 | -131.019 | -90.598 | -52.276 | -19.618 |
| 7.339999999999865 | -259.35 | -236.651 | -206.537 | -170.673 | -131.199 | -90.732 | -52.362 | -19.657 |
| 7.344999999999865 | -259.665 | -236.943 | -206.798 | -170.897 | -131.38 | -90.866 | -52.448 | -19.696 |
| 7.349999999999865 | -259.98 | -237.235 | -207.06 | -171.121 | -131.561 | -91 | -52.534 | -19.734 |
| 7.354999999999865 | -260.295 | -237.528 | -207.322 | -171.345 | -131.742 | -91.134 | -52.619 | -19.773 |
| 7.359999999999865 | -260.611 | -237.821 | -207.583 | -171.569 | -131.923 | -91.268 | -52.706 | -19.811 |
| 7.364999999999865 | -260.927 | -238.113 | -207.846 | -171.793 | -132.104 | -91.403 | -52.792 | -19.85 |
| 7.369999999999865 | -261.242 | -238.407 | -208.108 | -172.018 | -132.285 | -91.537 | -52.878 | -19.889 |
| 7.374999999999864 | -261.559 | -238.7 | -208.37 | -172.242 | -132.467 | -91.672 | -52.964 | -19.928 |
| 7.379999999999864 | -261.875 | -238.993 | -208.633 | -172.467 | -132.648 | -91.807 | -53.05 | -19.967 |
| 7.384999999999864 | -262.191 | -239.287 | -208.895 | -172.692 | -132.83 | -91.941 | -53.137 | -20.006 |
| 7.389999999999864 | -262.508 | -239.581 | -209.158 | -172.917 | -133.012 | -92.076 | -53.223 | -20.044 |
| 7.394999999999864 | -262.825 | -239.875 | -209.421 | -173.142 | -133.194 | -92.211 | -53.31 | -20.083 |
| 7.399999999999864 | -263.142 | -240.169 | -209.684 | -173.367 | -133.376 | -92.346 | -53.396 | -20.122 |
| 7.404999999999864 | -263.459 | -240.463 | -209.948 | -173.593 | -133.558 | -92.482 | -53.483 | -20.161 |
| 7.409999999999864 | -263.777 | -240.758 | -210.211 | -173.819 | -133.74 | -92.617 | -53.57 | -20.2 |
| 7.414999999999864 | -264.094 | -241.052 | -210.475 | -174.044 | -133.923 | -92.752 | -53.657 | -20.24 |
| 7.419999999999864 | -264.412 | -241.347 | -210.739 | -174.27 | -134.105 | -92.888 | -53.744 | -20.279 |
| 7.424999999999864 | -264.73 | -241.642 | -211.003 | -174.497 | -134.288 | -93.024 | -53.831 | -20.318 |
| 7.429999999999863 | -265.049 | -241.938 | -211.267 | -174.723 | -134.471 | -93.159 | -53.918 | -20.357 |
| 7.434999999999863 | -265.367 | -242.233 | -211.532 | -174.949 | -134.654 | -93.295 | -54.005 | -20.396 |
| 7.439999999999863 | -265.686 | -242.529 | -211.796 | -175.176 | -134.837 | -93.431 | -54.092 | -20.436 |
| 7.444999999999863 | -266.004 | -242.824 | -212.061 | -175.403 | -135.02 | -93.567 | -54.179 | -20.475 |
| 7.449999999999863 | -266.323 | -243.12 | -212.326 | -175.629 | -135.203 | -93.703 | -54.267 | -20.514 |
| 7.454999999999863 | -266.643 | -243.417 | -212.591 | -175.856 | -135.387 | -93.839 | -54.354 | -20.554 |
| 7.459999999999863 | -266.962 | -243.713 | -212.856 | -176.084 | -135.571 | -93.976 | -54.442 | -20.593 |
| 7.464999999999863 | -267.282 | -244.009 | -213.122 | -176.311 | -135.754 | -94.112 | -54.529 | -20.633 |
| 7.469999999999862 | -267.601 | -244.306 | -213.387 | -176.538 | -135.938 | -94.249 | -54.617 | -20.672 |
| 7.474999999999862 | -267.921 | -244.603 | -213.653 | -176.766 | -136.122 | -94.385 | -54.704 | -20.712 |
| 7.479999999999862 | -268.241 | -244.9 | -213.919 | -176.994 | -136.306 | -94.522 | -54.792 | -20.751 |
| 7.484999999999862 | -268.562 | -245.197 | -214.185 | -177.222 | -136.49 | -94.659 | -54.88 | -20.791 |
| 7.489999999999862 | -268.882 | -245.495 | -214.451 | -177.45 | -136.675 | -94.796 | -54.968 | -20.831 |
| 7.494999999999862 | -269.203 | -245.792 | -214.717 | -177.678 | -136.859 | -94.933 | -55.056 | -20.87 |
| 7.499999999999862 | -269.524 | -246.09 | -214.984 | -177.906 | -137.044 | -95.07 | -55.144 | -20.91 |
| 7.504999999999862 | -269.845 | -246.388 | -215.251 | -178.135 | -137.229 | -95.208 | -55.232 | -20.95 |
| 7.509999999999862 | -270.166 | -246.686 | -215.518 | -178.363 | -137.414 | -95.345 | -55.32 | -20.99 |
| 7.514999999999862 | -270.488 | -246.985 | -215.785 | -178.592 | -137.599 | -95.482 | -55.409 | -21.03 |
| 7.519999999999861 | -270.81 | -247.283 | -216.052 | -178.821 | -137.784 | -95.62 | -55.497 | -21.07 |
| 7.524999999999862 | -271.131 | -247.582 | -216.319 | -179.05 | -137.969 | -95.758 | -55.585 | -21.11 |
| 7.529999999999861 | -271.454 | -247.881 | -216.587 | -179.28 | -138.154 | -95.895 | -55.674 | -21.15 |
| 7.534999999999861 | -271.776 | -248.18 | -216.855 | -179.509 | -138.34 | -96.033 | -55.762 | -21.19 |
| 7.53999999999986 | -272.098 | -248.479 | -217.123 | -179.739 | -138.526 | -96.171 | -55.851 | -21.23 |
| 7.544999999999861 | -272.421 | -248.779 | -217.391 | -179.968 | -138.711 | -96.309 | -55.94 | -21.27 |
| 7.54999999999986 | -272.744 | -249.078 | -217.659 | -180.198 | -138.897 | -96.447 | -56.029 | -21.31 |
| 7.554999999999861 | -273.067 | -249.378 | -217.927 | -180.428 | -139.083 | -96.586 | -56.117 | -21.35 |
| 7.55999999999986 | -273.39 | -249.678 | -218.196 | -180.658 | -139.27 | -96.724 | -56.206 | -21.39 |
| 7.564999999999861 | -273.713 | -249.978 | -218.465 | -180.889 | -139.456 | -96.863 | -56.295 | -21.431 |
| 7.56999999999986 | -274.037 | -250.279 | -218.734 | -181.119 | -139.642 | -97.001 | -56.384 | -21.471 |
| 7.57499999999986 | -274.361 | -250.579 | -219.003 | -181.35 | -139.829 | -97.14 | -56.474 | -21.511 |
| 7.57999999999986 | -274.685 | -250.88 | -219.272 | -181.58 | -140.016 | -97.279 | -56.563 | -21.551 |
| 7.58499999999986 | -275.009 | -251.181 | -219.541 | -181.811 | -140.202 | -97.418 | -56.652 | -21.592 |
| 7.58999999999986 | -275.333 | -251.482 | -219.811 | -182.042 | -140.389 | -97.557 | -56.741 | -21.632 |
| 7.59499999999986 | -275.658 | -251.783 | -220.081 | -182.274 | -140.576 | -97.696 | -56.831 | -21.673 |
| 7.59999999999986 | -275.983 | -252.085 | -220.351 | -182.505 | -140.764 | -97.835 | -56.92 | -21.713 |
| 7.60499999999986 | -276.308 | -252.386 | -220.621 | -182.737 | -140.951 | -97.974 | -57.01 | -21.754 |
| 7.60999999999986 | -276.633 | -252.688 | -220.891 | -182.968 | -141.138 | -98.114 | -57.1 | -21.794 |
| 7.61499999999986 | -276.958 | -252.99 | -221.162 | -183.2 | -141.326 | -98.253 | -57.189 | -21.835 |
| 7.61999999999986 | -277.284 | -253.292 | -221.432 | -183.432 | -141.514 | -98.393 | -57.279 | -21.876 |
| 7.62499999999986 | -277.609 | -253.594 | -221.703 | -183.664 | -141.701 | -98.532 | -57.369 | -21.916 |
| 7.629999999999859 | -277.935 | -253.897 | -221.974 | -183.896 | -141.889 | -98.672 | -57.459 | -21.957 |
| 7.634999999999859 | -278.261 | -254.2 | -222.245 | -184.129 | -142.077 | -98.812 | -57.549 | -21.998 |
| 7.63999999999986 | -278.588 | -254.503 | -222.516 | -184.361 | -142.266 | -98.952 | -57.639 | -22.039 |
| 7.644999999999859 | -278.914 | -254.806 | -222.788 | -184.594 | -142.454 | -99.092 | -57.729 | -22.08 |
| 7.64999999999986 | -279.241 | -255.109 | -223.059 | -184.827 | -142.642 | -99.233 | -57.819 | -22.121 |
| 7.654999999999859 | -279.568 | -255.412 | -223.331 | -185.06 | -142.831 | -99.373 | -57.91 | -22.161 |
| 7.659999999999859 | -279.895 | -255.716 | -223.603 | -185.293 | -143.02 | -99.513 | -58 | -22.202 |
| 7.664999999999859 | -280.222 | -256.02 | -223.875 | -185.526 | -143.209 | -99.654 | -58.09 | -22.243 |
| 7.669999999999859 | -280.55 | -256.324 | -224.147 | -185.76 | -143.398 | -99.794 | -58.181 | -22.285 |
| 7.674999999999859 | -280.877 | -256.628 | -224.42 | -185.993 | -143.587 | -99.935 | -58.271 | -22.326 |
| 7.679999999999858 | -281.205 | -256.932 | -224.692 | -186.227 | -143.776 | -100.076 | -58.362 | -22.367 |
| 7.684999999999858 | -281.533 | -257.237 | -224.965 | -186.461 | -143.965 | -100.217 | -58.453 | -22.408 |
| 7.689999999999858 | -281.861 | -257.542 | -225.238 | -186.695 | -144.155 | -100.358 | -58.544 | -22.449 |
| 7.694999999999858 | -282.19 | -257.847 | -225.511 | -186.929 | -144.344 | -100.499 | -58.634 | -22.49 |
| 7.699999999999858 | -282.518 | -258.152 | -225.785 | -187.164 | -144.534 | -100.64 | -58.725 | -22.532 |
| 7.704999999999858 | -282.847 | -258.457 | -226.058 | -187.398 | -144.724 | -100.782 | -58.816 | -22.573 |
| 7.709999999999857 | -283.176 | -258.762 | -226.332 | -187.633 | -144.914 | -100.923 | -58.908 | -22.614 |
| 7.714999999999858 | -283.505 | -259.068 | -226.606 | -187.868 | -145.104 | -101.065 | -58.999 | -22.656 |
| 7.719999999999857 | -283.835 | -259.374 | -226.879 | -188.103 | -145.295 | -101.206 | -59.09 | -22.697 |
| 7.724999999999857 | -284.164 | -259.68 | -227.154 | -188.338 | -145.485 | -101.348 | -59.181 | -22.739 |
| 7.729999999999857 | -284.494 | -259.986 | -227.428 | -188.573 | -145.675 | -101.49 | -59.273 | -22.78 |
| 7.734999999999857 | -284.824 | -260.292 | -227.702 | -188.808 | -145.866 | -101.632 | -59.364 | -22.822 |
| 7.739999999999857 | -285.154 | -260.599 | -227.977 | -189.044 | -146.057 | -101.774 | -59.456 | -22.863 |
| 7.744999999999857 | -285.484 | -260.906 | -228.252 | -189.28 | -146.248 | -101.916 | -59.547 | -22.905 |
| 7.749999999999856 | -285.815 | -261.212 | -228.527 | -189.516 | -146.439 | -102.058 | -59.639 | -22.946 |
| 7.754999999999857 | -286.146 | -261.52 | -228.802 | -189.752 | -146.63 | -102.201 | -59.731 | -22.988 |
| 7.759999999999856 | -286.476 | -261.827 | -229.077 | -189.988 | -146.821 | -102.343 | -59.822 | -23.03 |
| 7.764999999999857 | -286.808 | -262.134 | -229.353 | -190.224 | -147.013 | -102.486 | -59.914 | -23.072 |
| 7.769999999999856 | -287.139 | -262.442 | -229.628 | -190.461 | -147.204 | -102.628 | -60.006 | -23.113 |
| 7.774999999999856 | -287.47 | -262.75 | -229.904 | -190.697 | -147.396 | -102.771 | -60.098 | -23.155 |
| 7.779999999999856 | -287.802 | -263.058 | -230.18 | -190.934 | -147.588 | -102.914 | -60.19 | -23.197 |
| 7.784999999999856 | -288.134 | -263.366 | -230.456 | -191.171 | -147.78 | -103.057 | -60.282 | -23.239 |
| 7.789999999999856 | -288.466 | -263.674 | -230.733 | -191.408 | -147.972 | -103.2 | -60.375 | -23.281 |
| 7.794999999999856 | -288.798 | -263.983 | -231.009 | -191.645 | -148.164 | -103.343 | -60.467 | -23.323 |
| 7.799999999999855 | -289.131 | -264.291 | -231.286 | -191.882 | -148.356 | -103.487 | -60.559 | -23.365 |
| 7.804999999999856 | -289.463 | -264.6 | -231.563 | -192.12 | -148.549 | -103.63 | -60.652 | -23.407 |
| 7.809999999999855 | -289.796 | -264.909 | -231.84 | -192.358 | -148.741 | -103.774 | -60.744 | -23.449 |
| 7.814999999999856 | -290.129 | -265.219 | -232.117 | -192.595 | -148.934 | -103.917 | -60.837 | -23.491 |
| 7.819999999999855 | -290.462 | -265.528 | -232.394 | -192.833 | -149.127 | -104.061 | -60.93 | -23.534 |
| 7.824999999999855 | -290.796 | -265.838 | -232.672 | -193.072 | -149.32 | -104.205 | -61.022 | -23.576 |
| 7.829999999999855 | -291.129 | -266.148 | -232.949 | -193.31 | -149.513 | -104.348 | -61.115 | -23.618 |
| 7.834999999999855 | -291.463 | -266.458 | -233.227 | -193.548 | -149.706 | -104.492 | -61.208 | -23.66 |
| 7.839999999999855 | -291.797 | -266.768 | -233.505 | -193.787 | -149.899 | -104.637 | -61.301 | -23.703 |
| 7.844999999999855 | -292.131 | -267.078 | -233.783 | -194.026 | -150.093 | -104.781 | -61.394 | -23.745 |
| 7.849999999999854 | -292.466 | -267.389 | -234.062 | -194.264 | -150.286 | -104.925 | -61.487 | -23.787 |
| 7.854999999999855 | -292.8 | -267.699 | -234.34 | -194.503 | -150.48 | -105.069 | -61.58 | -23.83 |
| 7.859999999999854 | -293.135 | -268.01 | -234.619 | -194.743 | -150.674 | -105.214 | -61.674 | -23.872 |
| 7.864999999999854 | -293.47 | -268.321 | -234.898 | -194.982 | -150.868 | -105.359 | -61.767 | -23.915 |
| 7.869999999999854 | -293.805 | -268.633 | -235.177 | -195.221 | -151.062 | -105.503 | -61.86 | -23.958 |
| 7.874999999999854 | -294.14 | -268.944 | -235.456 | -195.461 | -151.256 | -105.648 | -61.954 | -24 |
| 7.879999999999854 | -294.476 | -269.256 | -235.735 | -195.701 | -151.451 | -105.793 | -62.047 | -24.043 |
| 7.884999999999854 | -294.811 | -269.568 | -236.015 | -195.941 | -151.645 | -105.938 | -62.141 | -24.085 |
| 7.889999999999854 | -295.147 | -269.88 | -236.294 | -196.181 | -151.84 | -106.083 | -62.235 | -24.128 |
| 7.894999999999854 | -295.483 | -270.192 | -236.574 | -196.421 | -152.034 | -106.228 | -62.328 | -24.171 |
| 7.899999999999854 | -295.82 | -270.504 | -236.854 | -196.661 | -152.229 | -106.374 | -62.422 | -24.214 |
| 7.904999999999854 | -296.156 | -270.817 | -237.134 | -196.902 | -152.424 | -106.519 | -62.516 | -24.257 |
| 7.909999999999853 | -296.493 | -271.129 | -237.415 | -197.142 | -152.619 | -106.665 | -62.61 | -24.299 |
| 7.914999999999853 | -296.83 | -271.442 | -237.695 | -197.383 | -152.815 | -106.81 | -62.704 | -24.342 |
| 7.919999999999853 | -297.167 | -271.755 | -237.976 | -197.624 | -153.01 | -106.956 | -62.798 | -24.385 |
| 7.924999999999853 | -297.504 | -272.069 | -238.257 | -197.865 | -153.206 | -107.102 | -62.892 | -24.428 |
| 7.929999999999853 | -297.841 | -272.382 | -238.538 | -198.107 | -153.401 | -107.248 | -62.987 | -24.471 |
| 7.934999999999853 | -298.179 | -272.696 | -238.819 | -198.348 | -153.597 | -107.394 | -63.081 | -24.514 |
| 7.939999999999852 | -298.517 | -273.01 | -239.1 | -198.59 | -153.793 | -107.54 | -63.175 | -24.557 |
| 7.944999999999853 | -298.855 | -273.324 | -239.382 | -198.831 | -153.989 | -107.686 | -63.27 | -24.601 |
| 7.949999999999852 | -299.193 | -273.638 | -239.663 | -199.073 | -154.185 | -107.833 | -63.364 | -24.644 |
| 7.954999999999853 | -299.531 | -273.952 | -239.945 | -199.315 | -154.381 | -107.979 | -63.459 | -24.687 |
| 7.959999999999852 | -299.87 | -274.267 | -240.227 | -199.557 | -154.578 | -108.126 | -63.554 | -24.73 |
| 7.964999999999852 | -300.209 | -274.581 | -240.51 | -199.8 | -154.774 | -108.272 | -63.648 | -24.774 |
| 7.969999999999852 | -300.548 | -274.896 | -240.792 | -200.042 | -154.971 | -108.419 | -63.743 | -24.817 |
| 7.974999999999852 | -300.887 | -275.211 | -241.074 | -200.285 | -155.168 | -108.566 | -63.838 | -24.86 |
| 7.979999999999852 | -301.226 | -275.527 | -241.357 | -200.527 | -155.365 | -108.713 | -63.933 | -24.904 |
| 7.984999999999852 | -301.566 | -275.842 | -241.64 | -200.77 | -155.562 | -108.86 | -64.028 | -24.947 |
| 7.989999999999851 | -301.906 | -276.158 | -241.923 | -201.013 | -155.759 | -109.007 | -64.123 | -24.991 |
| 7.994999999999852 | -302.245 | -276.474 | -242.206 | -201.257 | -155.956 | -109.154 | -64.218 | -25.034 |
| 7.999999999999851 | -302.586 | -276.79 | -242.49 | -201.5 | -156.154 | -109.302 | -64.314 | -25.078 |
| 8.004999999999852 | -302.926 | -277.106 | -242.773 | -201.744 | -156.351 | -109.449 | -64.409 | -25.121 |
| 8.009999999999852 | -303.266 | -277.422 | -243.057 | -201.987 | -156.549 | -109.597 | -64.504 | -25.165 |
| 8.014999999999853 | -303.607 | -277.739 | -243.341 | -202.231 | -156.747 | -109.744 | -64.6 | -25.208 |
| 8.019999999999852 | -303.948 | -278.055 | -243.625 | -202.475 | -156.945 | -109.892 | -64.695 | -25.252 |
| 8.024999999999855 | -304.289 | -278.372 | -243.909 | -202.719 | -157.143 | -110.04 | -64.791 | -25.296 |
| 8.029999999999855 | -304.63 | -278.689 | -244.193 | -202.963 | -157.341 | -110.188 | -64.887 | -25.34 |
| 8.034999999999856 | -304.972 | -279.007 | -244.478 | -203.208 | -157.539 | -110.336 | -64.982 | -25.384 |
| 8.039999999999857 | -305.313 | -279.324 | -244.763 | -203.452 | -157.738 | -110.484 | -65.078 | -25.427 |
| 8.044999999999858 | -305.655 | -279.642 | -245.048 | -203.697 | -157.936 | -110.632 | -65.174 | -25.471 |
| 8.049999999999859 | -305.997 | -279.96 | -245.333 | -203.942 | -158.135 | -110.781 | -65.27 | -25.515 |
| 8.05499999999986 | -306.34 | -280.278 | -245.618 | -204.187 | -158.334 | -110.929 | -65.366 | -25.559 |
| 8.05999999999986 | -306.682 | -280.596 | -245.903 | -204.432 | -158.533 | -111.078 | -65.462 | -25.603 |
| 8.06499999999986 | -307.025 | -280.914 | -246.189 | -204.677 | -158.732 | -111.227 | -65.559 | -25.647 |
| 8.06999999999986 | -307.367 | -281.233 | -246.474 | -204.923 | -158.931 | -111.375 | -65.655 | -25.691 |
| 8.074999999999863 | -307.71 | -281.551 | -246.76 | -205.168 | -159.13 | -111.524 | -65.751 | -25.735 |
| 8.079999999999863 | -308.054 | -281.87 | -247.046 | -205.414 | -159.33 | -111.673 | -65.848 | -25.78 |
| 8.084999999999864 | -308.397 | -282.189 | -247.333 | -205.66 | -159.53 | -111.822 | -65.944 | -25.824 |
| 8.089999999999865 | -308.741 | -282.509 | -247.619 | -205.906 | -159.729 | -111.972 | -66.041 | -25.868 |
| 8.094999999999866 | -309.084 | -282.828 | -247.906 | -206.152 | -159.929 | -112.121 | -66.137 | -25.912 |
| 8.099999999999866 | -309.428 | -283.148 | -248.192 | -206.399 | -160.129 | -112.27 | -66.234 | -25.957 |
| 8.104999999999867 | -309.772 | -283.468 | -248.479 | -206.645 | -160.329 | -112.42 | -66.331 | -26.001 |
| 8.109999999999866 | -310.117 | -283.788 | -248.766 | -206.892 | -160.529 | -112.569 | -66.428 | -26.045 |
| 8.114999999999869 | -310.461 | -284.108 | -249.054 | -207.139 | -160.73 | -112.719 | -66.524 | -26.09 |
| 8.11999999999987 | -310.806 | -284.428 | -249.341 | -207.386 | -160.93 | -112.869 | -66.621 | -26.134 |
| 8.12499999999987 | -311.151 | -284.749 | -249.628 | -207.633 | -161.131 | -113.019 | -66.718 | -26.179 |
| 8.129999999999871 | -311.496 | -285.07 | -249.916 | -207.88 | -161.332 | -113.169 | -66.816 | -26.223 |
| 8.134999999999872 | -311.841 | -285.39 | -250.204 | -208.127 | -161.533 | -113.319 | -66.913 | -26.268 |
| 8.139999999999873 | -312.187 | -285.712 | -250.492 | -208.375 | -161.734 | -113.469 | -67.01 | -26.313 |
| 8.144999999999873 | -312.533 | -286.033 | -250.78 | -208.623 | -161.935 | -113.619 | -67.107 | -26.357 |
| 8.149999999999874 | -312.878 | -286.354 | -251.069 | -208.871 | -162.136 | -113.77 | -67.205 | -26.402 |
| 8.154999999999875 | -313.225 | -286.676 | -251.357 | -209.119 | -162.337 | -113.92 | -67.302 | -26.447 |
| 8.159999999999876 | -313.571 | -286.998 | -251.646 | -209.367 | -162.539 | -114.071 | -67.4 | -26.491 |
| 8.164999999999877 | -313.917 | -287.32 | -251.935 | -209.615 | -162.741 | -114.222 | -67.498 | -26.536 |
| 8.169999999999877 | -314.264 | -287.642 | -252.224 | -209.864 | -162.942 | -114.373 | -67.595 | -26.581 |
| 8.174999999999878 | -314.611 | -287.964 | -252.513 | -210.112 | -163.144 | -114.524 | -67.693 | -26.626 |
| 8.179999999999877 | -314.958 | -288.287 | -252.803 | -210.361 | -163.346 | -114.675 | -67.791 | -26.671 |
| 8.18499999999988 | -315.305 | -288.61 | -253.092 | -210.61 | -163.549 | -114.826 | -67.889 | -26.716 |
| 8.18999999999988 | -315.652 | -288.933 | -253.382 | -210.859 | -163.751 | -114.977 | -67.987 | -26.761 |
| 8.194999999999881 | -316 | -289.256 | -253.672 | -211.108 | -163.953 | -115.128 | -68.085 | -26.806 |
| 8.199999999999882 | -316.348 | -289.579 | -253.962 | -211.357 | -164.156 | -115.28 | -68.183 | -26.851 |
| 8.204999999999883 | -316.696 | -289.902 | -254.252 | -211.607 | -164.359 | -115.431 | -68.281 | -26.896 |
| 8.209999999999884 | -317.044 | -290.226 | -254.543 | -211.857 | -164.561 | -115.583 | -68.38 | -26.941 |
| 8.214999999999884 | -317.392 | -290.55 | -254.834 | -212.106 | -164.764 | -115.735 | -68.478 | -26.986 |
| 8.219999999999885 | -317.741 | -290.874 | -255.124 | -212.356 | -164.967 | -115.887 | -68.576 | -27.032 |
| 8.224999999999886 | -318.09 | -291.198 | -255.415 | -212.607 | -165.171 | -116.038 | -68.675 | -27.077 |
| 8.229999999999887 | -318.439 | -291.522 | -255.706 | -212.857 | -165.374 | -116.191 | -68.773 | -27.122 |
| 8.234999999999888 | -318.788 | -291.847 | -255.998 | -213.107 | -165.577 | -116.343 | -68.872 | -27.168 |
| 8.239999999999888 | -319.137 | -292.172 | -256.289 | -213.358 | -165.781 | -116.495 | -68.971 | -27.213 |
| 8.244999999999889 | -319.487 | -292.497 | -256.581 | -213.609 | -165.985 | -116.647 | -69.07 | -27.258 |
| 8.24999999999989 | -319.836 | -292.822 | -256.872 | -213.859 | -166.188 | -116.8 | -69.168 | -27.304 |
| 8.25499999999989 | -320.186 | -293.147 | -257.164 | -214.11 | -166.392 | -116.952 | -69.267 | -27.349 |
| 8.25999999999989 | -320.536 | -293.473 | -257.456 | -214.362 | -166.596 | -117.105 | -69.366 | -27.395 |
| 8.264999999999892 | -320.887 | -293.798 | -257.749 | -214.613 | -166.801 | -117.258 | -69.465 | -27.44 |
| 8.269999999999891 | -321.237 | -294.124 | -258.041 | -214.864 | -167.005 | -117.411 | -69.565 | -27.486 |
| 8.274999999999894 | -321.588 | -294.45 | -258.334 | -215.116 | -167.209 | -117.564 | -69.664 | -27.532 |
| 8.279999999999895 | -321.939 | -294.776 | -258.627 | -215.368 | -167.414 | -117.717 | -69.763 | -27.577 |
| 8.284999999999895 | -322.29 | -295.103 | -258.92 | -215.62 | -167.619 | -117.87 | -69.862 | -27.623 |
| 8.289999999999896 | -322.641 | -295.429 | -259.213 | -215.872 | -167.824 | -118.023 | -69.962 | -27.669 |
| 8.294999999999897 | -322.993 | -295.756 | -259.506 | -216.124 | -168.029 | -118.177 | -70.061 | -27.715 |
| 8.299999999999898 | -323.344 | -296.083 | -259.799 | -216.376 | -168.234 | -118.33 | -70.161 | -27.76 |
| 8.304999999999898 | -323.696 | -296.41 | -260.093 | -216.629 | -168.439 | -118.484 | -70.261 | -27.806 |
| 8.3099999999999 | -324.048 | -296.737 | -260.387 | -216.881 | -168.644 | -118.637 | -70.36 | -27.852 |
| 8.3149999999999 | -324.4 | -297.065 | -260.681 | -217.134 | -168.85 | -118.791 | -70.46 | -27.898 |
| 8.3199999999999 | -324.753 | -297.392 | -260.975 | -217.387 | -169.055 | -118.945 | -70.56 | -27.944 |
| 8.3249999999999 | -325.105 | -297.72 | -261.269 | -217.64 | -169.261 | -119.099 | -70.66 | -27.99 |
| 8.3299999999999 | -325.458 | -298.048 | -261.564 | -217.894 | -169.467 | -119.253 | -70.76 | -28.036 |
| 8.334999999999903 | -325.811 | -298.376 | -261.858 | -218.147 | -169.673 | -119.407 | -70.86 | -28.082 |
| 8.339999999999902 | -326.164 | -298.705 | -262.153 | -218.401 | -169.879 | -119.562 | -70.96 | -28.128 |
| 8.344999999999905 | -326.518 | -299.033 | -262.448 | -218.654 | -170.086 | -119.716 | -71.06 | -28.175 |
| 8.349999999999905 | -326.871 | -299.362 | -262.743 | -218.908 | -170.292 | -119.87 | -71.161 | -28.221 |
| 8.354999999999906 | -327.225 | -299.691 | -263.038 | -219.162 | -170.498 | -120.025 | -71.261 | -28.267 |
| 8.359999999999907 | -327.579 | -300.02 | -263.334 | -219.416 | -170.705 | -120.18 | -71.362 | -28.313 |
| 8.364999999999908 | -327.933 | -300.349 | -263.63 | -219.671 | -170.912 | -120.335 | -71.462 | -28.36 |
| 8.369999999999909 | -328.287 | -300.679 | -263.925 | -219.925 | -171.119 | -120.489 | -71.563 | -28.406 |
| 8.37499999999991 | -328.642 | -301.008 | -264.221 | -220.18 | -171.326 | -120.644 | -71.663 | -28.452 |
| 8.37999999999991 | -328.997 | -301.338 | -264.517 | -220.434 | -171.533 | -120.8 | -71.764 | -28.499 |
| 8.38499999999991 | -329.351 | -301.668 | -264.814 | -220.689 | -171.74 | -120.955 | -71.865 | -28.545 |
| 8.38999999999991 | -329.707 | -301.999 | -265.11 | -220.944 | -171.948 | -121.11 | -71.966 | -28.592 |
| 8.39499999999991 | -330.062 | -302.329 | -265.407 | -221.2 | -172.155 | -121.266 | -72.067 | -28.638 |
| 8.39999999999991 | -330.417 | -302.659 | -265.704 | -221.455 | -172.363 | -121.421 | -72.168 | -28.685 |
| 8.404999999999914 | -330.773 | -302.99 | -266.001 | -221.711 | -172.571 | -121.577 | -72.269 | -28.732 |
| 8.409999999999915 | -331.129 | -303.321 | -266.298 | -221.966 | -172.779 | -121.732 | -72.37 | -28.778 |
| 8.414999999999916 | -331.485 | -303.652 | -266.595 | -222.222 | -172.987 | -121.888 | -72.471 | -28.825 |
| 8.419999999999916 | -331.841 | -303.984 | -266.893 | -222.478 | -173.195 | -122.044 | -72.572 | -28.872 |
| 8.424999999999917 | -332.198 | -304.315 | -267.19 | -222.734 | -173.403 | -122.2 | -72.674 | -28.919 |
| 8.429999999999916 | -332.554 | -304.647 | -267.488 | -222.99 | -173.612 | -122.356 | -72.775 | -28.965 |
| 8.434999999999919 | -332.911 | -304.979 | -267.786 | -223.247 | -173.82 | -122.513 | -72.877 | -29.012 |
| 8.43999999999992 | -333.268 | -305.311 | -268.084 | -223.503 | -174.029 | -122.669 | -72.978 | -29.059 |
| 8.44499999999992 | -333.625 | -305.643 | -268.383 | -223.76 | -174.238 | -122.825 | -73.08 | -29.106 |
| 8.44999999999992 | -333.983 | -305.975 | -268.681 | -224.017 | -174.447 | -122.982 | -73.182 | -29.153 |
| 8.45499999999992 | -334.34 | -306.308 | -268.98 | -224.274 | -174.656 | -123.139 | -73.284 | -29.2 |
| 8.45999999999992 | -334.698 | -306.64 | -269.279 | -224.531 | -174.865 | -123.295 | -73.386 | -29.247 |
| 8.464999999999923 | -335.056 | -306.973 | -269.578 | -224.788 | -175.074 | -123.452 | -73.487 | -29.294 |
| 8.469999999999924 | -335.414 | -307.306 | -269.877 | -225.046 | -175.284 | -123.609 | -73.59 | -29.341 |
| 8.474999999999925 | -335.773 | -307.64 | -270.176 | -225.303 | -175.493 | -123.766 | -73.692 | -29.389 |
| 8.479999999999926 | -336.131 | -307.973 | -270.476 | -225.561 | -175.703 | -123.923 | -73.794 | -29.436 |
| 8.484999999999927 | -336.49 | -308.307 | -270.775 | -225.819 | -175.913 | -124.081 | -73.896 | -29.483 |
| 8.489999999999927 | -336.849 | -308.641 | -271.075 | -226.077 | -176.123 | -124.238 | -73.998 | -29.53 |
| 8.494999999999928 | -337.208 | -308.975 | -271.375 | -226.335 | -176.333 | -124.395 | -74.101 | -29.578 |
| 8.499999999999927 | -337.567 | -309.309 | -271.675 | -226.594 | -176.543 | -124.553 | -74.203 | -29.625 |
| 8.50499999999993 | -337.927 | -309.643 | -271.976 | -226.852 | -176.754 | -124.711 | -74.306 | -29.672 |
| 8.50999999999993 | -338.286 | -309.978 | -272.276 | -227.111 | -176.964 | -124.868 | -74.408 | -29.72 |
| 8.51499999999993 | -338.646 | -310.313 | -272.577 | -227.37 | -177.175 | -125.026 | -74.511 | -29.767 |
| 8.51999999999993 | -339.006 | -310.648 | -272.878 | -227.629 | -177.385 | -125.184 | -74.614 | -29.815 |
| 8.524999999999933 | -339.367 | -310.983 | -273.179 | -227.888 | -177.596 | -125.342 | -74.717 | -29.862 |
| 8.529999999999934 | -339.727 | -311.318 | -273.48 | -228.147 | -177.807 | -125.5 | -74.819 | -29.91 |
| 8.534999999999934 | -340.088 | -311.653 | -273.781 | -228.406 | -178.018 | -125.659 | -74.922 | -29.957 |
| 8.539999999999935 | -340.449 | -311.989 | -274.083 | -228.666 | -178.23 | -125.817 | -75.025 | -30.005 |
| 8.544999999999934 | -340.81 | -312.325 | -274.384 | -228.926 | -178.441 | -125.976 | -75.129 | -30.053 |
| 8.549999999999937 | -341.171 | -312.661 | -274.686 | -229.186 | -178.653 | -126.134 | -75.232 | -30.101 |
| 8.554999999999938 | -341.532 | -312.997 | -274.988 | -229.446 | -178.864 | -126.293 | -75.335 | -30.148 |
| 8.559999999999938 | -341.894 | -313.334 | -275.29 | -229.706 | -179.076 | -126.452 | -75.438 | -30.196 |
| 8.56499999999994 | -342.256 | -313.67 | -275.593 | -229.966 | -179.288 | -126.611 | -75.542 | -30.244 |
| 8.56999999999994 | -342.618 | -314.007 | -275.895 | -230.227 | -179.5 | -126.77 | -75.645 | -30.292 |
| 8.57499999999994 | -342.98 | -314.344 | -276.198 | -230.487 | -179.712 | -126.929 | -75.749 | -30.34 |
| 8.57999999999994 | -343.342 | -314.681 | -276.501 | -230.748 | -179.924 | -127.088 | -75.852 | -30.388 |
| 8.58499999999994 | -343.705 | -315.018 | -276.804 | -231.009 | -180.137 | -127.247 | -75.956 | -30.436 |
| 8.58999999999994 | -344.068 | -315.356 | -277.107 | -231.27 | -180.349 | -127.407 | -76.06 | -30.484 |
| 8.594999999999944 | -344.431 | -315.693 | -277.41 | -231.531 | -180.562 | -127.566 | -76.164 | -30.532 |
| 8.599999999999945 | -344.794 | -316.031 | -277.714 | -231.792 | -180.775 | -127.726 | -76.268 | -30.58 |
| 8.604999999999945 | -345.157 | -316.369 | -278.018 | -232.054 | -180.988 | -127.885 | -76.371 | -30.628 |
| 8.609999999999946 | -345.521 | -316.707 | -278.321 | -232.316 | -181.201 | -128.045 | -76.476 | -30.676 |
| 8.614999999999945 | -345.885 | -317.046 | -278.626 | -232.577 | -181.414 | -128.205 | -76.58 | -30.725 |
| 8.619999999999948 | -346.248 | -317.384 | -278.93 | -232.839 | -181.627 | -128.365 | -76.684 | -30.773 |
| 8.624999999999948 | -346.613 | -317.723 | -279.234 | -233.102 | -181.841 | -128.525 | -76.788 | -30.821 |
| 8.62999999999995 | -346.977 | -318.062 | -279.539 | -233.364 | -182.054 | -128.685 | -76.892 | -30.87 |
| 8.63499999999995 | -347.341 | -318.401 | -279.843 | -233.626 | -182.268 | -128.846 | -76.997 | -30.918 |
| 8.63999999999995 | -347.706 | -318.741 | -280.148 | -233.889 | -182.482 | -129.006 | -77.101 | -30.966 |
| 8.644999999999952 | -348.071 | -319.08 | -280.453 | -234.152 | -182.696 | -129.167 | -77.206 | -31.015 |
| 8.649999999999952 | -348.436 | -319.42 | -280.758 | -234.414 | -182.91 | -129.327 | -77.31 | -31.063 |
| 8.654999999999953 | -348.801 | -319.759 | -281.064 | -234.677 | -183.124 | -129.488 | -77.415 | -31.112 |
| 8.659999999999952 | -349.167 | -320.1 | -281.369 | -234.941 | -183.338 | -129.649 | -77.52 | -31.16 |
| 8.664999999999955 | -349.532 | -320.44 | -281.675 | -235.204 | -183.553 | -129.81 | -77.625 | -31.209 |
| 8.669999999999956 | -349.898 | -320.78 | -281.981 | -235.467 | -183.767 | -129.971 | -77.73 | -31.258 |
| 8.674999999999956 | -350.264 | -321.121 | -282.287 | -235.731 | -183.982 | -130.132 | -77.835 | -31.306 |
| 8.679999999999955 | -350.631 | -321.461 | -282.593 | -235.995 | -184.197 | -130.293 | -77.94 | -31.355 |
| 8.684999999999958 | -350.997 | -321.802 | -282.9 | -236.259 | -184.412 | -130.454 | -78.045 | -31.404 |
| 8.689999999999959 | -351.364 | -322.144 | -283.206 | -236.523 | -184.627 | -130.616 | -78.15 | -31.453 |
| 8.69499999999996 | -351.73 | -322.485 | -283.513 | -236.787 | -184.842 | -130.777 | -78.255 | -31.501 |
| 8.69999999999996 | -352.097 | -322.826 | -283.82 | -237.051 | -185.057 | -130.939 | -78.361 | -31.55 |
| 8.70499999999996 | -352.465 | -323.168 | -284.127 | -237.316 | -185.273 | -131.101 | -78.466 | -31.599 |
| 8.70999999999996 | -352.832 | -323.51 | -284.434 | -237.58 | -185.489 | -131.263 | -78.572 | -31.648 |
| 8.714999999999963 | -353.2 | -323.852 | -284.742 | -237.845 | -185.704 | -131.425 | -78.677 | -31.697 |
| 8.719999999999963 | -353.567 | -324.194 | -285.049 | -238.11 | -185.92 | -131.587 | -78.783 | -31.746 |
| 8.724999999999964 | -353.935 | -324.536 | -285.357 | -238.375 | -186.136 | -131.749 | -78.888 | -31.795 |
| 8.729999999999963 | -354.303 | -324.879 | -285.665 | -238.641 | -186.352 | -131.911 | -78.994 | -31.844 |
| 8.734999999999966 | -354.672 | -325.222 | -285.973 | -238.906 | -186.568 | -132.073 | -79.1 | -31.893 |
| 8.739999999999966 | -355.04 | -325.565 | -286.281 | -239.172 | -186.785 | -132.236 | -79.206 | -31.943 |
| 8.744999999999967 | -355.409 | -325.908 | -286.589 | -239.437 | -187.001 | -132.398 | -79.312 | -31.992 |
| 8.749999999999966 | -355.778 | -326.251 | -286.898 | -239.703 | -187.218 | -132.561 | -79.418 | -32.041 |
| 8.754999999999969 | -356.147 | -326.595 | -287.207 | -239.969 | -187.435 | -132.724 | -79.524 | -32.09 |
| 8.75999999999997 | -356.516 | -326.938 | -287.516 | -240.235 | -187.652 | -132.887 | -79.63 | -32.14 |
| 8.76499999999997 | -356.886 | -327.282 | -287.825 | -240.502 | -187.869 | -133.05 | -79.737 | -32.189 |
| 8.76999999999997 | -357.256 | -327.626 | -288.134 | -240.768 | -188.086 | -133.213 | -79.843 | -32.239 |
| 8.77499999999997 | -357.625 | -327.97 | -288.443 | -241.035 | -188.303 | -133.376 | -79.949 | -32.288 |
| 8.779999999999973 | -357.996 | -328.315 | -288.753 | -241.301 | -188.52 | -133.539 | -80.056 | -32.337 |
| 8.784999999999973 | -358.366 | -328.659 | -289.063 | -241.568 | -188.738 | -133.703 | -80.162 | -32.387 |
| 8.789999999999974 | -358.736 | -329.004 | -289.373 | -241.835 | -188.956 | -133.866 | -80.269 | -32.437 |
| 8.794999999999975 | -359.107 | -329.349 | -289.683 | -242.103 | -189.173 | -134.03 | -80.376 | -32.486 |
| 8.799999999999976 | -359.478 | -329.694 | -289.993 | -242.37 | -189.391 | -134.193 | -80.483 | -32.536 |
| 8.804999999999977 | -359.849 | -330.039 | -290.303 | -242.638 | -189.609 | -134.357 | -80.589 | -32.585 |
| 8.809999999999977 | -360.22 | -330.385 | -290.614 | -242.905 | -189.828 | -134.521 | -80.696 | -32.635 |
| 8.814999999999978 | -360.591 | -330.731 | -290.925 | -243.173 | -190.046 | -134.685 | -80.803 | -32.685 |
| 8.819999999999977 | -360.963 | -331.076 | -291.236 | -243.441 | -190.264 | -134.849 | -80.91 | -32.735 |
| 8.82499999999998 | -361.335 | -331.423 | -291.547 | -243.709 | -190.483 | -135.013 | -81.018 | -32.785 |
| 8.82999999999998 | -361.707 | -331.769 | -291.858 | -243.977 | -190.702 | -135.178 | -81.125 | -32.834 |
| 8.83499999999998 | -362.079 | -332.115 | -292.169 | -244.246 | -190.92 | -135.342 | -81.232 | -32.884 |
| 8.83999999999998 | -362.451 | -332.462 | -292.481 | -244.514 | -191.139 | -135.506 | -81.339 | -32.934 |
| 8.844999999999983 | -362.824 | -332.808 | -292.793 | -244.783 | -191.358 | -135.671 | -81.447 | -32.984 |
| 8.849999999999984 | -363.197 | -333.155 | -293.105 | -245.052 | -191.578 | -135.836 | -81.554 | -33.034 |
| 8.854999999999984 | -363.57 | -333.503 | -293.417 | -245.321 | -191.797 | -136.001 | -81.662 | -33.084 |
| 8.859999999999985 | -363.943 | -333.85 | -293.729 | -245.59 | -192.016 | -136.166 | -81.77 | -33.134 |
| 8.864999999999984 | -364.316 | -334.197 | -294.042 | -245.859 | -192.236 | -136.331 | -81.877 | -33.184 |
| 8.869999999999987 | -364.69 | -334.545 | -294.354 | -246.129 | -192.456 | -136.496 | -81.985 | -33.235 |
| 8.874999999999988 | -365.063 | -334.893 | -294.667 | -246.398 | -192.675 | -136.661 | -82.093 | -33.285 |
| 8.879999999999988 | -365.437 | -335.241 | -294.98 | -246.668 | -192.895 | -136.826 | -82.201 | -33.335 |
| 8.88499999999999 | -365.811 | -335.589 | -295.293 | -246.938 | -193.115 | -136.992 | -82.309 | -33.385 |
| 8.88999999999999 | -366.186 | -335.937 | -295.606 | -247.208 | -193.336 | -137.157 | -82.417 | -33.436 |
| 8.89499999999999 | -366.56 | -336.286 | -295.92 | -247.478 | -193.556 | -137.323 | -82.525 | -33.486 |
| 8.89999999999999 | -366.935 | -336.635 | -296.233 | -247.749 | -193.776 | -137.488 | -82.633 | -33.536 |
| 8.90499999999999 | -367.31 | -336.984 | -296.547 | -248.019 | -193.997 | -137.654 | -82.742 | -33.587 |
| 8.90999999999999 | -367.685 | -337.333 | -296.861 | -248.29 | -194.218 | -137.82 | -82.85 | -33.637 |
| 8.914999999999994 | -368.06 | -337.682 | -297.175 | -248.561 | -194.439 | -137.986 | -82.958 | -33.688 |
| 8.919999999999995 | -368.436 | -338.032 | -297.489 | -248.832 | -194.66 | -138.152 | -83.067 | -33.738 |
| 8.924999999999995 | -368.811 | -338.381 | -297.804 | -249.103 | -194.881 | -138.319 | -83.175 | -33.789 |
| 8.929999999999996 | -369.187 | -338.731 | -298.118 | -249.374 | -195.102 | -138.485 | -83.284 | -33.84 |
| 8.934999999999995 | -369.563 | -339.081 | -298.433 | -249.645 | -195.323 | -138.651 | -83.393 | -33.89 |
| 8.939999999999998 | -369.939 | -339.431 | -298.748 | -249.917 | -195.545 | -138.818 | -83.502 | -33.941 |
| 8.944999999999999 | -370.316 | -339.782 | -299.063 | -250.189 | -195.766 | -138.985 | -83.61 | -33.992 |
| 8.95 | -370.692 | -340.132 | -299.379 | -250.461 | -195.988 | -139.151 | -83.719 | -34.042 |
| 8.955 | -371.069 | -340.483 | -299.694 | -250.733 | -196.21 | -139.318 | -83.828 | -34.093 |
| 8.96 | -371.446 | -340.834 | -300.01 | -251.005 | -196.432 | -139.485 | -83.938 | -34.144 |
| 8.965 | -371.823 | -341.185 | -300.326 | -251.277 | -196.654 | -139.652 | -84.047 | -34.195 |
| 8.970000000000002 | -372.201 | -341.537 | -300.641 | -251.55 | -196.877 | -139.819 | -84.156 | -34.246 |
| 8.975000000000003 | -372.578 | -341.888 | -300.958 | -251.822 | -197.099 | -139.987 | -84.265 | -34.297 |
| 8.980000000000002 | -372.956 | -342.24 | -301.274 | -252.095 | -197.321 | -140.154 | -84.375 | -34.348 |
| 8.985000000000005 | -373.334 | -342.592 | -301.59 | -252.368 | -197.544 | -140.321 | -84.484 | -34.399 |
| 8.990000000000006 | -373.712 | -342.944 | -301.907 | -252.641 | -197.767 | -140.489 | -84.594 | -34.45 |
| 8.995000000000006 | -374.09 | -343.296 | -302.224 | -252.914 | -197.99 | -140.657 | -84.703 | -34.501 |
| 9.000000000000007 | -374.469 | -343.648 | -302.541 | -253.188 | -198.213 | -140.824 | -84.813 | -34.552 |
| 9.005000000000008 | -374.848 | -344.001 | -302.858 | -253.461 | -198.436 | -140.992 | -84.923 | -34.603 |
| 9.010000000000009 | -375.226 | -344.354 | -303.175 | -253.735 | -198.659 | -141.16 | -85.032 | -34.655 |
| 9.01500000000001 | -375.606 | -344.707 | -303.493 | -254.008 | -198.883 | -141.328 | -85.142 | -34.706 |
| 9.02000000000001 | -375.985 | -345.06 | -303.81 | -254.282 | -199.106 | -141.496 | -85.252 | -34.757 |
| 9.02500000000001 | -376.364 | -345.413 | -304.128 | -254.557 | -199.33 | -141.665 | -85.362 | -34.809 |
| 9.030000000000012 | -376.744 | -345.767 | -304.446 | -254.831 | -199.554 | -141.833 | -85.472 | -34.86 |
| 9.035000000000013 | -377.124 | -346.12 | -304.764 | -255.105 | -199.778 | -142.001 | -85.582 | -34.911 |
| 9.040000000000013 | -377.504 | -346.474 | -305.083 | -255.38 | -200.002 | -142.17 | -85.693 | -34.963 |
| 9.045000000000014 | -377.884 | -346.828 | -305.401 | -255.655 | -200.226 | -142.339 | -85.803 | -35.014 |
| 9.050000000000013 | -378.265 | -347.182 | -305.72 | -255.929 | -200.45 | -142.508 | -85.913 | -35.066 |
| 9.055000000000016 | -378.645 | -347.537 | -306.039 | -256.204 | -200.675 | -142.676 | -86.024 | -35.118 |
| 9.060000000000016 | -379.026 | -347.891 | -306.358 | -256.48 | -200.899 | -142.845 | -86.134 | -35.169 |
| 9.065000000000017 | -379.407 | -348.246 | -306.677 | -256.755 | -201.124 | -143.014 | -86.245 | -35.221 |
| 9.070000000000018 | -379.788 | -348.601 | -306.996 | -257.03 | -201.349 | -143.184 | -86.356 | -35.272 |
| 9.075000000000019 | -380.17 | -348.956 | -307.316 | -257.306 | -201.574 | -143.353 | -86.466 | -35.324 |
| 9.08000000000002 | -380.551 | -349.311 | -307.635 | -257.582 | -201.799 | -143.522 | -86.577 | -35.376 |
| 9.08500000000002 | -380.933 | -349.667 | -307.955 | -257.858 | -202.024 | -143.692 | -86.688 | -35.428 |
| 9.090000000000021 | -381.315 | -350.023 | -308.275 | -258.134 | -202.249 | -143.861 | -86.799 | -35.48 |
| 9.09500000000002 | -381.697 | -350.379 | -308.595 | -258.41 | -202.475 | -144.031 | -86.91 | -35.531 |
| 9.100000000000023 | -382.08 | -350.735 | -308.916 | -258.686 | -202.7 | -144.201 | -87.021 | -35.583 |
| 9.105000000000024 | -382.462 | -351.091 | -309.236 | -258.963 | -202.926 | -144.371 | -87.132 | -35.635 |
| 9.110000000000024 | -382.845 | -351.447 | -309.557 | -259.239 | -203.152 | -144.541 | -87.244 | -35.687 |
| 9.115000000000025 | -383.228 | -351.804 | -309.878 | -259.516 | -203.378 | -144.711 | -87.355 | -35.739 |
| 9.120000000000026 | -383.611 | -352.161 | -310.199 | -259.793 | -203.604 | -144.881 | -87.466 | -35.791 |
| 9.125000000000027 | -383.994 | -352.518 | -310.52 | -260.07 | -203.83 | -145.052 | -87.578 | -35.844 |
| 9.130000000000027 | -384.378 | -352.875 | -310.841 | -260.348 | -204.057 | -145.222 | -87.689 | -35.896 |
| 9.135000000000028 | -384.761 | -353.232 | -311.163 | -260.625 | -204.283 | -145.392 | -87.801 | -35.948 |
| 9.140000000000029 | -385.145 | -353.589 | -311.484 | -260.903 | -204.51 | -145.563 | -87.913 | -36 |
| 9.14500000000003 | -385.529 | -353.947 | -311.806 | -261.18 | -204.736 | -145.734 | -88.024 | -36.052 |
| 9.15000000000003 | -385.914 | -354.305 | -312.128 | -261.458 | -204.963 | -145.905 | -88.136 | -36.105 |
| 9.15500000000003 | -386.298 | -354.663 | -312.45 | -261.736 | -205.19 | -146.076 | -88.248 | -36.157 |
| 9.160000000000032 | -386.683 | -355.021 | -312.773 | -262.014 | -205.417 | -146.247 | -88.36 | -36.209 |
| 9.165000000000031 | -387.068 | -355.38 | -313.095 | -262.293 | -205.645 | -146.418 | -88.472 | -36.262 |
| 9.170000000000034 | -387.453 | -355.738 | -313.418 | -262.571 | -205.872 | -146.589 | -88.584 | -36.314 |
| 9.175000000000034 | -387.838 | -356.097 | -313.741 | -262.85 | -206.1 | -146.76 | -88.696 | -36.367 |
| 9.180000000000035 | -388.223 | -356.456 | -314.064 | -263.128 | -206.327 | -146.932 | -88.809 | -36.419 |
| 9.185000000000036 | -388.609 | -356.815 | -314.387 | -263.407 | -206.555 | -147.103 | -88.921 | -36.472 |
| 9.190000000000037 | -388.995 | -357.174 | -314.71 | -263.686 | -206.783 | -147.275 | -89.033 | -36.524 |
| 9.195000000000038 | -389.381 | -357.534 | -315.034 | -263.966 | -207.011 | -147.447 | -89.146 | -36.577 |
| 9.200000000000038 | -389.767 | -357.894 | -315.357 | -264.245 | -207.239 | -147.618 | -89.258 | -36.63 |
| 9.20500000000004 | -390.153 | -358.254 | -315.681 | -264.525 | -207.467 | -147.79 | -89.371 | -36.682 |
| 9.21000000000004 | -390.54 | -358.614 | -316.005 | -264.804 | -207.696 | -147.962 | -89.484 | -36.735 |
| 9.21500000000004 | -390.927 | -358.974 | -316.33 | -265.084 | -207.924 | -148.135 | -89.596 | -36.788 |
| 9.220000000000041 | -391.314 | -359.334 | -316.654 | -265.364 | -208.153 | -148.307 | -89.709 | -36.841 |
| 9.225000000000042 | -391.701 | -359.695 | -316.978 | -265.644 | -208.382 | -148.479 | -89.822 | -36.894 |
| 9.230000000000043 | -392.088 | -360.056 | -317.303 | -265.924 | -208.611 | -148.652 | -89.935 | -36.946 |
| 9.235000000000044 | -392.476 | -360.417 | -317.628 | -266.205 | -208.84 | -148.824 | -90.048 | -36.999 |
| 9.240000000000045 | -392.864 | -360.778 | -317.953 | -266.485 | -209.069 | -148.997 | -90.161 | -37.052 |
| 9.245000000000045 | -393.251 | -361.139 | -318.278 | -266.766 | -209.298 | -149.17 | -90.274 | -37.105 |
| 9.250000000000046 | -393.64 | -361.5 | -318.604 | -267.047 | -209.528 | -149.342 | -90.388 | -37.158 |
| 9.255000000000045 | -394.028 | -361.862 | -318.929 | -267.328 | -209.757 | -149.515 | -90.501 | -37.212 |
| 9.260000000000048 | -394.416 | -362.224 | -319.255 | -267.609 | -209.987 | -149.689 | -90.614 | -37.265 |
| 9.265000000000049 | -394.805 | -362.586 | -319.581 | -267.89 | -210.217 | -149.862 | -90.728 | -37.318 |
| 9.27000000000005 | -395.194 | -362.948 | -319.907 | -268.172 | -210.447 | -150.035 | -90.841 | -37.371 |
| 9.27500000000005 | -395.583 | -363.311 | -320.233 | -268.453 | -210.677 | -150.208 | -90.955 | -37.424 |
| 9.28000000000005 | -395.972 | -363.673 | -320.559 | -268.735 | -210.907 | -150.382 | -91.069 | -37.478 |
| 9.285000000000052 | -396.362 | -364.036 | -320.886 | -269.017 | -211.137 | -150.555 | -91.182 | -37.531 |
| 9.290000000000052 | -396.751 | -364.399 | -321.213 | -269.299 | -211.368 | -150.729 | -91.296 | -37.584 |
| 9.295000000000053 | -397.141 | -364.762 | -321.54 | -269.581 | -211.598 | -150.903 | -91.41 | -37.638 |
| 9.300000000000052 | -397.531 | -365.126 | -321.867 | -269.864 | -211.829 | -151.077 | -91.524 | -37.691 |
| 9.305000000000055 | -397.922 | -365.489 | -322.194 | -270.146 | -212.06 | -151.251 | -91.638 | -37.745 |
| 9.310000000000056 | -398.312 | -365.853 | -322.521 | -270.429 | -212.291 | -151.425 | -91.752 | -37.798 |
| 9.315000000000056 | -398.703 | -366.217 | -322.849 | -270.712 | -212.522 | -151.599 | -91.867 | -37.852 |
| 9.320000000000057 | -399.093 | -366.581 | -323.176 | -270.995 | -212.753 | -151.773 | -91.981 | -37.905 |
| 9.325000000000056 | -399.484 | -366.945 | -323.504 | -271.278 | -212.984 | -151.948 | -92.095 | -37.959 |
| 9.330000000000059 | -399.876 | -367.309 | -323.832 | -271.561 | -213.216 | -152.122 | -92.21 | -38.013 |
| 9.33500000000006 | -400.267 | -367.674 | -324.161 | -271.844 | -213.448 | -152.297 | -92.324 | -38.066 |
| 9.34000000000006 | -400.659 | -368.039 | -324.489 | -272.128 | -213.679 | -152.471 | -92.439 | -38.12 |
| 9.34500000000006 | -401.05 | -368.404 | -324.818 | -272.412 | -213.911 | -152.646 | -92.553 | -38.174 |
| 9.35000000000006 | -401.442 | -368.769 | -325.146 | -272.696 | -214.143 | -152.821 | -92.668 | -38.228 |
| 9.35500000000006 | -401.834 | -369.134 | -325.475 | -272.98 | -214.375 | -152.996 | -92.783 | -38.281 |
| 9.360000000000063 | -402.227 | -369.5 | -325.804 | -273.264 | -214.607 | -153.171 | -92.898 | -38.335 |
| 9.365000000000064 | -402.619 | -369.865 | -326.134 | -273.548 | -214.84 | -153.346 | -93.012 | -38.389 |
| 9.370000000000063 | -403.012 | -370.231 | -326.463 | -273.833 | -215.072 | -153.522 | -93.127 | -38.443 |
| 9.375000000000066 | -403.405 | -370.597 | -326.793 | -274.117 | -215.305 | -153.697 | -93.243 | -38.497 |
| 9.380000000000067 | -403.798 | -370.963 | -327.122 | -274.402 | -215.538 | -153.873 | -93.358 | -38.551 |
| 9.385000000000067 | -404.191 | -371.33 | -327.452 | -274.687 | -215.771 | -154.048 | -93.473 | -38.605 |
| 9.390000000000068 | -404.585 | -371.696 | -327.782 | -274.972 | -216.004 | -154.224 | -93.588 | -38.659 |
| 9.395000000000069 | -404.979 | -372.063 | -328.112 | -275.257 | -216.237 | -154.4 | -93.703 | -38.714 |
| 9.40000000000007 | -405.372 | -372.43 | -328.443 | -275.543 | -216.47 | -154.576 | -93.819 | -38.768 |
| 9.40500000000007 | -405.767 | -372.797 | -328.773 | -275.828 | -216.703 | -154.752 | -93.934 | -38.822 |
| 9.410000000000071 | -406.161 | -373.165 | -329.104 | -276.114 | -216.937 | -154.928 | -94.05 | -38.876 |
| 9.41500000000007 | -406.555 | -373.532 | -329.435 | -276.399 | -217.171 | -155.104 | -94.166 | -38.931 |
| 9.420000000000073 | -406.95 | -373.9 | -329.766 | -276.685 | -217.404 | -155.28 | -94.281 | -38.985 |
| 9.425000000000074 | -407.345 | -374.268 | -330.097 | -276.972 | -217.638 | -155.457 | -94.397 | -39.039 |
| 9.430000000000074 | -407.74 | -374.636 | -330.429 | -277.258 | -217.872 | -155.633 | -94.513 | -39.094 |
| 9.435000000000075 | -408.135 | -375.004 | -330.76 | -277.544 | -218.107 | -155.81 | -94.629 | -39.148 |
| 9.440000000000076 | -408.53 | -375.372 | -331.092 | -277.831 | -218.341 | -155.987 | -94.745 | -39.203 |
| 9.445000000000077 | -408.926 | -375.741 | -331.424 | -278.118 | -218.575 | -156.164 | -94.861 | -39.257 |
| 9.450000000000077 | -409.322 | -376.11 | -331.756 | -278.404 | -218.81 | -156.341 | -94.977 | -39.312 |
| 9.455000000000078 | -409.718 | -376.479 | -332.089 | -278.691 | -219.045 | -156.518 | -95.093 | -39.366 |
| 9.460000000000077 | -410.114 | -376.848 | -332.421 | -278.979 | -219.279 | -156.695 | -95.21 | -39.421 |
| 9.46500000000008 | -410.51 | -377.217 | -332.754 | -279.266 | -219.514 | -156.872 | -95.326 | -39.476 |
| 9.47000000000008 | -410.907 | -377.587 | -333.086 | -279.553 | -219.749 | -157.049 | -95.442 | -39.53 |
| 9.47500000000008 | -411.304 | -377.956 | -333.419 | -279.841 | -219.985 | -157.227 | -95.559 | -39.585 |
| 9.480000000000082 | -411.701 | -378.326 | -333.752 | -280.129 | -220.22 | -157.404 | -95.675 | -39.64 |
| 9.485000000000081 | -412.098 | -378.696 | -334.086 | -280.417 | -220.455 | -157.582 | -95.792 | -39.695 |
| 9.490000000000084 | -412.495 | -379.067 | -334.419 | -280.705 | -220.691 | -157.76 | -95.909 | -39.75 |
| 9.495000000000084 | -412.893 | -379.437 | -334.753 | -280.993 | -220.927 | -157.938 | -96.026 | -39.805 |
| 9.500000000000085 | -413.29 | -379.808 | -335.086 | -281.281 | -221.162 | -158.116 | -96.142 | -39.86 |
| 9.505000000000086 | -413.688 | -380.178 | -335.42 | -281.57 | -221.398 | -158.294 | -96.259 | -39.915 |
| 9.510000000000087 | -414.086 | -380.549 | -335.754 | -281.858 | -221.634 | -158.472 | -96.376 | -39.97 |
| 9.515000000000088 | -414.485 | -380.921 | -336.089 | -282.147 | -221.871 | -158.65 | -96.493 | -40.025 |
| 9.520000000000088 | -414.883 | -381.292 | -336.423 | -282.436 | -222.107 | -158.829 | -96.611 | -40.08 |
| 9.52500000000009 | -415.282 | -381.663 | -336.758 | -282.725 | -222.343 | -159.007 | -96.728 | -40.135 |
| 9.53000000000009 | -415.681 | -382.035 | -337.093 | -283.015 | -222.58 | -159.186 | -96.845 | -40.19 |
| 9.53500000000009 | -416.08 | -382.407 | -337.428 | -283.304 | -222.817 | -159.364 | -96.962 | -40.245 |
| 9.540000000000092 | -416.479 | -382.779 | -337.763 | -283.594 | -223.054 | -159.543 | -97.08 | -40.301 |
| 9.545000000000092 | -416.879 | -383.151 | -338.098 | -283.883 | -223.291 | -159.722 | -97.197 | -40.356 |
| 9.550000000000093 | -417.278 | -383.524 | -338.433 | -284.173 | -223.528 | -159.901 | -97.315 | -40.411 |
| 9.555000000000094 | -417.678 | -383.896 | -338.769 | -284.463 | -223.765 | -160.08 | -97.433 | -40.467 |
| 9.560000000000095 | -418.078 | -384.269 | -339.105 | -284.753 | -224.002 | -160.259 | -97.55 | -40.522 |
| 9.565000000000095 | -418.478 | -384.642 | -339.441 | -285.044 | -224.24 | -160.438 | -97.668 | -40.578 |
| 9.570000000000096 | -418.879 | -385.015 | -339.777 | -285.334 | -224.477 | -160.618 | -97.786 | -40.633 |
| 9.575000000000095 | -419.279 | -385.389 | -340.113 | -285.625 | -224.715 | -160.797 | -97.904 | -40.689 |
| 9.580000000000098 | -419.68 | -385.762 | -340.45 | -285.915 | -224.953 | -160.977 | -98.022 | -40.744 |
| 9.585000000000099 | -420.081 | -386.136 | -340.786 | -286.206 | -225.191 | -161.157 | -98.14 | -40.8 |
| 9.5900000000001 | -420.482 | -386.51 | -341.123 | -286.497 | -225.429 | -161.336 | -98.258 | -40.855 |
| 9.5950000000001 | -420.884 | -386.884 | -341.46 | -286.789 | -225.668 | -161.516 | -98.376 | -40.911 |
| 9.600000000000101 | -421.285 | -387.258 | -341.797 | -287.08 | -225.906 | -161.696 | -98.495 | -40.967 |
| 9.605000000000102 | -421.687 | -387.632 | -342.134 | -287.372 | -226.144 | -161.876 | -98.613 | -41.022 |
| 9.610000000000102 | -422.089 | -388.007 | -342.472 | -287.663 | -226.383 | -162.057 | -98.732 | -41.078 |
| 9.615000000000103 | -422.491 | -388.382 | -342.81 | -287.955 | -226.622 | -162.237 | -98.85 | -41.134 |
| 9.620000000000104 | -422.893 | -388.757 | -343.147 | -288.247 | -226.861 | -162.417 | -98.969 | -41.19 |
| 9.625000000000105 | -423.296 | -389.132 | -343.485 | -288.539 | -227.1 | -162.598 | -99.087 | -41.246 |
| 9.630000000000106 | -423.699 | -389.507 | -343.823 | -288.831 | -227.339 | -162.778 | -99.206 | -41.302 |
| 9.635000000000106 | -424.101 | -389.883 | -344.162 | -289.124 | -227.578 | -162.959 | -99.325 | -41.358 |
| 9.640000000000107 | -424.505 | -390.258 | -344.5 | -289.416 | -227.818 | -163.14 | -99.444 | -41.414 |
| 9.645000000000108 | -424.908 | -390.634 | -344.839 | -289.709 | -228.057 | -163.321 | -99.563 | -41.47 |
| 9.650000000000109 | -425.311 | -391.01 | -345.178 | -290.002 | -228.297 | -163.502 | -99.682 | -41.526 |
| 9.65500000000011 | -425.715 | -391.387 | -345.517 | -290.295 | -228.537 | -163.683 | -99.801 | -41.582 |
| 9.66000000000011 | -426.119 | -391.763 | -345.856 | -290.588 | -228.777 | -163.864 | -99.92 | -41.638 |
| 9.66500000000011 | -426.523 | -392.14 | -346.195 | -290.881 | -229.017 | -164.046 | -100.039 | -41.694 |
| 9.670000000000112 | -426.927 | -392.516 | -346.535 | -291.175 | -229.257 | -164.227 | -100.158 | -41.751 |
| 9.675000000000113 | -427.332 | -392.893 | -346.874 | -291.468 | -229.497 | -164.409 | -100.278 | -41.807 |
| 9.680000000000113 | -427.736 | -393.271 | -347.214 | -291.762 | -229.738 | -164.59 | -100.397 | -41.863 |
| 9.685000000000114 | -428.141 | -393.648 | -347.554 | -292.056 | -229.978 | -164.772 | -100.517 | -41.92 |
| 9.690000000000115 | -428.546 | -394.025 | -347.894 | -292.35 | -230.219 | -164.954 | -100.636 | -41.976 |
| 9.695000000000116 | -428.951 | -394.403 | -348.235 | -292.644 | -230.46 | -165.136 | -100.756 | -42.033 |
| 9.700000000000117 | -429.357 | -394.781 | -348.575 | -292.939 | -230.701 | -165.318 | -100.876 | -42.089 |
| 9.705000000000117 | -429.762 | -395.159 | -348.916 | -293.233 | -230.942 | -165.5 | -100.996 | -42.146 |
| 9.710000000000118 | -430.168 | -395.537 | -349.257 | -293.528 | -231.183 | -165.682 | -101.116 | -42.202 |
| 9.715000000000119 | -430.574 | -395.916 | -349.598 | -293.823 | -231.424 | -165.865 | -101.235 | -42.259 |
| 9.72000000000012 | -430.98 | -396.294 | -349.939 | -294.118 | -231.666 | -166.047 | -101.356 | -42.315 |
| 9.72500000000012 | -431.387 | -396.673 | -350.28 | -294.413 | -231.907 | -166.23 | -101.476 | -42.372 |
| 9.730000000000121 | -431.793 | -397.052 | -350.622 | -294.708 | -232.149 | -166.412 | -101.596 | -42.429 |
| 9.735000000000122 | -432.2 | -397.431 | -350.963 | -295.003 | -232.391 | -166.595 | -101.716 | -42.485 |
| 9.740000000000123 | -432.607 | -397.811 | -351.305 | -295.299 | -232.633 | -166.778 | -101.836 | -42.542 |
| 9.745000000000124 | -433.014 | -398.19 | -351.647 | -295.595 | -232.875 | -166.961 | -101.957 | -42.599 |
| 9.750000000000124 | -433.421 | -398.57 | -351.989 | -295.891 | -233.117 | -167.144 | -102.077 | -42.656 |
| 9.755000000000125 | -433.829 | -398.95 | -352.332 | -296.187 | -233.36 | -167.327 | -102.198 | -42.713 |
| 9.760000000000126 | -434.236 | -399.33 | -352.674 | -296.483 | -233.602 | -167.51 | -102.318 | -42.77 |
| 9.765000000000127 | -434.644 | -399.71 | -353.017 | -296.779 | -233.845 | -167.694 | -102.439 | -42.827 |
| 9.770000000000127 | -435.052 | -400.09 | -353.36 | -297.076 | -234.087 | -167.877 | -102.56 | -42.884 |
| 9.775000000000128 | -435.461 | -400.471 | -353.703 | -297.372 | -234.33 | -168.061 | -102.681 | -42.941 |
| 9.780000000000129 | -435.869 | -400.852 | -354.046 | -297.669 | -234.573 | -168.244 | -102.801 | -42.998 |
| 9.78500000000013 | -436.278 | -401.233 | -354.389 | -297.966 | -234.816 | -168.428 | -102.922 | -43.055 |
| 9.79000000000013 | -436.687 | -401.614 | -354.733 | -298.263 | -235.06 | -168.612 | -103.043 | -43.112 |
| 9.795000000000131 | -437.096 | -401.995 | -355.076 | -298.56 | -235.303 | -168.796 | -103.165 | -43.169 |
| 9.800000000000132 | -437.505 | -402.377 | -355.42 | -298.858 | -235.547 | -168.98 | -103.286 | -43.226 |
| 9.805000000000131 | -437.914 | -402.759 | -355.764 | -299.155 | -235.79 | -169.164 | -103.407 | -43.284 |
| 9.810000000000134 | -438.324 | -403.14 | -356.108 | -299.453 | -236.034 | -169.349 | -103.528 | -43.341 |
| 9.815000000000135 | -438.734 | -403.523 | -356.453 | -299.75 | -236.278 | -169.533 | -103.65 | -43.398 |
| 9.820000000000135 | -439.144 | -403.905 | -356.797 | -300.048 | -236.522 | -169.717 | -103.771 | -43.456 |
| 9.825000000000136 | -439.554 | -404.287 | -357.142 | -300.347 | -236.766 | -169.902 | -103.893 | -43.513 |
| 9.830000000000137 | -439.964 | -404.67 | -357.487 | -300.645 | -237.01 | -170.087 | -104.014 | -43.571 |
| 9.835000000000138 | -440.375 | -405.053 | -357.832 | -300.943 | -237.255 | -170.271 | -104.136 | -43.628 |
| 9.840000000000138 | -440.786 | -405.436 | -358.177 | -301.242 | -237.499 | -170.456 | -104.258 | -43.686 |
| 9.84500000000014 | -441.197 | -405.819 | -358.522 | -301.541 | -237.744 | -170.641 | -104.38 | -43.743 |
| 9.85000000000014 | -441.608 | -406.202 | -358.868 | -301.839 | -237.989 | -170.826 | -104.502 | -43.801 |
| 9.85500000000014 | -442.019 | -406.586 | -359.214 | -302.138 | -238.234 | -171.012 | -104.623 | -43.859 |
| 9.86000000000014 | -442.431 | -406.969 | -359.559 | -302.438 | -238.479 | -171.197 | -104.746 | -43.916 |
| 9.86500000000014 | -442.843 | -407.353 | -359.906 | -302.737 | -238.724 | -171.382 | -104.868 | -43.974 |
| 9.870000000000143 | -443.254 | -407.737 | -360.252 | -303.036 | -238.969 | -171.568 | -104.99 | -44.032 |
| 9.875000000000144 | -443.667 | -408.122 | -360.598 | -303.336 | -239.215 | -171.754 | -105.112 | -44.09 |
| 9.880000000000145 | -444.079 | -408.506 | -360.945 | -303.636 | -239.46 | -171.939 | -105.234 | -44.147 |
| 9.885000000000145 | -444.491 | -408.891 | -361.291 | -303.936 | -239.706 | -172.125 | -105.357 | -44.205 |
| 9.890000000000146 | -444.904 | -409.275 | -361.638 | -304.236 | -239.952 | -172.311 | -105.479 | -44.263 |
| 9.895000000000145 | -445.317 | -409.66 | -361.985 | -304.536 | -240.198 | -172.497 | -105.602 | -44.321 |
| 9.900000000000148 | -445.73 | -410.046 | -362.332 | -304.836 | -240.444 | -172.683 | -105.724 | -44.379 |
| 9.905000000000149 | -446.143 | -410.431 | -362.68 | -305.137 | -240.69 | -172.869 | -105.847 | -44.437 |
| 9.91000000000015 | -446.557 | -410.816 | -363.027 | -305.437 | -240.936 | -173.056 | -105.97 | -44.495 |
| 9.91500000000015 | -446.97 | -411.202 | -363.375 | -305.738 | -241.183 | -173.242 | -106.093 | -44.553 |
| 9.920000000000151 | -447.384 | -411.588 | -363.723 | -306.039 | -241.429 | -173.429 | -106.216 | -44.611 |
| 9.925000000000152 | -447.798 | -411.974 | -364.071 | -306.34 | -241.676 | -173.615 | -106.339 | -44.67 |
| 9.930000000000152 | -448.213 | -412.36 | -364.419 | -306.642 | -241.923 | -173.802 | -106.462 | -44.728 |
| 9.935000000000153 | -448.627 | -412.747 | -364.768 | -306.943 | -242.17 | -173.989 | -106.585 | -44.786 |
| 9.940000000000154 | -449.042 | -413.133 | -365.116 | -307.245 | -242.417 | -174.176 | -106.708 | -44.844 |
| 9.945000000000155 | -449.456 | -413.52 | -365.465 | -307.546 | -242.664 | -174.363 | -106.831 | -44.903 |
| 9.950000000000156 | -449.871 | -413.907 | -365.814 | -307.848 | -242.911 | -174.55 | -106.955 | -44.961 |
| 9.955000000000156 | -450.287 | -414.294 | -366.163 | -308.15 | -243.159 | -174.737 | -107.078 | -45.02 |
| 9.960000000000157 | -450.702 | -414.682 | -366.512 | -308.452 | -243.407 | -174.925 | -107.202 | -45.078 |
| 9.965000000000156 | -451.118 | -415.069 | -366.862 | -308.755 | -243.654 | -175.112 | -107.325 | -45.137 |
| 9.970000000000159 | -451.533 | -415.457 | -367.211 | -309.057 | -243.902 | -175.3 | -107.449 | -45.195 |
| 9.97500000000016 | -451.949 | -415.845 | -367.561 | -309.36 | -244.15 | -175.487 | -107.572 | -45.254 |
| 9.98000000000016 | -452.365 | -416.233 | -367.911 | -309.662 | -244.398 | -175.675 | -107.696 | -45.312 |
| 9.98500000000016 | -452.782 | -416.621 | -368.261 | -309.965 | -244.646 | -175.863 | -107.82 | -45.371 |
| 9.990000000000162 | -453.198 | -417.01 | -368.611 | -310.268 | -244.895 | -176.051 | -107.944 | -45.43 |
| 9.995000000000163 | -453.615 | -417.398 | -368.961 | -310.572 | -245.143 | -176.239 | -108.068 | -45.488 |
| 10.00000000000016 | -454.032 | -417.787 | -369.312 | -310.875 | -245.392 | -176.427 | -108.192 | -45.547 |